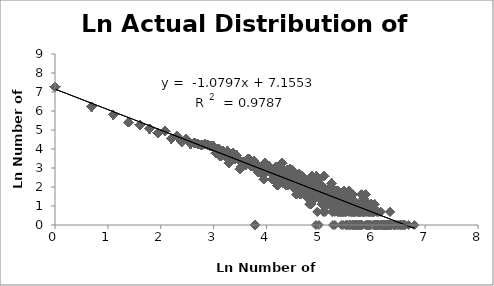
| Category | LnActual Number of Athletes |
|---|---|
| 6.79682 | 0 |
| 6.68711 | 0 |
| 6.62007 | 0 |
| 6.60935 | 0 |
| 6.59578 | 0 |
| 6.57647 | 0 |
| 6.56386 | 0 |
| 6.54391 | 0 |
| 6.54103 | 0 |
| 6.53814 | 0 |
| 6.52942 | 0 |
| 6.50578 | 0 |
| 6.48768 | 0 |
| 6.46303 | 0 |
| 6.43935 | 0 |
| 6.41673 | 0 |
| 6.4151 | 0 |
| 6.41182 | 0 |
| 6.40026 | 0 |
| 6.35957 | 0 |
| 6.35263 | 0 |
| 6.33683 | 0.693 |
| 6.33683 | 0.693 |
| 6.3315 | 0 |
| 6.32972 | 0 |
| 6.32257 | 0 |
| 6.30992 | 0 |
| 6.3081 | 0 |
| 6.30079 | 0 |
| 6.29527 | 0 |
| 6.28972 | 0 |
| 6.31716 | 0 |
| 6.2653 | 0 |
| 6.2634 | 0 |
| 6.25958 | 0 |
| 6.2519 | 0 |
| 6.24611 | 0 |
| 6.24222 | 0 |
| 6.24028 | 0 |
| 6.23048 | 0 |
| 6.22258 | 0 |
| 6.22059 | 0 |
| 6.21661 | 0 |
| 6.21461 | 0 |
| 6.21261 | 0 |
| 6.19848 | 0 |
| 6.19644 | 0 |
| 6.18621 | 0 |
| 6.18415 | 0 |
| 6.18208 | 0 |
| 6.17794 | 0 |
| 6.16542 | 0 |
| 6.16121 | 0.693 |
| 6.16121 | 0.693 |
| 6.1506 | 0 |
| 6.12468 | 0 |
| 6.12249 | 0 |
| 6.11589 | 0 |
| 6.11147 | 0.693 |
| 6.11147 | 0.693 |
| 6.10702 | 0 |
| 6.09807 | 0 |
| 6.09131 | 0.693 |
| 6.09131 | 0.693 |
| 6.08904 | 0 |
| 6.0845 | 0 |
| 6.08222 | 0 |
| 6.07074 | 0 |
| 6.06843 | 0 |
| 6.06611 | 0 |
| 6.06379 | 0 |
| 6.06146 | 0 |
| 6.05444 | 0 |
| 6.05209 | 0 |
| 6.04737 | 0 |
| 6.04501 | 1.099 |
| 6.04501 | 1.099 |
| 6.04501 | 1.099 |
| 6.04263 | 0 |
| 6.03548 | 0.693 |
| 6.03548 | 0.693 |
| 6.03309 | 0 |
| 6.02587 | 0.693 |
| 6.02587 | 0.693 |
| 6.01859 | 0 |
| 6.01372 | 0.693 |
| 6.01372 | 0.693 |
| 6.00881 | 0.693 |
| 6.00881 | 0.693 |
| 5.99894 | 0.693 |
| 5.99894 | 0.693 |
| 5.98394 | 1.099 |
| 5.98394 | 1.099 |
| 5.98394 | 1.099 |
| 5.98141 | 1.099 |
| 5.98141 | 1.099 |
| 5.98141 | 1.099 |
| 5.97889 | 0 |
| 5.97635 | 0.693 |
| 5.97635 | 0.693 |
| 5.97126 | 1.099 |
| 5.97126 | 1.099 |
| 5.97126 | 1.099 |
| 5.95842 | 0.693 |
| 5.95842 | 0.693 |
| 5.95584 | 0 |
| 5.95324 | 0 |
| 5.94542 | 0 |
| 5.94017 | 0.693 |
| 5.94017 | 0.693 |
| 5.93489 | 0 |
| 5.92959 | 1.099 |
| 5.92959 | 1.099 |
| 5.92959 | 1.099 |
| 5.92158 | 0.693 |
| 5.92158 | 0.693 |
| 5.91889 | 0 |
| 5.9162 | 0 |
| 5.9135 | 0 |
| 5.90808 | 0 |
| 5.90536 | 0 |
| 5.8999 | 0 |
| 5.89715 | 1.099 |
| 5.89715 | 1.099 |
| 5.89715 | 1.099 |
| 5.83481 | 0.693 |
| 5.88332 | 0.693 |
| 5.88332 | 0.693 |
| 5.88053 | 1.099 |
| 5.88053 | 1.099 |
| 5.88053 | 1.099 |
| 5.87774 | 1.099 |
| 5.87774 | 1.099 |
| 5.87774 | 1.099 |
| 5.87493 | 1.609 |
| 5.87493 | 1.609 |
| 5.87493 | 1.609 |
| 5.87493 | 1.609 |
| 5.87493 | 1.609 |
| 5.87212 | 0 |
| 5.85793 | 0.693 |
| 5.85793 | 0.693 |
| 5.83773 | 1.386 |
| 5.83773 | 1.386 |
| 5.83773 | 1.386 |
| 5.83773 | 1.386 |
| 5.83481 | 0.693 |
| 5.83188 | 0.693 |
| 5.83188 | 0.693 |
| 5.826 | 0.693 |
| 5.826 | 0.693 |
| 5.82305 | 0.693 |
| 5.82305 | 0.693 |
| 5.80814 | 0 |
| 5.80212 | 0 |
| 5.79909 | 1.609 |
| 5.79909 | 1.609 |
| 5.79909 | 1.609 |
| 5.79909 | 1.609 |
| 5.79909 | 1.609 |
| 5.79606 | 0 |
| 5.78996 | 0 |
| 5.7869 | 0.693 |
| 5.7869 | 0.693 |
| 5.78383 | 1.099 |
| 5.78383 | 1.099 |
| 5.78383 | 1.099 |
| 5.78074 | 1.099 |
| 5.78074 | 1.099 |
| 5.78074 | 1.099 |
| 5.77455 | 0 |
| 5.77144 | 0.693 |
| 5.77144 | 0.693 |
| 5.76832 | 0 |
| 5.76519 | 0 |
| 5.7589 | 0 |
| 5.75257 | 0.693 |
| 5.75257 | 0.693 |
| 5.74939 | 0.693 |
| 5.74939 | 0.693 |
| 5.7462 | 0 |
| 5.73979 | 0.693 |
| 5.73979 | 0.693 |
| 5.73657 | 0.693 |
| 5.73657 | 0.693 |
| 5.7301 | 1.099 |
| 5.7301 | 1.099 |
| 5.7301 | 1.099 |
| 5.72685 | 0 |
| 5.72031 | 0 |
| 5.71703 | 0.693 |
| 5.71703 | 0.693 |
| 5.71043 | 1.099 |
| 5.71043 | 1.099 |
| 5.71043 | 1.099 |
| 5.70378 | 0 |
| 5.70044 | 0 |
| 5.69709 | 0 |
| 5.69373 | 0 |
| 5.69036 | 0 |
| 5.68017 | 0.693 |
| 5.68017 | 0.693 |
| 5.67675 | 0 |
| 5.67332 | 0 |
| 5.66988 | 0 |
| 5.66643 | 0 |
| 5.66296 | 0.693 |
| 5.66296 | 0.693 |
| 5.65249 | 0.693 |
| 5.65249 | 0.693 |
| 5.64897 | 1.099 |
| 5.64897 | 1.099 |
| 5.64897 | 1.099 |
| 5.64545 | 0 |
| 5.64191 | 0.693 |
| 5.64191 | 0.693 |
| 5.63479 | 0 |
| 5.63121 | 1.609 |
| 5.63121 | 1.609 |
| 5.63121 | 1.609 |
| 5.63121 | 1.609 |
| 5.63121 | 1.609 |
| 5.62762 | 0.693 |
| 5.62762 | 0.693 |
| 5.62402 | 0 |
| 5.6204 | 0 |
| 5.61677 | 1.386 |
| 5.61677 | 1.386 |
| 5.61677 | 1.386 |
| 5.61677 | 1.386 |
| 5.61313 | 1.099 |
| 5.61313 | 1.099 |
| 5.61313 | 1.099 |
| 5.6058 | 0.693 |
| 5.6058 | 0.693 |
| 5.60212 | 1.099 |
| 5.60212 | 1.099 |
| 5.60212 | 1.099 |
| 5.59842 | 0.693 |
| 5.59842 | 0.693 |
| 5.59471 | 0 |
| 5.58725 | 1.386 |
| 5.58725 | 1.386 |
| 5.58725 | 1.386 |
| 5.58725 | 1.386 |
| 5.5835 | 1.099 |
| 5.5835 | 1.099 |
| 5.5835 | 1.099 |
| 5.57973 | 1.386 |
| 5.57973 | 1.386 |
| 5.57973 | 1.386 |
| 5.57973 | 1.386 |
| 5.57595 | 0 |
| 5.57215 | 0 |
| 5.56834 | 1.609 |
| 5.56834 | 1.609 |
| 5.56834 | 1.609 |
| 5.56834 | 1.609 |
| 5.56834 | 1.609 |
| 5.56452 | 1.099 |
| 5.56452 | 1.099 |
| 5.56452 | 1.099 |
| 5.56068 | 0.693 |
| 5.56068 | 0.693 |
| 5.55683 | 1.792 |
| 5.55683 | 1.792 |
| 5.55683 | 1.792 |
| 5.55683 | 1.792 |
| 5.55683 | 1.792 |
| 5.55683 | 1.792 |
| 5.54908 | 1.386 |
| 5.54908 | 1.386 |
| 5.54908 | 1.386 |
| 5.54908 | 1.386 |
| 5.54518 | 1.099 |
| 5.54518 | 1.099 |
| 5.54518 | 1.099 |
| 5.54126 | 0 |
| 5.53339 | 1.609 |
| 5.53339 | 1.609 |
| 5.53339 | 1.609 |
| 5.53339 | 1.609 |
| 5.53339 | 1.609 |
| 5.52943 | 1.099 |
| 5.52943 | 1.099 |
| 5.52943 | 1.099 |
| 5.52545 | 0 |
| 5.52146 | 1.386 |
| 5.52146 | 1.386 |
| 5.52146 | 1.386 |
| 5.52146 | 1.386 |
| 5.51745 | 1.386 |
| 5.51745 | 1.386 |
| 5.51745 | 1.386 |
| 5.51745 | 1.386 |
| 5.51343 | 1.099 |
| 5.51343 | 1.099 |
| 5.51343 | 1.099 |
| 5.50939 | 0 |
| 5.50533 | 0.693 |
| 5.50533 | 0.693 |
| 5.50126 | 0 |
| 5.49717 | 1.609 |
| 5.49717 | 1.609 |
| 5.49717 | 1.609 |
| 5.49717 | 1.609 |
| 5.49717 | 1.609 |
| 5.49306 | 0.693 |
| 5.49306 | 0.693 |
| 5.48894 | 1.609 |
| 5.48894 | 1.609 |
| 5.48894 | 1.609 |
| 5.48894 | 1.609 |
| 5.48894 | 1.609 |
| 5.4848 | 1.099 |
| 5.4848 | 1.099 |
| 5.4848 | 1.099 |
| 5.48064 | 1.099 |
| 5.48064 | 1.099 |
| 5.48064 | 1.099 |
| 5.47646 | 1.386 |
| 5.47646 | 1.386 |
| 5.47646 | 1.386 |
| 5.47646 | 1.386 |
| 5.47227 | 1.792 |
| 5.47227 | 1.792 |
| 5.47227 | 1.792 |
| 5.47227 | 1.792 |
| 5.47227 | 1.792 |
| 5.47227 | 1.792 |
| 5.46806 | 0.693 |
| 5.46806 | 0.693 |
| 5.46383 | 1.792 |
| 5.46383 | 1.792 |
| 5.46383 | 1.792 |
| 5.46383 | 1.792 |
| 5.46383 | 1.792 |
| 5.46383 | 1.792 |
| 5.45532 | 0.693 |
| 5.45532 | 0.693 |
| 5.45104 | 0 |
| 5.44674 | 1.099 |
| 5.44674 | 1.099 |
| 5.44674 | 1.099 |
| 5.44242 | 0.693 |
| 5.44242 | 0.693 |
| 5.43808 | 1.386 |
| 5.43808 | 1.386 |
| 5.43808 | 1.386 |
| 5.43808 | 1.386 |
| 5.43372 | 1.609 |
| 5.43372 | 1.609 |
| 5.43372 | 1.609 |
| 5.43372 | 1.609 |
| 5.43372 | 1.609 |
| 5.42935 | 1.386 |
| 5.42935 | 1.386 |
| 5.42935 | 1.386 |
| 5.42935 | 1.386 |
| 5.42495 | 1.386 |
| 5.42495 | 1.386 |
| 5.42495 | 1.386 |
| 5.42495 | 1.386 |
| 5.42053 | 0.693 |
| 5.42053 | 0.693 |
| 5.4161 | 0 |
| 5.41165 | 1.099 |
| 5.41165 | 1.099 |
| 5.41165 | 1.099 |
| 5.40717 | 1.386 |
| 5.40717 | 1.386 |
| 5.40717 | 1.386 |
| 5.40717 | 1.386 |
| 5.40268 | 0.693 |
| 5.40268 | 0.693 |
| 5.39816 | 0.693 |
| 5.39816 | 0.693 |
| 5.39363 | 1.386 |
| 5.39363 | 1.386 |
| 5.39363 | 1.386 |
| 5.39363 | 1.386 |
| 5.38907 | 0.693 |
| 5.38907 | 0.693 |
| 5.3799 | 1.099 |
| 5.3799 | 1.099 |
| 5.3799 | 1.099 |
| 5.37528 | 1.386 |
| 5.37528 | 1.386 |
| 5.37528 | 1.386 |
| 5.37528 | 1.386 |
| 5.37064 | 1.609 |
| 5.37064 | 1.609 |
| 5.37064 | 1.609 |
| 5.37064 | 1.609 |
| 5.37064 | 1.609 |
| 5.36598 | 1.609 |
| 5.36598 | 1.609 |
| 5.36598 | 1.609 |
| 5.36598 | 1.609 |
| 5.36598 | 1.609 |
| 5.36129 | 0.693 |
| 5.36129 | 0.693 |
| 5.35659 | 1.792 |
| 5.35659 | 1.792 |
| 5.35659 | 1.792 |
| 5.35659 | 1.792 |
| 5.35659 | 1.792 |
| 5.35659 | 1.792 |
| 5.35186 | 1.099 |
| 5.35186 | 1.099 |
| 5.35186 | 1.099 |
| 5.34711 | 0.693 |
| 5.34711 | 0.693 |
| 5.34233 | 1.099 |
| 5.34233 | 1.099 |
| 5.34233 | 1.099 |
| 5.33754 | 1.386 |
| 5.33754 | 1.386 |
| 5.33754 | 1.386 |
| 5.33754 | 1.386 |
| 5.33272 | 1.609 |
| 5.33272 | 1.609 |
| 5.33272 | 1.609 |
| 5.33272 | 1.609 |
| 5.33272 | 1.609 |
| 5.32788 | 1.792 |
| 5.32788 | 1.792 |
| 5.32788 | 1.792 |
| 5.32788 | 1.792 |
| 5.32788 | 1.792 |
| 5.32788 | 1.792 |
| 5.32301 | 1.386 |
| 5.32301 | 1.386 |
| 5.32301 | 1.386 |
| 5.32301 | 1.386 |
| 5.31812 | 1.099 |
| 5.31812 | 1.099 |
| 5.31812 | 1.099 |
| 5.31321 | 1.386 |
| 5.31321 | 1.386 |
| 5.31321 | 1.386 |
| 5.31321 | 1.386 |
| 5.30827 | 1.609 |
| 5.30827 | 1.609 |
| 5.30827 | 1.609 |
| 5.30827 | 1.609 |
| 5.30827 | 1.609 |
| 5.3033 | 1.609 |
| 5.3033 | 1.609 |
| 5.3033 | 1.609 |
| 5.3033 | 1.609 |
| 5.3033 | 1.609 |
| 5.29832 | 1.099 |
| 5.29832 | 1.099 |
| 5.29832 | 1.099 |
| 5.2933 | 0 |
| 5.28827 | 0.693 |
| 5.28827 | 0.693 |
| 5.2832 | 1.099 |
| 5.2832 | 1.099 |
| 5.2832 | 1.099 |
| 5.27811 | 1.792 |
| 5.27811 | 1.792 |
| 5.27811 | 1.792 |
| 5.27811 | 1.792 |
| 5.27811 | 1.792 |
| 5.27811 | 1.792 |
| 5.273 | 1.099 |
| 5.273 | 1.099 |
| 5.273 | 1.099 |
| 5.26786 | 1.386 |
| 2.99573 | 4.143 |
| 5.26786 | 1.386 |
| 5.26786 | 1.386 |
| 5.26786 | 1.386 |
| 5.26269 | 1.792 |
| 5.26269 | 1.792 |
| 5.26269 | 1.792 |
| 5.26269 | 1.792 |
| 5.26269 | 1.792 |
| 5.26269 | 1.792 |
| 5.2575 | 0 |
| 2.99573 | 4.143 |
| 5.25227 | 1.386 |
| 5.25227 | 1.386 |
| 5.25227 | 1.386 |
| 5.25227 | 1.386 |
| 5.24702 | 1.946 |
| 5.24702 | 1.946 |
| 5.24702 | 1.946 |
| 5.24702 | 1.946 |
| 5.24702 | 1.946 |
| 5.24702 | 1.946 |
| 5.24702 | 1.946 |
| 5.24175 | 0.693 |
| 5.24175 | 0.693 |
| 5.23644 | 1.609 |
| 5.23644 | 1.609 |
| 5.23644 | 1.609 |
| 5.23644 | 1.609 |
| 5.23644 | 1.609 |
| 5.23111 | 2.197 |
| 5.23111 | 2.197 |
| 5.23111 | 2.197 |
| 5.23111 | 2.197 |
| 5.23111 | 2.197 |
| 5.23111 | 2.197 |
| 5.23111 | 2.197 |
| 5.23111 | 2.197 |
| 5.23111 | 2.197 |
| 5.22575 | 1.386 |
| 5.22575 | 1.386 |
| 5.22575 | 1.386 |
| 5.22575 | 1.386 |
| 5.22036 | 1.386 |
| 5.22036 | 1.386 |
| 5.22036 | 1.386 |
| 5.22036 | 1.386 |
| 5.21494 | 1.099 |
| 5.21494 | 1.099 |
| 5.21494 | 1.099 |
| 5.20949 | 1.609 |
| 5.20949 | 1.609 |
| 5.20949 | 1.609 |
| 5.20949 | 1.609 |
| 5.20949 | 1.609 |
| 5.20401 | 1.946 |
| 5.20401 | 1.946 |
| 5.20401 | 1.946 |
| 5.20401 | 1.946 |
| 5.20401 | 1.946 |
| 5.20401 | 1.946 |
| 5.20401 | 1.946 |
| 5.1985 | 1.099 |
| 5.1985 | 1.099 |
| 5.1985 | 1.099 |
| 5.19296 | 1.609 |
| 5.19296 | 1.609 |
| 5.19296 | 1.609 |
| 5.19296 | 1.609 |
| 5.19296 | 1.609 |
| 5.18739 | 1.386 |
| 5.18739 | 1.386 |
| 5.18739 | 1.386 |
| 5.18739 | 1.386 |
| 5.18178 | 1.099 |
| 5.18178 | 1.099 |
| 5.18178 | 1.099 |
| 5.17615 | 1.386 |
| 5.17615 | 1.386 |
| 5.17615 | 1.386 |
| 5.17615 | 1.386 |
| 5.17048 | 1.386 |
| 5.17048 | 1.386 |
| 5.17048 | 1.386 |
| 5.17048 | 1.386 |
| 5.16479 | 1.386 |
| 5.16479 | 1.386 |
| 5.16479 | 1.386 |
| 5.16479 | 1.386 |
| 5.15906 | 1.099 |
| 5.15906 | 1.099 |
| 5.15906 | 1.099 |
| 5.15329 | 1.609 |
| 5.15329 | 1.609 |
| 5.15329 | 1.609 |
| 5.15329 | 1.609 |
| 5.15329 | 1.609 |
| 5.14749 | 1.792 |
| 5.14749 | 1.792 |
| 5.14749 | 1.792 |
| 5.14749 | 1.792 |
| 5.14749 | 1.792 |
| 5.14749 | 1.792 |
| 5.14166 | 1.609 |
| 5.14166 | 1.609 |
| 5.14166 | 1.609 |
| 5.14166 | 1.609 |
| 5.14166 | 1.609 |
| 5.1358 | 1.386 |
| 5.1358 | 1.386 |
| 5.1358 | 1.386 |
| 5.1358 | 1.386 |
| 5.1299 | 1.386 |
| 5.1299 | 1.386 |
| 5.1299 | 1.386 |
| 5.1299 | 1.386 |
| 5.1299 | 1.386 |
| 5.12396 | 1.386 |
| 5.12396 | 1.386 |
| 5.12396 | 1.386 |
| 5.12396 | 1.386 |
| 5.11799 | 1.099 |
| 5.11799 | 1.099 |
| 5.11799 | 1.099 |
| 5.11199 | 1.792 |
| 5.11199 | 1.792 |
| 5.11199 | 1.792 |
| 5.11199 | 1.792 |
| 5.11199 | 1.792 |
| 5.11199 | 1.792 |
| 5.10595 | 0.693 |
| 5.10595 | 0.693 |
| 5.09987 | 1.792 |
| 5.09987 | 1.792 |
| 5.09987 | 1.792 |
| 5.09987 | 1.792 |
| 5.09987 | 1.792 |
| 5.09987 | 1.792 |
| 5.09375 | 1.386 |
| 5.09375 | 1.386 |
| 5.09375 | 1.386 |
| 5.09375 | 1.386 |
| 5.0876 | 2.565 |
| 5.0876 | 2.565 |
| 5.0876 | 2.565 |
| 5.0876 | 2.565 |
| 5.0876 | 2.565 |
| 5.0876 | 2.565 |
| 5.0876 | 2.565 |
| 5.0876 | 2.565 |
| 5.0876 | 2.565 |
| 5.0876 | 2.565 |
| 5.0876 | 2.565 |
| 5.0876 | 2.565 |
| 5.0876 | 2.565 |
| 5.0814 | 1.946 |
| 5.0814 | 1.946 |
| 5.0814 | 1.946 |
| 5.0814 | 1.946 |
| 5.0814 | 1.946 |
| 5.0814 | 1.946 |
| 5.0814 | 1.946 |
| 5.07517 | 0.693 |
| 5.07517 | 0.693 |
| 5.0689 | 1.099 |
| 5.0689 | 1.099 |
| 5.0689 | 1.099 |
| 5.0626 | 1.609 |
| 5.0626 | 1.609 |
| 5.0626 | 1.609 |
| 5.0626 | 1.609 |
| 5.0626 | 1.609 |
| 5.05625 | 1.099 |
| 5.05625 | 1.099 |
| 5.05625 | 1.099 |
| 5.04986 | 1.099 |
| 5.04986 | 1.099 |
| 5.04986 | 1.099 |
| 5.04343 | 2.079 |
| 5.04343 | 2.079 |
| 5.04343 | 2.079 |
| 5.04343 | 2.079 |
| 5.04343 | 2.079 |
| 5.04343 | 2.079 |
| 5.04343 | 2.079 |
| 5.04343 | 2.079 |
| 5.03695 | 2.079 |
| 5.03695 | 2.079 |
| 5.03695 | 2.079 |
| 5.03695 | 2.079 |
| 5.03695 | 2.079 |
| 5.03695 | 2.079 |
| 5.03695 | 2.079 |
| 5.03695 | 2.079 |
| 5.03044 | 2.079 |
| 5.03044 | 2.079 |
| 5.03044 | 2.079 |
| 5.03044 | 2.079 |
| 5.03044 | 2.079 |
| 5.03044 | 2.079 |
| 5.03044 | 2.079 |
| 5.03044 | 2.079 |
| 5.02388 | 1.792 |
| 5.02388 | 1.792 |
| 5.02388 | 1.792 |
| 5.02388 | 1.792 |
| 5.02388 | 1.792 |
| 5.02388 | 1.792 |
| 5.01728 | 1.946 |
| 5.01728 | 1.946 |
| 5.01728 | 1.946 |
| 5.01728 | 1.946 |
| 5.01728 | 1.946 |
| 5.01728 | 1.946 |
| 5.01728 | 1.946 |
| 5.01064 | 1.946 |
| 5.01064 | 1.946 |
| 5.01064 | 1.946 |
| 5.01064 | 1.946 |
| 5.01064 | 1.946 |
| 5.01064 | 1.946 |
| 5.01064 | 1.946 |
| 5.00395 | 1.386 |
| 5.00395 | 1.386 |
| 5.00395 | 1.386 |
| 5.00395 | 1.386 |
| 4.99721 | 1.946 |
| 4.99721 | 1.946 |
| 4.99721 | 1.946 |
| 4.99721 | 1.946 |
| 4.99721 | 1.946 |
| 4.99721 | 1.946 |
| 4.99721 | 1.946 |
| 4.99043 | 0 |
| 4.98361 | 2.079 |
| 4.98361 | 2.079 |
| 4.98361 | 2.079 |
| 4.98361 | 2.079 |
| 4.98361 | 2.079 |
| 4.98361 | 2.079 |
| 4.98361 | 2.079 |
| 4.98361 | 2.079 |
| 4.97673 | 2.398 |
| 4.97673 | 2.398 |
| 4.97673 | 2.398 |
| 4.97673 | 2.398 |
| 4.97673 | 2.398 |
| 4.97673 | 2.398 |
| 4.97673 | 2.398 |
| 4.97673 | 2.398 |
| 4.97673 | 2.398 |
| 4.97673 | 2.398 |
| 4.97673 | 2.398 |
| 4.96981 | 1.946 |
| 4.96981 | 1.946 |
| 4.96981 | 1.946 |
| 4.96981 | 1.946 |
| 4.96981 | 1.946 |
| 4.96981 | 1.946 |
| 4.96981 | 1.946 |
| 4.96284 | 0.693 |
| 4.96284 | 0.693 |
| 4.95583 | 1.792 |
| 4.95583 | 1.792 |
| 4.95583 | 1.792 |
| 4.95583 | 1.792 |
| 4.95583 | 1.792 |
| 4.95583 | 1.792 |
| 4.94876 | 1.792 |
| 4.94876 | 1.792 |
| 4.94876 | 1.792 |
| 4.94876 | 1.792 |
| 4.94876 | 1.792 |
| 4.94876 | 1.792 |
| 4.94164 | 2.565 |
| 4.94164 | 2.565 |
| 4.94164 | 2.565 |
| 4.94164 | 2.565 |
| 4.94164 | 2.565 |
| 4.94164 | 2.565 |
| 4.94164 | 2.565 |
| 4.94164 | 2.565 |
| 4.94164 | 2.565 |
| 4.94164 | 2.565 |
| 4.94164 | 2.565 |
| 4.94164 | 2.565 |
| 4.94164 | 2.565 |
| 4.93447 | 0 |
| 4.92725 | 1.946 |
| 4.92725 | 1.946 |
| 4.92725 | 1.946 |
| 4.92725 | 1.946 |
| 4.92725 | 1.946 |
| 4.92725 | 1.946 |
| 4.92725 | 1.946 |
| 4.91998 | 2.079 |
| 4.91998 | 2.079 |
| 4.91998 | 2.079 |
| 4.91998 | 2.079 |
| 4.91998 | 2.079 |
| 4.91998 | 2.079 |
| 4.91998 | 2.079 |
| 4.91998 | 2.079 |
| 4.91265 | 1.386 |
| 4.91265 | 1.386 |
| 4.91265 | 1.386 |
| 4.91265 | 1.386 |
| 4.90527 | 1.792 |
| 4.90527 | 1.792 |
| 4.90527 | 1.792 |
| 4.90527 | 1.792 |
| 4.90527 | 1.792 |
| 4.90527 | 1.792 |
| 4.89784 | 1.946 |
| 4.89784 | 1.946 |
| 4.89784 | 1.946 |
| 4.89784 | 1.946 |
| 4.89784 | 1.946 |
| 4.89784 | 1.946 |
| 4.89784 | 1.946 |
| 4.89035 | 1.609 |
| 4.89035 | 1.609 |
| 4.89035 | 1.609 |
| 4.89035 | 1.609 |
| 4.89035 | 1.609 |
| 4.8828 | 1.609 |
| 4.8828 | 1.609 |
| 4.8828 | 1.609 |
| 4.8828 | 1.609 |
| 4.8828 | 1.609 |
| 4.8752 | 1.609 |
| 4.8752 | 1.609 |
| 4.8752 | 1.609 |
| 4.8752 | 1.609 |
| 4.8752 | 1.609 |
| 4.86753 | 2.079 |
| 2.99573 | 4.143 |
| 4.86753 | 2.079 |
| 4.86753 | 2.079 |
| 4.86753 | 2.079 |
| 4.86753 | 2.079 |
| 4.86753 | 2.079 |
| 4.86753 | 2.079 |
| 4.86753 | 2.079 |
| 4.85981 | 2.565 |
| 4.85981 | 2.565 |
| 4.85981 | 2.565 |
| 4.85981 | 2.565 |
| 4.85981 | 2.565 |
| 4.85981 | 2.565 |
| 4.85981 | 2.565 |
| 4.85981 | 2.565 |
| 4.85981 | 2.565 |
| 4.85981 | 2.565 |
| 4.85981 | 2.565 |
| 4.85981 | 2.565 |
| 4.85981 | 2.565 |
| 4.85203 | 2.398 |
| 4.85203 | 2.398 |
| 4.85203 | 2.398 |
| 4.85203 | 2.398 |
| 4.85203 | 2.398 |
| 4.85203 | 2.398 |
| 4.85203 | 2.398 |
| 4.85203 | 2.398 |
| 4.85203 | 2.398 |
| 4.85203 | 2.398 |
| 4.85203 | 2.398 |
| 4.84419 | 1.099 |
| 4.84419 | 1.099 |
| 4.84419 | 1.099 |
| 4.83628 | 1.609 |
| 4.83628 | 1.609 |
| 4.83628 | 1.609 |
| 4.83628 | 1.609 |
| 4.83628 | 1.609 |
| 4.82831 | 1.609 |
| 4.82831 | 1.609 |
| 4.82831 | 1.609 |
| 4.82831 | 1.609 |
| 4.82831 | 1.609 |
| 4.82028 | 1.099 |
| 4.82028 | 1.099 |
| 4.82028 | 1.099 |
| 4.81218 | 1.099 |
| 4.81218 | 1.099 |
| 4.81218 | 1.099 |
| 4.80402 | 2.303 |
| 4.80402 | 2.303 |
| 4.80402 | 2.303 |
| 4.80402 | 2.303 |
| 4.80402 | 2.303 |
| 4.80402 | 2.303 |
| 4.80402 | 2.303 |
| 4.80402 | 2.303 |
| 4.80402 | 2.303 |
| 4.80402 | 2.303 |
| 4.79579 | 1.386 |
| 4.79579 | 1.386 |
| 4.79579 | 1.386 |
| 4.79579 | 1.386 |
| 4.78749 | 1.386 |
| 4.78749 | 1.386 |
| 4.78749 | 1.386 |
| 4.78749 | 1.386 |
| 4.77912 | 1.946 |
| 4.77912 | 1.946 |
| 4.77912 | 1.946 |
| 4.77912 | 1.946 |
| 4.77912 | 1.946 |
| 4.77912 | 1.946 |
| 4.77912 | 1.946 |
| 4.77068 | 2.197 |
| 4.77068 | 2.197 |
| 4.77068 | 2.197 |
| 4.77068 | 2.197 |
| 4.77068 | 2.197 |
| 4.77068 | 2.197 |
| 4.77068 | 2.197 |
| 4.77068 | 2.197 |
| 4.77068 | 2.197 |
| 4.76217 | 1.609 |
| 4.76217 | 1.609 |
| 4.76217 | 1.609 |
| 4.76217 | 1.609 |
| 4.76217 | 1.609 |
| 4.75359 | 2.197 |
| 4.75359 | 2.197 |
| 4.75359 | 2.197 |
| 4.75359 | 2.197 |
| 4.75359 | 2.197 |
| 4.75359 | 2.197 |
| 4.75359 | 2.197 |
| 4.75359 | 2.197 |
| 4.75359 | 2.197 |
| 4.74493 | 2.303 |
| 4.74493 | 2.303 |
| 4.74493 | 2.303 |
| 4.74493 | 2.303 |
| 4.74493 | 2.303 |
| 4.74493 | 2.303 |
| 4.74493 | 2.303 |
| 4.74493 | 2.303 |
| 4.74493 | 2.303 |
| 4.74493 | 2.303 |
| 4.7362 | 1.946 |
| 4.7362 | 1.946 |
| 4.7362 | 1.946 |
| 4.7362 | 1.946 |
| 4.7362 | 1.946 |
| 4.7362 | 1.946 |
| 4.7362 | 1.946 |
| 4.72739 | 1.609 |
| 4.72739 | 1.609 |
| 4.72739 | 1.609 |
| 4.72739 | 1.609 |
| 4.72739 | 1.609 |
| 4.7185 | 1.946 |
| 4.7185 | 1.946 |
| 4.7185 | 1.946 |
| 4.7185 | 1.946 |
| 4.7185 | 1.946 |
| 4.7185 | 1.946 |
| 4.7185 | 1.946 |
| 4.70953 | 2.303 |
| 4.70953 | 2.303 |
| 4.70953 | 2.303 |
| 4.70953 | 2.303 |
| 4.70953 | 2.303 |
| 4.70953 | 2.303 |
| 4.70953 | 2.303 |
| 4.70953 | 2.303 |
| 4.70953 | 2.303 |
| 4.70953 | 2.303 |
| 4.70953 | 2.303 |
| 4.70953 | 2.303 |
| 4.70048 | 1.946 |
| 4.70048 | 1.946 |
| 4.70048 | 1.946 |
| 4.70048 | 1.946 |
| 4.70048 | 1.946 |
| 4.70048 | 1.946 |
| 4.70048 | 1.946 |
| 4.69135 | 1.946 |
| 4.69135 | 1.946 |
| 4.69135 | 1.946 |
| 4.69135 | 1.946 |
| 4.69135 | 1.946 |
| 4.69135 | 1.946 |
| 4.69135 | 1.946 |
| 4.68213 | 1.946 |
| 4.68213 | 1.946 |
| 4.68213 | 1.946 |
| 4.68213 | 1.946 |
| 4.68213 | 1.946 |
| 4.68213 | 1.946 |
| 4.68213 | 1.946 |
| 4.67283 | 2.565 |
| 4.67283 | 2.565 |
| 4.67283 | 2.565 |
| 4.67283 | 2.565 |
| 4.67283 | 2.565 |
| 4.67283 | 2.565 |
| 4.67283 | 2.565 |
| 4.67283 | 2.565 |
| 4.67283 | 2.565 |
| 4.67283 | 2.565 |
| 4.67283 | 2.565 |
| 4.67283 | 2.565 |
| 4.67283 | 2.565 |
| 4.66344 | 2.398 |
| 4.66344 | 2.398 |
| 4.66344 | 2.398 |
| 4.66344 | 2.398 |
| 4.66344 | 2.398 |
| 4.66344 | 2.398 |
| 4.66344 | 2.398 |
| 4.66344 | 2.398 |
| 4.66344 | 2.398 |
| 4.66344 | 2.398 |
| 4.66344 | 2.398 |
| 4.65396 | 2.485 |
| 4.65396 | 2.485 |
| 4.65396 | 2.485 |
| 4.65396 | 2.485 |
| 4.65396 | 2.485 |
| 4.65396 | 2.485 |
| 4.65396 | 2.485 |
| 4.65396 | 2.485 |
| 4.65396 | 2.485 |
| 4.65396 | 2.485 |
| 4.65396 | 2.485 |
| 4.65396 | 2.485 |
| 4.64439 | 1.609 |
| 4.64439 | 1.609 |
| 4.64439 | 1.609 |
| 4.64439 | 1.609 |
| 4.64439 | 1.609 |
| 4.63473 | 1.609 |
| 4.63473 | 1.609 |
| 4.63473 | 1.609 |
| 4.63473 | 1.609 |
| 4.63473 | 1.609 |
| 4.62497 | 2.639 |
| 4.62497 | 2.639 |
| 4.62497 | 2.639 |
| 4.62497 | 2.639 |
| 4.62497 | 2.639 |
| 4.62497 | 2.639 |
| 4.62497 | 2.639 |
| 4.62497 | 2.639 |
| 4.62497 | 2.639 |
| 4.62497 | 2.639 |
| 4.62497 | 2.639 |
| 4.62497 | 2.639 |
| 4.62497 | 2.639 |
| 4.62497 | 2.639 |
| 4.61512 | 2.708 |
| 4.61512 | 2.708 |
| 4.61512 | 2.708 |
| 4.61512 | 2.708 |
| 4.61512 | 2.708 |
| 4.61512 | 2.708 |
| 4.61512 | 2.708 |
| 4.61512 | 2.708 |
| 4.61512 | 2.708 |
| 4.61512 | 2.708 |
| 4.61512 | 2.708 |
| 4.61512 | 2.708 |
| 4.61512 | 2.708 |
| 4.61512 | 2.708 |
| 4.61512 | 2.708 |
| 4.60517 | 2.565 |
| 4.60517 | 2.565 |
| 4.60517 | 2.565 |
| 4.60517 | 2.565 |
| 4.60517 | 2.565 |
| 4.60517 | 2.565 |
| 4.60517 | 2.565 |
| 4.60517 | 2.565 |
| 4.60517 | 2.565 |
| 4.60517 | 2.565 |
| 4.60517 | 2.565 |
| 4.60517 | 2.565 |
| 4.60517 | 2.565 |
| 4.59512 | 2.303 |
| 4.59512 | 2.303 |
| 4.59512 | 2.303 |
| 4.59512 | 2.303 |
| 4.59512 | 2.303 |
| 4.59512 | 2.303 |
| 4.59512 | 2.303 |
| 4.59512 | 2.303 |
| 4.59512 | 2.303 |
| 4.59512 | 2.303 |
| 4.58497 | 1.946 |
| 4.58497 | 1.946 |
| 4.58497 | 1.946 |
| 4.58497 | 1.946 |
| 4.58497 | 1.946 |
| 4.58497 | 1.946 |
| 4.58497 | 1.946 |
| 4.57471 | 2.485 |
| 4.57471 | 2.485 |
| 4.57471 | 2.485 |
| 4.57471 | 2.485 |
| 4.57471 | 2.485 |
| 4.57471 | 2.485 |
| 4.57471 | 2.485 |
| 4.57471 | 2.485 |
| 4.57471 | 2.485 |
| 4.57471 | 2.485 |
| 4.57471 | 2.485 |
| 4.57471 | 2.485 |
| 4.56435 | 1.609 |
| 4.56435 | 1.609 |
| 4.56435 | 1.609 |
| 4.56435 | 1.609 |
| 4.56435 | 1.609 |
| 4.55388 | 2.565 |
| 4.55388 | 2.565 |
| 4.55388 | 2.565 |
| 4.55388 | 2.565 |
| 4.55388 | 2.565 |
| 4.55388 | 2.565 |
| 4.55388 | 2.565 |
| 4.55388 | 2.565 |
| 4.55388 | 2.565 |
| 4.55388 | 2.565 |
| 4.55388 | 2.565 |
| 4.55388 | 2.565 |
| 4.55388 | 2.565 |
| 4.54329 | 2.303 |
| 4.54329 | 2.303 |
| 4.54329 | 2.303 |
| 4.54329 | 2.303 |
| 4.54329 | 2.303 |
| 4.54329 | 2.303 |
| 4.54329 | 2.303 |
| 4.54329 | 2.303 |
| 4.54329 | 2.303 |
| 4.54329 | 2.303 |
| 4.5326 | 2.398 |
| 4.5326 | 2.398 |
| 4.5326 | 2.398 |
| 4.5326 | 2.398 |
| 4.5326 | 2.398 |
| 4.5326 | 2.398 |
| 4.5326 | 2.398 |
| 4.5326 | 2.398 |
| 4.5326 | 2.398 |
| 4.5326 | 2.398 |
| 4.5326 | 2.398 |
| 4.52179 | 1.946 |
| 4.52179 | 1.946 |
| 4.52179 | 1.946 |
| 4.52179 | 1.946 |
| 4.52179 | 1.946 |
| 4.52179 | 1.946 |
| 4.52179 | 1.946 |
| 4.51086 | 2.303 |
| 4.51086 | 2.303 |
| 4.51086 | 2.303 |
| 4.51086 | 2.303 |
| 4.51086 | 2.303 |
| 4.51086 | 2.303 |
| 4.51086 | 2.303 |
| 4.51086 | 2.303 |
| 4.51086 | 2.303 |
| 4.51086 | 2.303 |
| 4.49981 | 2.197 |
| 4.49981 | 2.197 |
| 4.49981 | 2.197 |
| 4.49981 | 2.197 |
| 4.49981 | 2.197 |
| 4.49981 | 2.197 |
| 4.49981 | 2.197 |
| 4.49981 | 2.197 |
| 4.49981 | 2.197 |
| 4.48864 | 2.079 |
| 4.48864 | 2.079 |
| 4.48864 | 2.079 |
| 4.48864 | 2.079 |
| 4.48864 | 2.079 |
| 4.48864 | 2.079 |
| 4.48864 | 2.079 |
| 4.48864 | 2.079 |
| 4.47734 | 2.89 |
| 4.47734 | 2.89 |
| 4.47734 | 2.89 |
| 4.47734 | 2.89 |
| 4.47734 | 2.89 |
| 4.47734 | 2.89 |
| 4.47734 | 2.89 |
| 4.47734 | 2.89 |
| 4.47734 | 2.89 |
| 4.47734 | 2.89 |
| 4.47734 | 2.89 |
| 4.47734 | 2.89 |
| 4.47734 | 2.89 |
| 4.47734 | 2.89 |
| 4.47734 | 2.89 |
| 4.47734 | 2.89 |
| 4.47734 | 2.89 |
| 4.47734 | 2.89 |
| 4.46591 | 2.197 |
| 4.46591 | 2.197 |
| 4.46591 | 2.197 |
| 4.46591 | 2.197 |
| 4.46591 | 2.197 |
| 4.46591 | 2.197 |
| 4.46591 | 2.197 |
| 4.46591 | 2.197 |
| 4.46591 | 2.197 |
| 4.45435 | 2.485 |
| 4.45435 | 2.485 |
| 4.45435 | 2.485 |
| 4.45435 | 2.485 |
| 4.45435 | 2.485 |
| 4.45435 | 2.485 |
| 4.45435 | 2.485 |
| 4.45435 | 2.485 |
| 4.45435 | 2.485 |
| 4.45435 | 2.485 |
| 4.45435 | 2.485 |
| 4.45435 | 2.485 |
| 4.44265 | 2.944 |
| 4.44265 | 2.944 |
| 4.44265 | 2.944 |
| 4.44265 | 2.944 |
| 4.44265 | 2.944 |
| 4.44265 | 2.944 |
| 4.44265 | 2.944 |
| 4.44265 | 2.944 |
| 4.44265 | 2.944 |
| 4.44265 | 2.944 |
| 4.44265 | 2.944 |
| 4.44265 | 2.944 |
| 4.44265 | 2.944 |
| 4.44265 | 2.944 |
| 4.44265 | 2.944 |
| 4.44265 | 2.944 |
| 4.44265 | 2.944 |
| 4.44265 | 2.944 |
| 4.44265 | 2.944 |
| 4.43082 | 2.485 |
| 4.43082 | 2.485 |
| 4.43082 | 2.485 |
| 4.43082 | 2.485 |
| 4.43082 | 2.485 |
| 4.43082 | 2.485 |
| 4.43082 | 2.485 |
| 4.43082 | 2.485 |
| 4.43082 | 2.485 |
| 4.43082 | 2.485 |
| 4.43082 | 2.485 |
| 4.43082 | 2.485 |
| 4.41884 | 2.639 |
| 4.41884 | 2.639 |
| 4.41884 | 2.639 |
| 4.41884 | 2.639 |
| 4.41884 | 2.639 |
| 4.41884 | 2.639 |
| 4.41884 | 2.639 |
| 4.41884 | 2.639 |
| 4.41884 | 2.639 |
| 4.41884 | 2.639 |
| 4.41884 | 2.639 |
| 4.41884 | 2.639 |
| 4.41884 | 2.639 |
| 4.41884 | 2.639 |
| 4.40672 | 2.079 |
| 4.40672 | 2.079 |
| 4.40672 | 2.079 |
| 4.40672 | 2.079 |
| 4.40672 | 2.079 |
| 4.40672 | 2.079 |
| 4.40672 | 2.079 |
| 4.40672 | 2.079 |
| 4.39445 | 2.89 |
| 4.39445 | 2.89 |
| 4.39445 | 2.89 |
| 4.39445 | 2.89 |
| 4.39445 | 2.89 |
| 4.39445 | 2.89 |
| 4.39445 | 2.89 |
| 4.39445 | 2.89 |
| 4.39445 | 2.89 |
| 4.39445 | 2.89 |
| 4.39445 | 2.89 |
| 4.39445 | 2.89 |
| 4.39445 | 2.89 |
| 4.39445 | 2.89 |
| 4.39445 | 2.89 |
| 4.39445 | 2.89 |
| 4.39445 | 2.89 |
| 4.39445 | 2.89 |
| 4.38203 | 2.079 |
| 4.38203 | 2.079 |
| 4.38203 | 2.079 |
| 4.38203 | 2.079 |
| 4.38203 | 2.079 |
| 4.38203 | 2.079 |
| 4.38203 | 2.079 |
| 4.38203 | 2.079 |
| 4.36945 | 2.197 |
| 4.36945 | 2.197 |
| 4.36945 | 2.197 |
| 4.36945 | 2.197 |
| 4.36945 | 2.197 |
| 4.36945 | 2.197 |
| 4.36945 | 2.197 |
| 4.36945 | 2.197 |
| 4.36945 | 2.197 |
| 4.35671 | 2.485 |
| 4.35671 | 2.485 |
| 4.35671 | 2.485 |
| 4.35671 | 2.485 |
| 4.35671 | 2.485 |
| 4.35671 | 2.485 |
| 4.35671 | 2.485 |
| 4.35671 | 2.485 |
| 4.35671 | 2.485 |
| 4.35671 | 2.485 |
| 4.35671 | 2.485 |
| 4.35671 | 2.485 |
| 4.34381 | 2.303 |
| 4.34381 | 2.303 |
| 4.34381 | 2.303 |
| 4.34381 | 2.303 |
| 4.34381 | 2.303 |
| 4.34381 | 2.303 |
| 4.34381 | 2.303 |
| 4.34381 | 2.303 |
| 4.34381 | 2.303 |
| 4.34381 | 2.303 |
| 4.33073 | 2.833 |
| 4.33073 | 2.833 |
| 4.33073 | 2.833 |
| 4.33073 | 2.833 |
| 4.33073 | 2.833 |
| 4.33073 | 2.833 |
| 4.33073 | 2.833 |
| 4.33073 | 2.833 |
| 4.33073 | 2.833 |
| 4.33073 | 2.833 |
| 4.33073 | 2.833 |
| 4.33073 | 2.833 |
| 4.33073 | 2.833 |
| 4.33073 | 2.833 |
| 4.33073 | 2.833 |
| 4.33073 | 2.833 |
| 4.33073 | 2.833 |
| 4.31749 | 2.197 |
| 4.31749 | 2.197 |
| 4.31749 | 2.197 |
| 4.31749 | 2.197 |
| 4.31749 | 2.197 |
| 4.31749 | 2.197 |
| 4.31749 | 2.197 |
| 4.31749 | 2.197 |
| 4.31749 | 2.197 |
| 4.30407 | 2.303 |
| 4.30407 | 2.303 |
| 4.30407 | 2.303 |
| 4.30407 | 2.303 |
| 4.30407 | 2.303 |
| 4.30407 | 2.303 |
| 4.30407 | 2.303 |
| 4.30407 | 2.303 |
| 4.30407 | 2.303 |
| 4.30407 | 2.303 |
| 4.29046 | 3.258 |
| 4.29046 | 3.258 |
| 4.29046 | 3.258 |
| 4.29046 | 3.258 |
| 4.29046 | 3.258 |
| 4.29046 | 3.258 |
| 4.29046 | 3.258 |
| 4.29046 | 3.258 |
| 4.29046 | 3.258 |
| 4.29046 | 3.258 |
| 4.29046 | 3.258 |
| 4.29046 | 3.258 |
| 4.29046 | 3.258 |
| 4.29046 | 3.258 |
| 4.29046 | 3.258 |
| 4.29046 | 3.258 |
| 4.29046 | 3.258 |
| 4.29046 | 3.258 |
| 4.29046 | 3.258 |
| 4.29046 | 3.258 |
| 4.29046 | 3.258 |
| 4.29046 | 3.258 |
| 4.29046 | 3.258 |
| 4.29046 | 3.258 |
| 4.29046 | 3.258 |
| 4.29046 | 3.258 |
| 4.27667 | 2.565 |
| 4.27667 | 2.565 |
| 4.27667 | 2.565 |
| 4.27667 | 2.565 |
| 4.27667 | 2.565 |
| 4.27667 | 2.565 |
| 4.27667 | 2.565 |
| 4.27667 | 2.565 |
| 4.27667 | 2.565 |
| 4.27667 | 2.565 |
| 4.27667 | 2.565 |
| 4.27667 | 2.565 |
| 4.27667 | 2.565 |
| 4.26268 | 2.485 |
| 4.26268 | 2.485 |
| 4.26268 | 2.485 |
| 4.26268 | 2.485 |
| 4.26268 | 2.485 |
| 4.26268 | 2.485 |
| 4.26268 | 2.485 |
| 4.26268 | 2.485 |
| 4.26268 | 2.485 |
| 4.26268 | 2.485 |
| 4.26268 | 2.485 |
| 4.26268 | 2.485 |
| 4.2485 | 2.303 |
| 4.2485 | 2.303 |
| 4.2485 | 2.303 |
| 4.2485 | 2.303 |
| 4.2485 | 2.303 |
| 4.2485 | 2.303 |
| 4.2485 | 2.303 |
| 4.2485 | 2.303 |
| 4.2485 | 2.303 |
| 4.2485 | 2.303 |
| 4.23411 | 3.045 |
| 4.23411 | 3.045 |
| 4.23411 | 3.045 |
| 4.23411 | 3.045 |
| 4.23411 | 3.045 |
| 4.23411 | 3.045 |
| 4.23411 | 3.045 |
| 4.23411 | 3.045 |
| 4.23411 | 3.045 |
| 4.23411 | 3.045 |
| 4.23411 | 3.045 |
| 4.23411 | 3.045 |
| 4.23411 | 3.045 |
| 4.23411 | 3.045 |
| 4.23411 | 3.045 |
| 4.23411 | 3.045 |
| 4.23411 | 3.045 |
| 4.23411 | 3.045 |
| 4.23411 | 3.045 |
| 4.23411 | 3.045 |
| 4.23411 | 3.045 |
| 4.21951 | 2.773 |
| 4.21951 | 2.773 |
| 4.21951 | 2.773 |
| 4.21951 | 2.773 |
| 4.21951 | 2.773 |
| 4.21951 | 2.773 |
| 4.21951 | 2.773 |
| 4.21951 | 2.773 |
| 4.21951 | 2.773 |
| 4.21951 | 2.773 |
| 4.21951 | 2.773 |
| 4.21951 | 2.773 |
| 4.21951 | 2.773 |
| 4.21951 | 2.773 |
| 4.21951 | 2.773 |
| 4.21951 | 2.773 |
| 4.20469 | 2.079 |
| 4.20469 | 2.079 |
| 4.20469 | 2.079 |
| 4.20469 | 2.079 |
| 4.20469 | 2.079 |
| 4.20469 | 2.079 |
| 4.20469 | 2.079 |
| 4.20469 | 2.079 |
| 4.18965 | 2.398 |
| 4.18965 | 2.398 |
| 4.18965 | 2.398 |
| 4.18965 | 2.398 |
| 4.18965 | 2.398 |
| 4.18965 | 2.398 |
| 4.18965 | 2.398 |
| 4.18965 | 2.398 |
| 4.18965 | 2.398 |
| 4.18965 | 2.398 |
| 4.18965 | 2.398 |
| 4.17439 | 3.045 |
| 4.17439 | 3.045 |
| 4.17439 | 3.045 |
| 4.17439 | 3.045 |
| 4.17439 | 3.045 |
| 4.17439 | 3.045 |
| 4.17439 | 3.045 |
| 4.17439 | 3.045 |
| 4.17439 | 3.045 |
| 4.17439 | 3.045 |
| 4.17439 | 3.045 |
| 4.17439 | 3.045 |
| 4.17439 | 3.045 |
| 4.17439 | 3.045 |
| 4.17439 | 3.045 |
| 4.17439 | 3.045 |
| 4.17439 | 3.045 |
| 4.17439 | 3.045 |
| 4.17439 | 3.045 |
| 4.17439 | 3.045 |
| 4.17439 | 3.045 |
| 4.15888 | 2.639 |
| 4.15888 | 2.639 |
| 4.15888 | 2.639 |
| 4.15888 | 2.639 |
| 4.15888 | 2.639 |
| 4.15888 | 2.639 |
| 4.15888 | 2.639 |
| 4.15888 | 2.639 |
| 4.15888 | 2.639 |
| 4.15888 | 2.639 |
| 4.15888 | 2.639 |
| 4.15888 | 2.639 |
| 4.15888 | 2.639 |
| 4.15888 | 2.639 |
| 4.14313 | 2.398 |
| 4.14313 | 2.398 |
| 4.14313 | 2.398 |
| 4.14313 | 2.398 |
| 4.14313 | 2.398 |
| 4.14313 | 2.398 |
| 4.14313 | 2.398 |
| 4.14313 | 2.398 |
| 4.14313 | 2.398 |
| 4.14313 | 2.398 |
| 4.14313 | 2.398 |
| 4.12713 | 2.639 |
| 4.12713 | 2.639 |
| 4.12713 | 2.639 |
| 4.12713 | 2.639 |
| 4.12713 | 2.639 |
| 4.12713 | 2.639 |
| 4.12713 | 2.639 |
| 4.12713 | 2.639 |
| 4.12713 | 2.639 |
| 4.12713 | 2.639 |
| 4.12713 | 2.639 |
| 4.12713 | 2.639 |
| 4.12713 | 2.639 |
| 4.12713 | 2.639 |
| 4.11087 | 2.398 |
| 4.11087 | 2.398 |
| 4.11087 | 2.398 |
| 4.11087 | 2.398 |
| 4.11087 | 2.398 |
| 4.11087 | 2.398 |
| 4.11087 | 2.398 |
| 4.11087 | 2.398 |
| 4.11087 | 2.398 |
| 4.11087 | 2.398 |
| 4.11087 | 2.398 |
| 4.09434 | 2.833 |
| 4.09434 | 2.833 |
| 4.09434 | 2.833 |
| 4.09434 | 2.833 |
| 4.09434 | 2.833 |
| 4.09434 | 2.833 |
| 4.09434 | 2.833 |
| 4.09434 | 2.833 |
| 4.09434 | 2.833 |
| 4.09434 | 2.833 |
| 4.09434 | 2.833 |
| 4.09434 | 2.833 |
| 4.09434 | 2.833 |
| 4.09434 | 2.833 |
| 4.09434 | 2.833 |
| 4.09434 | 2.833 |
| 4.09434 | 2.833 |
| 4.07754 | 2.89 |
| 4.07754 | 2.89 |
| 4.07754 | 2.89 |
| 4.07754 | 2.89 |
| 4.07754 | 2.89 |
| 4.07754 | 2.89 |
| 4.07754 | 2.89 |
| 4.07754 | 2.89 |
| 4.07754 | 2.89 |
| 4.07754 | 2.89 |
| 4.07754 | 2.89 |
| 4.07754 | 2.89 |
| 4.07754 | 2.89 |
| 4.07754 | 2.89 |
| 4.07754 | 2.89 |
| 4.07754 | 2.89 |
| 4.07754 | 2.89 |
| 4.07754 | 2.89 |
| 4.06044 | 3.045 |
| 4.06044 | 3.045 |
| 4.06044 | 3.045 |
| 4.06044 | 3.045 |
| 4.06044 | 3.045 |
| 4.06044 | 3.045 |
| 4.06044 | 3.045 |
| 4.06044 | 3.045 |
| 4.06044 | 3.045 |
| 4.06044 | 3.045 |
| 4.06044 | 3.045 |
| 4.06044 | 3.045 |
| 4.06044 | 3.045 |
| 4.06044 | 3.045 |
| 4.06044 | 3.045 |
| 4.06044 | 3.045 |
| 4.06044 | 3.045 |
| 4.06044 | 3.045 |
| 4.06044 | 3.045 |
| 4.06044 | 3.045 |
| 4.06044 | 3.045 |
| 4.04305 | 3.091 |
| 4.04305 | 3.091 |
| 4.04305 | 3.091 |
| 4.04305 | 3.091 |
| 4.04305 | 3.091 |
| 4.04305 | 3.091 |
| 4.04305 | 3.091 |
| 4.04305 | 3.091 |
| 4.04305 | 3.091 |
| 4.04305 | 3.091 |
| 4.04305 | 3.091 |
| 4.04305 | 3.091 |
| 4.04305 | 3.091 |
| 4.04305 | 3.091 |
| 4.04305 | 3.091 |
| 4.04305 | 3.091 |
| 4.04305 | 3.091 |
| 4.04305 | 3.091 |
| 4.04305 | 3.091 |
| 4.04305 | 3.091 |
| 4.04305 | 3.091 |
| 4.04305 | 3.091 |
| 4.02535 | 3.091 |
| 4.02535 | 3.091 |
| 4.02535 | 3.091 |
| 4.02535 | 3.091 |
| 4.02535 | 3.091 |
| 4.02535 | 3.091 |
| 4.02535 | 3.091 |
| 4.02535 | 3.091 |
| 4.02535 | 3.091 |
| 4.02535 | 3.091 |
| 4.02535 | 3.091 |
| 4.02535 | 3.091 |
| 4.02535 | 3.091 |
| 4.02535 | 3.091 |
| 4.02535 | 3.091 |
| 4.02535 | 3.091 |
| 4.02535 | 3.091 |
| 4.02535 | 3.091 |
| 4.02535 | 3.091 |
| 4.02535 | 3.091 |
| 4.02535 | 3.091 |
| 4.02535 | 3.091 |
| 4.00733 | 2.833 |
| 4.00733 | 2.833 |
| 4.00733 | 2.833 |
| 4.00733 | 2.833 |
| 4.00733 | 2.833 |
| 4.00733 | 2.833 |
| 4.00733 | 2.833 |
| 4.00733 | 2.833 |
| 4.00733 | 2.833 |
| 4.00733 | 2.833 |
| 4.00733 | 2.833 |
| 4.00733 | 2.833 |
| 4.00733 | 2.833 |
| 4.00733 | 2.833 |
| 4.00733 | 2.833 |
| 4.00733 | 2.833 |
| 4.00733 | 2.833 |
| 3.98898 | 2.996 |
| 3.98898 | 2.996 |
| 3.98898 | 2.996 |
| 3.98898 | 2.996 |
| 3.98898 | 2.996 |
| 3.98898 | 2.996 |
| 3.98898 | 2.996 |
| 3.98898 | 2.996 |
| 3.98898 | 2.996 |
| 3.98898 | 2.996 |
| 3.98898 | 2.996 |
| 3.98898 | 2.996 |
| 3.98898 | 2.996 |
| 3.98898 | 2.996 |
| 3.98898 | 2.996 |
| 3.97029 | 3.258 |
| 3.97029 | 3.258 |
| 3.97029 | 3.258 |
| 3.97029 | 3.258 |
| 3.97029 | 3.258 |
| 3.97029 | 3.258 |
| 3.97029 | 3.258 |
| 3.97029 | 3.258 |
| 3.97029 | 3.258 |
| 3.97029 | 3.258 |
| 3.97029 | 3.258 |
| 3.97029 | 3.258 |
| 3.97029 | 3.258 |
| 3.97029 | 3.258 |
| 3.97029 | 3.258 |
| 3.97029 | 3.258 |
| 3.97029 | 3.258 |
| 3.97029 | 3.258 |
| 3.97029 | 3.258 |
| 3.97029 | 3.258 |
| 3.97029 | 3.258 |
| 3.97029 | 3.258 |
| 3.97029 | 3.258 |
| 3.97029 | 3.258 |
| 3.97029 | 3.258 |
| 3.97029 | 3.258 |
| 3.95124 | 2.398 |
| 3.95124 | 2.398 |
| 3.95124 | 2.398 |
| 3.95124 | 2.398 |
| 3.95124 | 2.398 |
| 3.95124 | 2.398 |
| 3.95124 | 2.398 |
| 3.95124 | 2.398 |
| 3.95124 | 2.398 |
| 3.95124 | 2.398 |
| 3.95124 | 2.398 |
| 3.93183 | 2.639 |
| 3.93183 | 2.639 |
| 3.93183 | 2.639 |
| 3.93183 | 2.639 |
| 3.93183 | 2.639 |
| 3.93183 | 2.639 |
| 3.93183 | 2.639 |
| 3.93183 | 2.639 |
| 3.93183 | 2.639 |
| 3.93183 | 2.639 |
| 3.93183 | 2.639 |
| 3.93183 | 2.639 |
| 3.93183 | 2.639 |
| 3.93183 | 2.639 |
| 3.91202 | 3.045 |
| 3.91202 | 3.045 |
| 3.91202 | 3.045 |
| 3.91202 | 3.045 |
| 3.91202 | 3.045 |
| 3.91202 | 3.045 |
| 3.91202 | 3.045 |
| 3.91202 | 3.045 |
| 3.91202 | 3.045 |
| 3.91202 | 3.045 |
| 3.91202 | 3.045 |
| 3.91202 | 3.045 |
| 3.91202 | 3.045 |
| 3.91202 | 3.045 |
| 3.91202 | 3.045 |
| 3.91202 | 3.045 |
| 3.91202 | 3.045 |
| 3.91202 | 3.045 |
| 3.91202 | 3.045 |
| 3.91202 | 3.045 |
| 3.91202 | 3.045 |
| 3.89182 | 2.996 |
| 3.89182 | 2.996 |
| 3.89182 | 2.996 |
| 3.89182 | 2.996 |
| 3.89182 | 2.996 |
| 3.89182 | 2.996 |
| 3.89182 | 2.996 |
| 3.89182 | 2.996 |
| 3.89182 | 2.996 |
| 3.89182 | 2.996 |
| 3.89182 | 2.996 |
| 3.89182 | 2.996 |
| 3.89182 | 2.996 |
| 3.89182 | 2.996 |
| 3.89182 | 2.996 |
| 3.89182 | 2.996 |
| 3.89182 | 2.996 |
| 3.89182 | 2.996 |
| 3.89182 | 2.996 |
| 3.89182 | 2.996 |
| 3.8712 | 2.773 |
| 3.8712 | 2.773 |
| 3.8712 | 2.773 |
| 3.8712 | 2.773 |
| 3.8712 | 2.773 |
| 3.8712 | 2.773 |
| 3.8712 | 2.773 |
| 3.8712 | 2.773 |
| 3.8712 | 2.773 |
| 3.8712 | 2.773 |
| 3.8712 | 2.773 |
| 3.8712 | 2.773 |
| 3.8712 | 2.773 |
| 3.8712 | 2.773 |
| 3.8712 | 2.773 |
| 3.8712 | 2.773 |
| 3.85015 | 2.773 |
| 3.85015 | 2.773 |
| 3.85015 | 2.773 |
| 3.85015 | 2.773 |
| 3.85015 | 2.773 |
| 3.85015 | 2.773 |
| 3.85015 | 2.773 |
| 3.85015 | 2.773 |
| 3.85015 | 2.773 |
| 3.85015 | 2.773 |
| 3.85015 | 2.773 |
| 3.85015 | 2.773 |
| 3.85015 | 2.773 |
| 3.85015 | 2.773 |
| 3.85015 | 2.773 |
| 3.85015 | 2.773 |
| 3.82864 | 2.89 |
| 3.82864 | 2.89 |
| 3.82864 | 2.89 |
| 3.82864 | 2.89 |
| 3.82864 | 2.89 |
| 3.82864 | 2.89 |
| 3.82864 | 2.89 |
| 3.82864 | 2.89 |
| 3.82864 | 2.89 |
| 3.82864 | 2.89 |
| 3.82864 | 2.89 |
| 3.82864 | 2.89 |
| 3.82864 | 2.89 |
| 3.82864 | 2.89 |
| 3.82864 | 2.89 |
| 3.82864 | 2.89 |
| 3.82864 | 2.89 |
| 3.82864 | 2.89 |
| 3.80666 | 3.219 |
| 3.80666 | 3.219 |
| 3.80666 | 3.219 |
| 3.80666 | 3.219 |
| 3.80666 | 3.219 |
| 3.80666 | 3.219 |
| 3.80666 | 3.219 |
| 3.80666 | 3.219 |
| 3.80666 | 3.219 |
| 3.80666 | 3.219 |
| 3.80666 | 3.219 |
| 3.80666 | 3.219 |
| 3.80666 | 3.219 |
| 3.80666 | 3.219 |
| 3.80666 | 3.219 |
| 3.80666 | 3.219 |
| 3.80666 | 3.219 |
| 3.80666 | 3.219 |
| 3.80666 | 3.219 |
| 3.80666 | 3.219 |
| 3.80666 | 3.219 |
| 3.80666 | 3.219 |
| 3.80666 | 3.219 |
| 3.80666 | 3.219 |
| 3.80666 | 3.219 |
| 3.78419 | 0 |
| 3.78419 | 0 |
| 3.78419 | 0 |
| 3.78419 | 0 |
| 3.78419 | 0 |
| 3.78419 | 0 |
| 3.78419 | 0 |
| 3.78419 | 0 |
| 3.78419 | 0 |
| 3.78419 | 0 |
| 3.78419 | 0 |
| 3.78419 | 0 |
| 3.78419 | 0 |
| 3.78419 | 0 |
| 3.78419 | 0 |
| 3.78419 | 0 |
| 3.78419 | 0 |
| 3.78419 | 0 |
| 3.78419 | 0 |
| 3.78419 | 0 |
| 3.7612 | 3.367 |
| 3.7612 | 3.367 |
| 3.7612 | 3.367 |
| 3.7612 | 3.367 |
| 3.7612 | 3.367 |
| 3.7612 | 3.367 |
| 3.7612 | 3.367 |
| 3.7612 | 3.367 |
| 3.7612 | 3.367 |
| 3.7612 | 3.367 |
| 3.7612 | 3.367 |
| 3.7612 | 3.367 |
| 3.7612 | 3.367 |
| 3.7612 | 3.367 |
| 3.7612 | 3.367 |
| 3.7612 | 3.367 |
| 3.7612 | 3.367 |
| 3.7612 | 3.367 |
| 3.7612 | 3.367 |
| 3.7612 | 3.367 |
| 3.7612 | 3.367 |
| 3.7612 | 3.367 |
| 3.7612 | 3.367 |
| 3.7612 | 3.367 |
| 3.7612 | 3.367 |
| 3.7612 | 3.367 |
| 3.7612 | 3.367 |
| 3.7612 | 3.367 |
| 3.7612 | 3.367 |
| 3.73767 | 3.219 |
| 3.73767 | 3.219 |
| 3.73767 | 3.219 |
| 3.73767 | 3.219 |
| 3.73767 | 3.219 |
| 3.73767 | 3.219 |
| 3.73767 | 3.219 |
| 3.73767 | 3.219 |
| 3.73767 | 3.219 |
| 3.73767 | 3.219 |
| 3.73767 | 3.219 |
| 3.73767 | 3.219 |
| 3.73767 | 3.219 |
| 3.73767 | 3.219 |
| 3.73767 | 3.219 |
| 3.73767 | 3.219 |
| 3.73767 | 3.219 |
| 3.73767 | 3.219 |
| 3.73767 | 3.219 |
| 3.73767 | 3.219 |
| 3.73767 | 3.219 |
| 3.73767 | 3.219 |
| 3.73767 | 3.219 |
| 3.73767 | 3.219 |
| 3.73767 | 3.219 |
| 3.71357 | 3.091 |
| 3.71357 | 3.091 |
| 3.71357 | 3.091 |
| 3.71357 | 3.091 |
| 3.71357 | 3.091 |
| 3.71357 | 3.091 |
| 3.71357 | 3.091 |
| 3.71357 | 3.091 |
| 3.71357 | 3.091 |
| 3.71357 | 3.091 |
| 3.71357 | 3.091 |
| 3.71357 | 3.091 |
| 3.71357 | 3.091 |
| 3.71357 | 3.091 |
| 3.71357 | 3.091 |
| 3.71357 | 3.091 |
| 3.71357 | 3.091 |
| 3.71357 | 3.091 |
| 3.71357 | 3.091 |
| 3.71357 | 3.091 |
| 3.71357 | 3.091 |
| 3.71357 | 3.091 |
| 3.68888 | 3.332 |
| 3.68888 | 3.332 |
| 3.68888 | 3.332 |
| 3.68888 | 3.332 |
| 3.68888 | 3.332 |
| 3.68888 | 3.332 |
| 3.68888 | 3.332 |
| 3.68888 | 3.332 |
| 3.68888 | 3.332 |
| 3.68888 | 3.332 |
| 3.68888 | 3.332 |
| 3.68888 | 3.332 |
| 3.68888 | 3.332 |
| 3.68888 | 3.332 |
| 3.68888 | 3.332 |
| 3.68888 | 3.332 |
| 3.68888 | 3.332 |
| 3.68888 | 3.332 |
| 3.68888 | 3.332 |
| 3.68888 | 3.332 |
| 3.68888 | 3.332 |
| 3.68888 | 3.332 |
| 3.68888 | 3.332 |
| 3.68888 | 3.332 |
| 3.68888 | 3.332 |
| 3.68888 | 3.332 |
| 3.68888 | 3.332 |
| 3.68888 | 3.332 |
| 3.66356 | 3.497 |
| 3.66356 | 3.497 |
| 3.66356 | 3.497 |
| 3.66356 | 3.497 |
| 3.66356 | 3.497 |
| 3.66356 | 3.497 |
| 3.66356 | 3.497 |
| 3.66356 | 3.497 |
| 3.66356 | 3.497 |
| 3.66356 | 3.497 |
| 3.66356 | 3.497 |
| 3.66356 | 3.497 |
| 3.66356 | 3.497 |
| 3.66356 | 3.497 |
| 3.66356 | 3.497 |
| 3.66356 | 3.497 |
| 3.66356 | 3.497 |
| 3.66356 | 3.497 |
| 3.66356 | 3.497 |
| 3.66356 | 3.497 |
| 3.66356 | 3.497 |
| 3.66356 | 3.497 |
| 3.66356 | 3.497 |
| 3.66356 | 3.497 |
| 3.66356 | 3.497 |
| 3.66356 | 3.497 |
| 3.66356 | 3.497 |
| 3.66356 | 3.497 |
| 3.66356 | 3.497 |
| 3.66356 | 3.497 |
| 3.66356 | 3.497 |
| 3.66356 | 3.497 |
| 3.66356 | 3.497 |
| 3.63759 | 3.367 |
| 3.63759 | 3.367 |
| 3.63759 | 3.367 |
| 3.63759 | 3.367 |
| 3.63759 | 3.367 |
| 3.63759 | 3.367 |
| 3.63759 | 3.367 |
| 3.63759 | 3.367 |
| 3.63759 | 3.367 |
| 3.63759 | 3.367 |
| 3.63759 | 3.367 |
| 3.63759 | 3.367 |
| 3.63759 | 3.367 |
| 3.63759 | 3.367 |
| 3.63759 | 3.367 |
| 3.63759 | 3.367 |
| 3.63759 | 3.367 |
| 3.63759 | 3.367 |
| 3.63759 | 3.367 |
| 3.63759 | 3.367 |
| 3.63759 | 3.367 |
| 3.63759 | 3.367 |
| 3.63759 | 3.367 |
| 3.63759 | 3.367 |
| 3.63759 | 3.367 |
| 3.63759 | 3.367 |
| 3.63759 | 3.367 |
| 3.63759 | 3.367 |
| 3.63759 | 3.367 |
| 3.61092 | 3.178 |
| 3.61092 | 3.178 |
| 3.61092 | 3.178 |
| 3.61092 | 3.178 |
| 3.61092 | 3.178 |
| 3.61092 | 3.178 |
| 3.61092 | 3.178 |
| 3.61092 | 3.178 |
| 3.61092 | 3.178 |
| 3.61092 | 3.178 |
| 3.61092 | 3.178 |
| 3.61092 | 3.178 |
| 3.61092 | 3.178 |
| 3.61092 | 3.178 |
| 3.61092 | 3.178 |
| 3.61092 | 3.178 |
| 3.61092 | 3.178 |
| 3.61092 | 3.178 |
| 3.61092 | 3.178 |
| 3.61092 | 3.178 |
| 3.61092 | 3.178 |
| 3.61092 | 3.178 |
| 3.61092 | 3.178 |
| 3.61092 | 3.178 |
| 3.58352 | 3.178 |
| 3.58352 | 3.178 |
| 3.58352 | 3.178 |
| 3.58352 | 3.178 |
| 3.58352 | 3.178 |
| 3.58352 | 3.178 |
| 3.58352 | 3.178 |
| 3.58352 | 3.178 |
| 3.58352 | 3.178 |
| 3.58352 | 3.178 |
| 3.58352 | 3.178 |
| 3.58352 | 3.178 |
| 3.58352 | 3.178 |
| 3.58352 | 3.178 |
| 3.58352 | 3.178 |
| 3.58352 | 3.178 |
| 3.58352 | 3.178 |
| 3.58352 | 3.178 |
| 3.58352 | 3.178 |
| 3.58352 | 3.178 |
| 3.58352 | 3.178 |
| 3.58352 | 3.178 |
| 3.58352 | 3.178 |
| 3.58352 | 3.178 |
| 3.55535 | 3.332 |
| 3.55535 | 3.332 |
| 3.55535 | 3.332 |
| 3.55535 | 3.332 |
| 3.55535 | 3.332 |
| 3.55535 | 3.332 |
| 3.55535 | 3.332 |
| 3.55535 | 3.332 |
| 3.55535 | 3.332 |
| 3.55535 | 3.332 |
| 3.55535 | 3.332 |
| 3.55535 | 3.332 |
| 3.55535 | 3.332 |
| 3.55535 | 3.332 |
| 3.55535 | 3.332 |
| 3.55535 | 3.332 |
| 3.55535 | 3.332 |
| 3.55535 | 3.332 |
| 3.55535 | 3.332 |
| 3.55535 | 3.332 |
| 3.55535 | 3.332 |
| 3.55535 | 3.332 |
| 3.55535 | 3.332 |
| 3.55535 | 3.332 |
| 3.55535 | 3.332 |
| 3.55535 | 3.332 |
| 3.55535 | 3.332 |
| 3.55535 | 3.332 |
| 3.52636 | 3.091 |
| 3.52636 | 3.091 |
| 3.52636 | 3.091 |
| 3.52636 | 3.091 |
| 3.52636 | 3.091 |
| 3.52636 | 3.091 |
| 3.52636 | 3.091 |
| 3.52636 | 3.091 |
| 3.52636 | 3.091 |
| 3.52636 | 3.091 |
| 3.52636 | 3.091 |
| 3.52636 | 3.091 |
| 3.52636 | 3.091 |
| 3.52636 | 3.091 |
| 3.52636 | 3.091 |
| 3.52636 | 3.091 |
| 3.52636 | 3.091 |
| 3.52636 | 3.091 |
| 3.52636 | 3.091 |
| 3.52636 | 3.091 |
| 3.52636 | 3.091 |
| 3.52636 | 3.091 |
| 3.49651 | 2.944 |
| 3.49651 | 2.944 |
| 3.49651 | 2.944 |
| 3.49651 | 2.944 |
| 3.49651 | 2.944 |
| 3.49651 | 2.944 |
| 3.49651 | 2.944 |
| 3.49651 | 2.944 |
| 3.49651 | 2.944 |
| 3.49651 | 2.944 |
| 3.49651 | 2.944 |
| 3.49651 | 2.944 |
| 3.49651 | 2.944 |
| 3.49651 | 2.944 |
| 3.49651 | 2.944 |
| 3.49651 | 2.944 |
| 3.49651 | 2.944 |
| 3.49651 | 2.944 |
| 3.49651 | 2.944 |
| 3.46574 | 3.466 |
| 3.46574 | 3.466 |
| 3.46574 | 3.466 |
| 3.46574 | 3.466 |
| 3.46574 | 3.466 |
| 3.46574 | 3.466 |
| 3.46574 | 3.466 |
| 3.46574 | 3.466 |
| 3.46574 | 3.466 |
| 3.46574 | 3.466 |
| 3.46574 | 3.466 |
| 3.46574 | 3.466 |
| 3.46574 | 3.466 |
| 3.46574 | 3.466 |
| 3.46574 | 3.466 |
| 3.46574 | 3.466 |
| 3.46574 | 3.466 |
| 3.46574 | 3.466 |
| 3.46574 | 3.466 |
| 3.46574 | 3.466 |
| 3.46574 | 3.466 |
| 3.46574 | 3.466 |
| 3.46574 | 3.466 |
| 3.46574 | 3.466 |
| 3.46574 | 3.466 |
| 3.46574 | 3.466 |
| 3.46574 | 3.466 |
| 3.46574 | 3.466 |
| 3.46574 | 3.466 |
| 3.46574 | 3.466 |
| 3.46574 | 3.466 |
| 3.46574 | 3.466 |
| 3.43399 | 3.664 |
| 3.43399 | 3.664 |
| 3.43399 | 3.664 |
| 3.43399 | 3.664 |
| 3.43399 | 3.664 |
| 3.43399 | 3.664 |
| 3.43399 | 3.664 |
| 3.43399 | 3.664 |
| 3.43399 | 3.664 |
| 3.43399 | 3.664 |
| 3.43399 | 3.664 |
| 3.43399 | 3.664 |
| 3.43399 | 3.664 |
| 3.43399 | 3.664 |
| 3.43399 | 3.664 |
| 3.43399 | 3.664 |
| 3.43399 | 3.664 |
| 3.43399 | 3.664 |
| 3.43399 | 3.664 |
| 3.43399 | 3.664 |
| 3.43399 | 3.664 |
| 3.43399 | 3.664 |
| 3.43399 | 3.664 |
| 3.43399 | 3.664 |
| 3.43399 | 3.664 |
| 3.43399 | 3.664 |
| 3.43399 | 3.664 |
| 3.43399 | 3.664 |
| 3.43399 | 3.664 |
| 3.43399 | 3.664 |
| 3.43399 | 3.664 |
| 3.43399 | 3.664 |
| 3.43399 | 3.664 |
| 3.43399 | 3.664 |
| 3.43399 | 3.664 |
| 3.43399 | 3.664 |
| 3.43399 | 3.664 |
| 3.43399 | 3.664 |
| 3.43399 | 3.664 |
| 3.4012 | 3.466 |
| 3.4012 | 3.466 |
| 3.4012 | 3.466 |
| 3.4012 | 3.466 |
| 3.4012 | 3.466 |
| 3.4012 | 3.466 |
| 3.4012 | 3.466 |
| 3.4012 | 3.466 |
| 3.4012 | 3.466 |
| 3.4012 | 3.466 |
| 3.4012 | 3.466 |
| 3.4012 | 3.466 |
| 3.4012 | 3.466 |
| 3.4012 | 3.466 |
| 3.4012 | 3.466 |
| 3.4012 | 3.466 |
| 3.4012 | 3.466 |
| 3.4012 | 3.466 |
| 3.4012 | 3.466 |
| 3.4012 | 3.466 |
| 3.4012 | 3.466 |
| 3.4012 | 3.466 |
| 3.4012 | 3.466 |
| 3.4012 | 3.466 |
| 3.4012 | 3.466 |
| 3.4012 | 3.466 |
| 3.4012 | 3.466 |
| 3.4012 | 3.466 |
| 3.4012 | 3.466 |
| 3.4012 | 3.466 |
| 3.4012 | 3.466 |
| 3.4012 | 3.466 |
| 3.3673 | 3.784 |
| 3.3673 | 3.784 |
| 3.3673 | 3.784 |
| 3.3673 | 3.784 |
| 3.3673 | 3.784 |
| 3.3673 | 3.784 |
| 3.3673 | 3.784 |
| 3.3673 | 3.784 |
| 3.3673 | 3.784 |
| 3.3673 | 3.784 |
| 3.3673 | 3.784 |
| 3.3673 | 3.784 |
| 3.3673 | 3.784 |
| 3.3673 | 3.784 |
| 3.3673 | 3.784 |
| 3.3673 | 3.784 |
| 3.3673 | 3.784 |
| 3.3673 | 3.784 |
| 3.3673 | 3.784 |
| 3.3673 | 3.784 |
| 3.3673 | 3.784 |
| 3.3673 | 3.784 |
| 3.3673 | 3.784 |
| 3.3673 | 3.784 |
| 3.3673 | 3.784 |
| 3.3673 | 3.784 |
| 3.3673 | 3.784 |
| 3.3673 | 3.784 |
| 3.3673 | 3.784 |
| 3.3673 | 3.784 |
| 3.3673 | 3.784 |
| 3.3673 | 3.784 |
| 3.3673 | 3.784 |
| 3.3673 | 3.784 |
| 3.3673 | 3.784 |
| 3.3673 | 3.784 |
| 3.3673 | 3.784 |
| 3.3673 | 3.784 |
| 3.3673 | 3.784 |
| 3.3673 | 3.784 |
| 3.3673 | 3.784 |
| 3.3673 | 3.784 |
| 3.3673 | 3.784 |
| 3.3673 | 3.784 |
| 3.3322 | 3.611 |
| 3.3322 | 3.611 |
| 3.3322 | 3.611 |
| 3.3322 | 3.611 |
| 3.3322 | 3.611 |
| 3.3322 | 3.611 |
| 3.3322 | 3.611 |
| 3.3322 | 3.611 |
| 3.3322 | 3.611 |
| 3.3322 | 3.611 |
| 3.3322 | 3.611 |
| 3.3322 | 3.611 |
| 3.3322 | 3.611 |
| 3.3322 | 3.611 |
| 3.3322 | 3.611 |
| 3.3322 | 3.611 |
| 3.3322 | 3.611 |
| 3.3322 | 3.611 |
| 3.3322 | 3.611 |
| 3.3322 | 3.611 |
| 3.3322 | 3.611 |
| 3.3322 | 3.611 |
| 3.3322 | 3.611 |
| 3.3322 | 3.611 |
| 3.3322 | 3.611 |
| 3.3322 | 3.611 |
| 3.3322 | 3.611 |
| 3.3322 | 3.611 |
| 3.3322 | 3.611 |
| 3.3322 | 3.611 |
| 3.3322 | 3.611 |
| 3.3322 | 3.611 |
| 3.3322 | 3.611 |
| 3.3322 | 3.611 |
| 3.3322 | 3.611 |
| 3.3322 | 3.611 |
| 3.3322 | 3.611 |
| 3.29584 | 3.258 |
| 3.29584 | 3.258 |
| 3.29584 | 3.258 |
| 3.29584 | 3.258 |
| 3.29584 | 3.258 |
| 3.29584 | 3.258 |
| 3.29584 | 3.258 |
| 3.29584 | 3.258 |
| 3.29584 | 3.258 |
| 3.29584 | 3.258 |
| 3.29584 | 3.258 |
| 3.29584 | 3.258 |
| 3.29584 | 3.258 |
| 3.29584 | 3.258 |
| 3.29584 | 3.258 |
| 3.29584 | 3.258 |
| 3.29584 | 3.258 |
| 3.29584 | 3.258 |
| 3.29584 | 3.258 |
| 3.29584 | 3.258 |
| 3.29584 | 3.258 |
| 3.29584 | 3.258 |
| 3.29584 | 3.258 |
| 3.29584 | 3.258 |
| 3.29584 | 3.258 |
| 3.29584 | 3.258 |
| 3.2581 | 3.871 |
| 3.2581 | 3.871 |
| 3.2581 | 3.871 |
| 3.2581 | 3.871 |
| 3.2581 | 3.871 |
| 3.2581 | 3.871 |
| 3.2581 | 3.871 |
| 3.2581 | 3.871 |
| 3.2581 | 3.871 |
| 3.2581 | 3.871 |
| 3.2581 | 3.871 |
| 3.2581 | 3.871 |
| 3.2581 | 3.871 |
| 3.2581 | 3.871 |
| 3.2581 | 3.871 |
| 3.2581 | 3.871 |
| 3.2581 | 3.871 |
| 3.2581 | 3.871 |
| 3.2581 | 3.871 |
| 3.2581 | 3.871 |
| 3.2581 | 3.871 |
| 3.2581 | 3.871 |
| 3.2581 | 3.871 |
| 3.2581 | 3.871 |
| 3.2581 | 3.871 |
| 3.2581 | 3.871 |
| 3.2581 | 3.871 |
| 3.2581 | 3.871 |
| 3.2581 | 3.871 |
| 3.2581 | 3.871 |
| 3.2581 | 3.871 |
| 3.2581 | 3.871 |
| 3.2581 | 3.871 |
| 3.2581 | 3.871 |
| 3.2581 | 3.871 |
| 3.2581 | 3.871 |
| 3.2581 | 3.871 |
| 3.2581 | 3.871 |
| 3.2581 | 3.871 |
| 3.2581 | 3.871 |
| 3.2581 | 3.871 |
| 3.2581 | 3.871 |
| 3.2581 | 3.871 |
| 3.2581 | 3.871 |
| 3.2581 | 3.871 |
| 3.2581 | 3.871 |
| 3.2581 | 3.871 |
| 3.2581 | 3.871 |
| 3.21888 | 3.638 |
| 3.21888 | 3.638 |
| 3.21888 | 3.638 |
| 3.21888 | 3.638 |
| 3.21888 | 3.638 |
| 3.21888 | 3.638 |
| 3.21888 | 3.638 |
| 3.21888 | 3.638 |
| 3.21888 | 3.638 |
| 3.21888 | 3.638 |
| 3.21888 | 3.638 |
| 3.21888 | 3.638 |
| 3.21888 | 3.638 |
| 3.21888 | 3.638 |
| 3.21888 | 3.638 |
| 3.21888 | 3.638 |
| 3.21888 | 3.638 |
| 3.21888 | 3.638 |
| 3.21888 | 3.638 |
| 3.21888 | 3.638 |
| 3.21888 | 3.638 |
| 3.21888 | 3.638 |
| 3.21888 | 3.638 |
| 3.21888 | 3.638 |
| 3.21888 | 3.638 |
| 3.21888 | 3.638 |
| 3.21888 | 3.638 |
| 3.21888 | 3.638 |
| 3.21888 | 3.638 |
| 3.21888 | 3.638 |
| 3.21888 | 3.638 |
| 3.21888 | 3.638 |
| 3.21888 | 3.638 |
| 3.21888 | 3.638 |
| 3.21888 | 3.638 |
| 3.21888 | 3.638 |
| 3.21888 | 3.638 |
| 3.21888 | 3.638 |
| 3.17805 | 3.912 |
| 3.17805 | 3.912 |
| 3.17805 | 3.912 |
| 3.17805 | 3.912 |
| 3.17805 | 3.912 |
| 3.17805 | 3.912 |
| 3.17805 | 3.912 |
| 3.17805 | 3.912 |
| 3.17805 | 3.912 |
| 3.17805 | 3.912 |
| 3.17805 | 3.912 |
| 3.17805 | 3.912 |
| 3.17805 | 3.912 |
| 3.17805 | 3.912 |
| 3.17805 | 3.912 |
| 3.17805 | 3.912 |
| 3.17805 | 3.912 |
| 3.17805 | 3.912 |
| 3.17805 | 3.912 |
| 3.17805 | 3.912 |
| 3.17805 | 3.912 |
| 3.17805 | 3.912 |
| 3.17805 | 3.912 |
| 3.17805 | 3.912 |
| 3.17805 | 3.912 |
| 3.17805 | 3.912 |
| 3.17805 | 3.912 |
| 3.17805 | 3.912 |
| 3.17805 | 3.912 |
| 3.17805 | 3.912 |
| 3.17805 | 3.912 |
| 3.17805 | 3.912 |
| 3.17805 | 3.912 |
| 3.17805 | 3.912 |
| 3.17805 | 3.912 |
| 3.17805 | 3.912 |
| 3.17805 | 3.912 |
| 3.17805 | 3.912 |
| 3.17805 | 3.912 |
| 3.17805 | 3.912 |
| 3.17805 | 3.912 |
| 3.17805 | 3.912 |
| 3.17805 | 3.912 |
| 3.17805 | 3.912 |
| 3.17805 | 3.912 |
| 3.17805 | 3.912 |
| 3.17805 | 3.912 |
| 3.17805 | 3.912 |
| 3.17805 | 3.912 |
| 3.17805 | 3.912 |
| 3.13549 | 3.611 |
| 3.13549 | 3.611 |
| 3.13549 | 3.611 |
| 3.13549 | 3.611 |
| 3.13549 | 3.611 |
| 3.13549 | 3.611 |
| 3.13549 | 3.611 |
| 3.13549 | 3.611 |
| 3.13549 | 3.611 |
| 3.13549 | 3.611 |
| 3.13549 | 3.611 |
| 3.13549 | 3.611 |
| 3.13549 | 3.611 |
| 3.13549 | 3.611 |
| 3.13549 | 3.611 |
| 3.13549 | 3.611 |
| 3.13549 | 3.611 |
| 3.13549 | 3.611 |
| 3.13549 | 3.611 |
| 3.13549 | 3.611 |
| 3.13549 | 3.611 |
| 3.13549 | 3.611 |
| 3.13549 | 3.611 |
| 3.13549 | 3.611 |
| 3.13549 | 3.611 |
| 3.13549 | 3.611 |
| 3.13549 | 3.611 |
| 3.13549 | 3.611 |
| 3.13549 | 3.611 |
| 3.13549 | 3.611 |
| 3.13549 | 3.611 |
| 3.13549 | 3.611 |
| 3.13549 | 3.611 |
| 3.13549 | 3.611 |
| 3.13549 | 3.611 |
| 3.13549 | 3.611 |
| 3.13549 | 3.611 |
| 3.09104 | 4.007 |
| 3.09104 | 4.007 |
| 3.09104 | 4.007 |
| 3.09104 | 4.007 |
| 3.09104 | 4.007 |
| 3.09104 | 4.007 |
| 3.09104 | 4.007 |
| 3.09104 | 4.007 |
| 3.09104 | 4.007 |
| 3.09104 | 4.007 |
| 3.09104 | 4.007 |
| 3.09104 | 4.007 |
| 3.09104 | 4.007 |
| 3.09104 | 4.007 |
| 3.09104 | 4.007 |
| 3.09104 | 4.007 |
| 3.09104 | 4.007 |
| 3.09104 | 4.007 |
| 3.09104 | 4.007 |
| 3.09104 | 4.007 |
| 3.09104 | 4.007 |
| 3.09104 | 4.007 |
| 3.09104 | 4.007 |
| 3.09104 | 4.007 |
| 3.09104 | 4.007 |
| 3.09104 | 4.007 |
| 3.09104 | 4.007 |
| 3.09104 | 4.007 |
| 3.09104 | 4.007 |
| 3.09104 | 4.007 |
| 3.09104 | 4.007 |
| 3.09104 | 4.007 |
| 3.09104 | 4.007 |
| 3.09104 | 4.007 |
| 3.09104 | 4.007 |
| 3.09104 | 4.007 |
| 3.09104 | 4.007 |
| 3.09104 | 4.007 |
| 3.09104 | 4.007 |
| 3.09104 | 4.007 |
| 3.09104 | 4.007 |
| 3.09104 | 4.007 |
| 3.09104 | 4.007 |
| 3.09104 | 4.007 |
| 3.09104 | 4.007 |
| 3.09104 | 4.007 |
| 3.09104 | 4.007 |
| 3.09104 | 4.007 |
| 3.09104 | 4.007 |
| 3.09104 | 4.007 |
| 3.09104 | 4.007 |
| 3.09104 | 4.007 |
| 3.09104 | 4.007 |
| 3.09104 | 4.007 |
| 3.09104 | 4.007 |
| 3.04452 | 3.784 |
| 3.04452 | 3.784 |
| 3.04452 | 3.784 |
| 3.04452 | 3.784 |
| 3.04452 | 3.784 |
| 3.04452 | 3.784 |
| 3.04452 | 3.784 |
| 3.04452 | 3.784 |
| 3.04452 | 3.784 |
| 3.04452 | 3.784 |
| 3.04452 | 3.784 |
| 3.04452 | 3.784 |
| 3.04452 | 3.784 |
| 3.04452 | 3.784 |
| 3.04452 | 3.784 |
| 3.04452 | 3.784 |
| 3.04452 | 3.784 |
| 3.04452 | 3.784 |
| 3.04452 | 3.784 |
| 3.04452 | 3.784 |
| 3.04452 | 3.784 |
| 3.04452 | 3.784 |
| 3.04452 | 3.784 |
| 3.04452 | 3.784 |
| 3.04452 | 3.784 |
| 3.04452 | 3.784 |
| 3.04452 | 3.784 |
| 3.04452 | 3.784 |
| 3.04452 | 3.784 |
| 3.04452 | 3.784 |
| 3.04452 | 3.784 |
| 3.04452 | 3.784 |
| 3.04452 | 3.784 |
| 3.04452 | 3.784 |
| 3.04452 | 3.784 |
| 3.04452 | 3.784 |
| 3.04452 | 3.784 |
| 3.04452 | 3.784 |
| 3.04452 | 3.784 |
| 3.04452 | 3.784 |
| 3.04452 | 3.784 |
| 3.04452 | 3.784 |
| 3.04452 | 3.784 |
| 3.04452 | 3.784 |
| 2.99573 | 4.143 |
| 2.99573 | 4.143 |
| 2.99573 | 4.143 |
| 2.99573 | 4.143 |
| 2.99573 | 4.143 |
| 2.99573 | 4.143 |
| 2.99573 | 4.143 |
| 2.99573 | 4.143 |
| 2.99573 | 4.143 |
| 2.99573 | 4.143 |
| 2.99573 | 4.143 |
| 2.99573 | 4.143 |
| 2.99573 | 4.143 |
| 2.99573 | 4.143 |
| 2.99573 | 4.143 |
| 2.99573 | 4.143 |
| 2.99573 | 4.143 |
| 2.99573 | 4.143 |
| 2.99573 | 4.143 |
| 2.99573 | 4.143 |
| 2.99573 | 4.143 |
| 2.99573 | 4.143 |
| 2.99573 | 4.143 |
| 2.99573 | 4.143 |
| 2.99573 | 4.143 |
| 2.99573 | 4.143 |
| 2.99573 | 4.143 |
| 2.99573 | 4.143 |
| 2.99573 | 4.143 |
| 2.99573 | 4.143 |
| 2.99573 | 4.143 |
| 2.99573 | 4.143 |
| 2.99573 | 4.143 |
| 2.99573 | 4.143 |
| 2.99573 | 4.143 |
| 2.99573 | 4.143 |
| 2.99573 | 4.143 |
| 2.99573 | 4.143 |
| 2.99573 | 4.143 |
| 2.99573 | 4.143 |
| 2.99573 | 4.143 |
| 2.99573 | 4.143 |
| 2.99573 | 4.143 |
| 2.99573 | 4.143 |
| 2.99573 | 4.143 |
| 2.99573 | 4.143 |
| 2.99573 | 4.143 |
| 2.99573 | 4.143 |
| 2.99573 | 4.143 |
| 2.99573 | 4.143 |
| 2.99573 | 4.143 |
| 2.99573 | 4.143 |
| 2.99573 | 4.143 |
| 2.99573 | 4.143 |
| 2.99573 | 4.143 |
| 2.99573 | 4.143 |
| 2.99573 | 4.143 |
| 2.99573 | 4.143 |
| 2.99573 | 4.143 |
| 2.99573 | 4.143 |
| 2.94444 | 4.143 |
| 2.94444 | 4.143 |
| 2.94444 | 4.143 |
| 2.94444 | 4.143 |
| 2.94444 | 4.143 |
| 2.94444 | 4.143 |
| 2.94444 | 4.143 |
| 2.94444 | 4.143 |
| 2.94444 | 4.143 |
| 2.94444 | 4.143 |
| 2.94444 | 4.143 |
| 2.94444 | 4.143 |
| 2.94444 | 4.143 |
| 2.94444 | 4.143 |
| 2.94444 | 4.143 |
| 2.94444 | 4.143 |
| 2.94444 | 4.143 |
| 2.94444 | 4.143 |
| 2.94444 | 4.143 |
| 2.94444 | 4.143 |
| 2.94444 | 4.143 |
| 2.94444 | 4.143 |
| 2.94444 | 4.143 |
| 2.94444 | 4.143 |
| 2.94444 | 4.143 |
| 2.94444 | 4.143 |
| 2.94444 | 4.143 |
| 2.94444 | 4.143 |
| 2.94444 | 4.143 |
| 2.94444 | 4.143 |
| 2.94444 | 4.143 |
| 2.94444 | 4.143 |
| 2.94444 | 4.143 |
| 2.94444 | 4.143 |
| 2.94444 | 4.143 |
| 2.94444 | 4.143 |
| 2.94444 | 4.143 |
| 2.94444 | 4.143 |
| 2.94444 | 4.143 |
| 2.94444 | 4.143 |
| 2.94444 | 4.143 |
| 2.94444 | 4.143 |
| 2.94444 | 4.143 |
| 2.94444 | 4.143 |
| 2.94444 | 4.143 |
| 2.94444 | 4.143 |
| 2.94444 | 4.143 |
| 2.94444 | 4.143 |
| 2.94444 | 4.143 |
| 2.94444 | 4.143 |
| 2.94444 | 4.143 |
| 2.94444 | 4.143 |
| 2.94444 | 4.143 |
| 2.94444 | 4.143 |
| 2.94444 | 4.143 |
| 2.94444 | 4.143 |
| 2.94444 | 4.143 |
| 2.94444 | 4.143 |
| 2.94444 | 4.143 |
| 2.94444 | 4.143 |
| 2.94444 | 4.143 |
| 2.94444 | 4.143 |
| 2.94444 | 4.143 |
| 2.89037 | 4.205 |
| 2.89037 | 4.205 |
| 2.89037 | 4.205 |
| 2.89037 | 4.205 |
| 2.89037 | 4.205 |
| 2.89037 | 4.205 |
| 2.89037 | 4.205 |
| 2.89037 | 4.205 |
| 2.89037 | 4.205 |
| 2.89037 | 4.205 |
| 2.89037 | 4.205 |
| 2.89037 | 4.205 |
| 2.89037 | 4.205 |
| 2.89037 | 4.205 |
| 2.89037 | 4.205 |
| 2.89037 | 4.205 |
| 2.89037 | 4.205 |
| 2.89037 | 4.205 |
| 2.89037 | 4.205 |
| 2.89037 | 4.205 |
| 2.89037 | 4.205 |
| 2.89037 | 4.205 |
| 2.89037 | 4.205 |
| 2.89037 | 4.205 |
| 2.89037 | 4.205 |
| 2.89037 | 4.205 |
| 2.89037 | 4.205 |
| 2.89037 | 4.205 |
| 2.89037 | 4.205 |
| 2.89037 | 4.205 |
| 2.89037 | 4.205 |
| 2.89037 | 4.205 |
| 2.89037 | 4.205 |
| 2.89037 | 4.205 |
| 2.89037 | 4.205 |
| 2.89037 | 4.205 |
| 2.89037 | 4.205 |
| 2.89037 | 4.205 |
| 2.89037 | 4.205 |
| 2.89037 | 4.205 |
| 2.89037 | 4.205 |
| 2.89037 | 4.205 |
| 2.89037 | 4.205 |
| 2.89037 | 4.205 |
| 2.89037 | 4.205 |
| 2.89037 | 4.205 |
| 2.89037 | 4.205 |
| 2.89037 | 4.205 |
| 2.89037 | 4.205 |
| 2.89037 | 4.205 |
| 2.89037 | 4.205 |
| 2.89037 | 4.205 |
| 2.89037 | 4.205 |
| 2.89037 | 4.205 |
| 2.89037 | 4.205 |
| 2.89037 | 4.205 |
| 2.89037 | 4.205 |
| 2.89037 | 4.205 |
| 2.89037 | 4.205 |
| 2.89037 | 4.205 |
| 2.89037 | 4.205 |
| 2.89037 | 4.205 |
| 2.89037 | 4.205 |
| 2.89037 | 4.205 |
| 2.89037 | 4.205 |
| 2.89037 | 4.205 |
| 2.89037 | 4.205 |
| 2.83321 | 4.263 |
| 2.83321 | 4.263 |
| 2.83321 | 4.263 |
| 2.83321 | 4.263 |
| 2.83321 | 4.263 |
| 2.83321 | 4.263 |
| 2.83321 | 4.263 |
| 2.83321 | 4.263 |
| 2.83321 | 4.263 |
| 2.83321 | 4.263 |
| 2.83321 | 4.263 |
| 2.83321 | 4.263 |
| 2.83321 | 4.263 |
| 2.83321 | 4.263 |
| 2.83321 | 4.263 |
| 2.83321 | 4.263 |
| 2.83321 | 4.263 |
| 2.83321 | 4.263 |
| 2.83321 | 4.263 |
| 2.83321 | 4.263 |
| 2.83321 | 4.263 |
| 2.83321 | 4.263 |
| 2.83321 | 4.263 |
| 2.83321 | 4.263 |
| 2.83321 | 4.263 |
| 2.83321 | 4.263 |
| 2.83321 | 4.263 |
| 2.83321 | 4.263 |
| 2.83321 | 4.263 |
| 2.83321 | 4.263 |
| 2.83321 | 4.263 |
| 2.83321 | 4.263 |
| 2.83321 | 4.263 |
| 2.83321 | 4.263 |
| 2.83321 | 4.263 |
| 2.83321 | 4.263 |
| 2.83321 | 4.263 |
| 2.83321 | 4.263 |
| 2.83321 | 4.263 |
| 2.83321 | 4.263 |
| 2.83321 | 4.263 |
| 2.83321 | 4.263 |
| 2.83321 | 4.263 |
| 2.83321 | 4.263 |
| 2.83321 | 4.263 |
| 2.83321 | 4.263 |
| 2.83321 | 4.263 |
| 2.83321 | 4.263 |
| 2.83321 | 4.263 |
| 2.83321 | 4.263 |
| 2.83321 | 4.263 |
| 2.83321 | 4.263 |
| 2.83321 | 4.263 |
| 2.83321 | 4.263 |
| 2.83321 | 4.263 |
| 2.83321 | 4.263 |
| 2.83321 | 4.263 |
| 2.83321 | 4.263 |
| 2.83321 | 4.263 |
| 2.83321 | 4.263 |
| 2.83321 | 4.263 |
| 2.83321 | 4.263 |
| 2.83321 | 4.263 |
| 2.83321 | 4.263 |
| 2.83321 | 4.263 |
| 2.83321 | 4.263 |
| 2.83321 | 4.263 |
| 2.83321 | 4.263 |
| 2.83321 | 4.263 |
| 2.83321 | 4.263 |
| 2.83321 | 4.263 |
| 2.77259 | 4.19 |
| 2.77259 | 4.19 |
| 2.77259 | 4.19 |
| 2.77259 | 4.19 |
| 2.77259 | 4.19 |
| 2.77259 | 4.19 |
| 2.77259 | 4.19 |
| 2.77259 | 4.19 |
| 2.77259 | 4.19 |
| 2.77259 | 4.19 |
| 2.77259 | 4.19 |
| 2.77259 | 4.19 |
| 2.77259 | 4.19 |
| 2.77259 | 4.19 |
| 2.77259 | 4.19 |
| 2.77259 | 4.19 |
| 2.77259 | 4.19 |
| 2.77259 | 4.19 |
| 2.77259 | 4.19 |
| 2.77259 | 4.19 |
| 2.77259 | 4.19 |
| 2.77259 | 4.19 |
| 2.77259 | 4.19 |
| 2.77259 | 4.19 |
| 2.77259 | 4.19 |
| 2.77259 | 4.19 |
| 2.77259 | 4.19 |
| 2.77259 | 4.19 |
| 2.77259 | 4.19 |
| 2.77259 | 4.19 |
| 2.77259 | 4.19 |
| 2.77259 | 4.19 |
| 2.77259 | 4.19 |
| 2.77259 | 4.19 |
| 2.77259 | 4.19 |
| 2.77259 | 4.19 |
| 2.77259 | 4.19 |
| 2.77259 | 4.19 |
| 2.77259 | 4.19 |
| 2.77259 | 4.19 |
| 2.77259 | 4.19 |
| 2.77259 | 4.19 |
| 2.77259 | 4.19 |
| 2.77259 | 4.19 |
| 2.77259 | 4.19 |
| 2.77259 | 4.19 |
| 2.77259 | 4.19 |
| 2.77259 | 4.19 |
| 2.77259 | 4.19 |
| 2.77259 | 4.19 |
| 2.77259 | 4.19 |
| 2.77259 | 4.19 |
| 2.77259 | 4.19 |
| 2.77259 | 4.19 |
| 2.77259 | 4.19 |
| 2.77259 | 4.19 |
| 2.77259 | 4.19 |
| 2.77259 | 4.19 |
| 2.77259 | 4.19 |
| 2.77259 | 4.19 |
| 2.77259 | 4.19 |
| 2.77259 | 4.19 |
| 2.77259 | 4.19 |
| 2.77259 | 4.19 |
| 2.77259 | 4.19 |
| 2.77259 | 4.19 |
| 2.70805 | 4.263 |
| 2.70805 | 4.263 |
| 2.70805 | 4.263 |
| 2.70805 | 4.263 |
| 2.70805 | 4.263 |
| 2.70805 | 4.263 |
| 2.70805 | 4.263 |
| 2.70805 | 4.263 |
| 2.70805 | 4.263 |
| 2.70805 | 4.263 |
| 2.70805 | 4.263 |
| 2.70805 | 4.263 |
| 2.70805 | 4.263 |
| 2.70805 | 4.263 |
| 2.70805 | 4.263 |
| 2.70805 | 4.263 |
| 2.70805 | 4.263 |
| 2.70805 | 4.263 |
| 2.70805 | 4.263 |
| 2.70805 | 4.263 |
| 2.70805 | 4.263 |
| 2.70805 | 4.263 |
| 2.70805 | 4.263 |
| 2.70805 | 4.263 |
| 2.70805 | 4.263 |
| 2.70805 | 4.263 |
| 2.70805 | 4.263 |
| 2.70805 | 4.263 |
| 2.70805 | 4.263 |
| 2.70805 | 4.263 |
| 2.70805 | 4.263 |
| 2.70805 | 4.263 |
| 2.70805 | 4.263 |
| 2.70805 | 4.263 |
| 2.70805 | 4.263 |
| 2.70805 | 4.263 |
| 2.70805 | 4.263 |
| 2.70805 | 4.263 |
| 2.70805 | 4.263 |
| 2.70805 | 4.263 |
| 2.70805 | 4.263 |
| 2.70805 | 4.263 |
| 2.70805 | 4.263 |
| 2.70805 | 4.263 |
| 2.70805 | 4.263 |
| 2.70805 | 4.263 |
| 2.70805 | 4.263 |
| 2.70805 | 4.263 |
| 2.70805 | 4.263 |
| 2.70805 | 4.263 |
| 2.70805 | 4.263 |
| 2.70805 | 4.263 |
| 2.70805 | 4.263 |
| 2.70805 | 4.263 |
| 2.70805 | 4.263 |
| 2.70805 | 4.263 |
| 2.70805 | 4.263 |
| 2.70805 | 4.263 |
| 2.70805 | 4.263 |
| 2.70805 | 4.263 |
| 2.70805 | 4.263 |
| 2.70805 | 4.263 |
| 2.70805 | 4.263 |
| 2.70805 | 4.263 |
| 2.70805 | 4.263 |
| 2.70805 | 4.263 |
| 2.70805 | 4.263 |
| 2.70805 | 4.263 |
| 2.70805 | 4.263 |
| 2.70805 | 4.263 |
| 2.70805 | 4.263 |
| 2.63906 | 4.331 |
| 2.63906 | 4.331 |
| 2.63906 | 4.331 |
| 2.63906 | 4.331 |
| 2.63906 | 4.331 |
| 2.63906 | 4.331 |
| 2.63906 | 4.331 |
| 2.63906 | 4.331 |
| 2.63906 | 4.331 |
| 2.63906 | 4.331 |
| 2.63906 | 4.331 |
| 2.63906 | 4.331 |
| 2.63906 | 4.331 |
| 2.63906 | 4.331 |
| 2.63906 | 4.331 |
| 2.63906 | 4.331 |
| 2.63906 | 4.331 |
| 2.63906 | 4.331 |
| 2.63906 | 4.331 |
| 2.63906 | 4.331 |
| 2.63906 | 4.331 |
| 2.63906 | 4.331 |
| 2.63906 | 4.331 |
| 2.63906 | 4.331 |
| 2.63906 | 4.331 |
| 2.63906 | 4.331 |
| 2.63906 | 4.331 |
| 2.63906 | 4.331 |
| 2.63906 | 4.331 |
| 2.63906 | 4.331 |
| 2.63906 | 4.331 |
| 2.63906 | 4.331 |
| 2.63906 | 4.331 |
| 2.63906 | 4.331 |
| 2.63906 | 4.331 |
| 2.63906 | 4.331 |
| 2.63906 | 4.331 |
| 2.63906 | 4.331 |
| 2.63906 | 4.331 |
| 2.63906 | 4.331 |
| 2.63906 | 4.331 |
| 2.63906 | 4.331 |
| 2.63906 | 4.331 |
| 2.63906 | 4.331 |
| 2.63906 | 4.331 |
| 2.63906 | 4.331 |
| 2.63906 | 4.331 |
| 2.63906 | 4.331 |
| 2.63906 | 4.331 |
| 2.63906 | 4.331 |
| 2.63906 | 4.331 |
| 2.63906 | 4.331 |
| 2.63906 | 4.331 |
| 2.63906 | 4.331 |
| 2.63906 | 4.331 |
| 2.63906 | 4.331 |
| 2.63906 | 4.331 |
| 2.63906 | 4.331 |
| 2.63906 | 4.331 |
| 2.63906 | 4.331 |
| 2.63906 | 4.331 |
| 2.63906 | 4.331 |
| 2.63906 | 4.331 |
| 2.63906 | 4.331 |
| 2.63906 | 4.331 |
| 2.63906 | 4.331 |
| 2.63906 | 4.331 |
| 2.63906 | 4.331 |
| 2.63906 | 4.331 |
| 2.63906 | 4.331 |
| 2.63906 | 4.331 |
| 2.63906 | 4.331 |
| 2.63906 | 4.331 |
| 2.63906 | 4.331 |
| 2.63906 | 4.331 |
| 2.63906 | 4.331 |
| 2.56495 | 4.277 |
| 2.56495 | 4.277 |
| 2.56495 | 4.277 |
| 2.56495 | 4.277 |
| 2.56495 | 4.277 |
| 2.56495 | 4.277 |
| 2.56495 | 4.277 |
| 2.56495 | 4.277 |
| 2.56495 | 4.277 |
| 2.56495 | 4.277 |
| 2.56495 | 4.277 |
| 2.56495 | 4.277 |
| 2.56495 | 4.277 |
| 2.56495 | 4.277 |
| 2.56495 | 4.277 |
| 2.56495 | 4.277 |
| 2.56495 | 4.277 |
| 2.56495 | 4.277 |
| 2.56495 | 4.277 |
| 2.56495 | 4.277 |
| 2.56495 | 4.277 |
| 2.56495 | 4.277 |
| 2.56495 | 4.277 |
| 2.56495 | 4.277 |
| 2.56495 | 4.277 |
| 2.56495 | 4.277 |
| 2.56495 | 4.277 |
| 2.56495 | 4.277 |
| 2.56495 | 4.277 |
| 2.56495 | 4.277 |
| 2.56495 | 4.277 |
| 2.56495 | 4.277 |
| 2.56495 | 4.277 |
| 2.56495 | 4.277 |
| 2.56495 | 4.277 |
| 2.56495 | 4.277 |
| 2.56495 | 4.277 |
| 2.56495 | 4.277 |
| 2.56495 | 4.277 |
| 2.56495 | 4.277 |
| 2.56495 | 4.277 |
| 2.56495 | 4.277 |
| 2.56495 | 4.277 |
| 2.56495 | 4.277 |
| 2.56495 | 4.277 |
| 2.56495 | 4.277 |
| 2.56495 | 4.277 |
| 2.56495 | 4.277 |
| 2.56495 | 4.277 |
| 2.56495 | 4.277 |
| 2.56495 | 4.277 |
| 2.56495 | 4.277 |
| 2.56495 | 4.277 |
| 2.56495 | 4.277 |
| 2.56495 | 4.277 |
| 2.56495 | 4.277 |
| 2.56495 | 4.277 |
| 2.56495 | 4.277 |
| 2.56495 | 4.277 |
| 2.56495 | 4.277 |
| 2.56495 | 4.277 |
| 2.56495 | 4.277 |
| 2.56495 | 4.277 |
| 2.56495 | 4.277 |
| 2.56495 | 4.277 |
| 2.56495 | 4.277 |
| 2.56495 | 4.277 |
| 2.56495 | 4.277 |
| 2.56495 | 4.277 |
| 2.56495 | 4.277 |
| 2.56495 | 4.277 |
| 2.56495 | 4.277 |
| 2.48491 | 4.522 |
| 2.48491 | 4.522 |
| 2.48491 | 4.522 |
| 2.48491 | 4.522 |
| 2.48491 | 4.522 |
| 2.48491 | 4.522 |
| 2.48491 | 4.522 |
| 2.48491 | 4.522 |
| 2.48491 | 4.522 |
| 2.48491 | 4.522 |
| 2.48491 | 4.522 |
| 2.48491 | 4.522 |
| 2.48491 | 4.522 |
| 2.48491 | 4.522 |
| 2.48491 | 4.522 |
| 2.48491 | 4.522 |
| 2.48491 | 4.522 |
| 2.48491 | 4.522 |
| 2.48491 | 4.522 |
| 2.48491 | 4.522 |
| 2.48491 | 4.522 |
| 2.48491 | 4.522 |
| 2.48491 | 4.522 |
| 2.48491 | 4.522 |
| 2.48491 | 4.522 |
| 2.48491 | 4.522 |
| 2.48491 | 4.522 |
| 2.48491 | 4.522 |
| 2.48491 | 4.522 |
| 2.48491 | 4.522 |
| 2.48491 | 4.522 |
| 2.48491 | 4.522 |
| 2.48491 | 4.522 |
| 2.48491 | 4.522 |
| 2.48491 | 4.522 |
| 2.48491 | 4.522 |
| 2.48491 | 4.522 |
| 2.48491 | 4.522 |
| 2.48491 | 4.522 |
| 2.48491 | 4.522 |
| 2.48491 | 4.522 |
| 2.48491 | 4.522 |
| 2.48491 | 4.522 |
| 2.48491 | 4.522 |
| 2.48491 | 4.522 |
| 2.48491 | 4.522 |
| 2.48491 | 4.522 |
| 2.48491 | 4.522 |
| 2.48491 | 4.522 |
| 2.48491 | 4.522 |
| 2.48491 | 4.522 |
| 2.48491 | 4.522 |
| 2.48491 | 4.522 |
| 2.48491 | 4.522 |
| 2.48491 | 4.522 |
| 2.48491 | 4.522 |
| 2.48491 | 4.522 |
| 2.48491 | 4.522 |
| 2.48491 | 4.522 |
| 2.48491 | 4.522 |
| 2.48491 | 4.522 |
| 2.48491 | 4.522 |
| 2.48491 | 4.522 |
| 2.48491 | 4.522 |
| 2.48491 | 4.522 |
| 2.48491 | 4.522 |
| 2.48491 | 4.522 |
| 2.48491 | 4.522 |
| 2.48491 | 4.522 |
| 2.48491 | 4.522 |
| 2.48491 | 4.522 |
| 2.48491 | 4.522 |
| 2.48491 | 4.522 |
| 2.48491 | 4.522 |
| 2.48491 | 4.522 |
| 2.48491 | 4.522 |
| 2.48491 | 4.522 |
| 2.48491 | 4.522 |
| 2.48491 | 4.522 |
| 2.48491 | 4.522 |
| 2.48491 | 4.522 |
| 2.48491 | 4.522 |
| 2.48491 | 4.522 |
| 2.48491 | 4.522 |
| 2.48491 | 4.522 |
| 2.48491 | 4.522 |
| 2.48491 | 4.522 |
| 2.48491 | 4.522 |
| 2.48491 | 4.522 |
| 2.48491 | 4.522 |
| 2.48491 | 4.522 |
| 2.48491 | 4.522 |
| 2.3979 | 4.382 |
| 2.3979 | 4.382 |
| 2.3979 | 4.382 |
| 2.3979 | 4.382 |
| 2.3979 | 4.382 |
| 2.3979 | 4.382 |
| 2.3979 | 4.382 |
| 2.3979 | 4.382 |
| 2.3979 | 4.382 |
| 2.3979 | 4.382 |
| 2.3979 | 4.382 |
| 2.3979 | 4.382 |
| 2.3979 | 4.382 |
| 2.3979 | 4.382 |
| 2.3979 | 4.382 |
| 2.3979 | 4.382 |
| 2.3979 | 4.382 |
| 2.3979 | 4.382 |
| 2.3979 | 4.382 |
| 2.3979 | 4.382 |
| 2.3979 | 4.382 |
| 2.3979 | 4.382 |
| 2.3979 | 4.382 |
| 2.3979 | 4.382 |
| 2.3979 | 4.382 |
| 2.3979 | 4.382 |
| 2.3979 | 4.382 |
| 2.3979 | 4.382 |
| 2.3979 | 4.382 |
| 2.3979 | 4.382 |
| 2.3979 | 4.382 |
| 2.3979 | 4.382 |
| 2.3979 | 4.382 |
| 2.3979 | 4.382 |
| 2.3979 | 4.382 |
| 2.3979 | 4.382 |
| 2.3979 | 4.382 |
| 2.3979 | 4.382 |
| 2.3979 | 4.382 |
| 2.3979 | 4.382 |
| 2.3979 | 4.382 |
| 2.3979 | 4.382 |
| 2.3979 | 4.382 |
| 2.3979 | 4.382 |
| 2.3979 | 4.382 |
| 2.3979 | 4.382 |
| 2.3979 | 4.382 |
| 2.3979 | 4.382 |
| 2.3979 | 4.382 |
| 2.3979 | 4.382 |
| 2.3979 | 4.382 |
| 2.3979 | 4.382 |
| 2.3979 | 4.382 |
| 2.3979 | 4.382 |
| 2.3979 | 4.382 |
| 2.3979 | 4.382 |
| 2.3979 | 4.382 |
| 2.3979 | 4.382 |
| 2.3979 | 4.382 |
| 2.3979 | 4.382 |
| 2.3979 | 4.382 |
| 2.3979 | 4.382 |
| 2.3979 | 4.382 |
| 2.3979 | 4.382 |
| 2.3979 | 4.382 |
| 2.3979 | 4.382 |
| 2.3979 | 4.382 |
| 2.3979 | 4.382 |
| 2.3979 | 4.382 |
| 2.3979 | 4.382 |
| 2.3979 | 4.382 |
| 2.3979 | 4.382 |
| 2.3979 | 4.382 |
| 2.3979 | 4.382 |
| 2.3979 | 4.382 |
| 2.3979 | 4.382 |
| 2.3979 | 4.382 |
| 2.3979 | 4.382 |
| 2.3979 | 4.382 |
| 2.3979 | 4.382 |
| 2.30259 | 4.682 |
| 2.30259 | 4.682 |
| 2.30259 | 4.682 |
| 2.30259 | 4.682 |
| 2.30259 | 4.682 |
| 2.30259 | 4.682 |
| 2.30259 | 4.682 |
| 2.30259 | 4.682 |
| 2.30259 | 4.682 |
| 2.30259 | 4.682 |
| 2.30259 | 4.682 |
| 2.30259 | 4.682 |
| 2.30259 | 4.682 |
| 2.30259 | 4.682 |
| 2.30259 | 4.682 |
| 2.30259 | 4.682 |
| 2.30259 | 4.682 |
| 2.30259 | 4.682 |
| 2.30259 | 4.682 |
| 2.30259 | 4.682 |
| 2.30259 | 4.682 |
| 2.30259 | 4.682 |
| 2.30259 | 4.682 |
| 2.30259 | 4.682 |
| 2.30259 | 4.682 |
| 2.30259 | 4.682 |
| 2.30259 | 4.682 |
| 2.30259 | 4.682 |
| 2.30259 | 4.682 |
| 2.30259 | 4.682 |
| 2.30259 | 4.682 |
| 2.30259 | 4.682 |
| 2.30259 | 4.682 |
| 2.30259 | 4.682 |
| 2.30259 | 4.682 |
| 2.30259 | 4.682 |
| 2.30259 | 4.682 |
| 2.30259 | 4.682 |
| 2.30259 | 4.682 |
| 2.30259 | 4.682 |
| 2.30259 | 4.682 |
| 2.30259 | 4.682 |
| 2.30259 | 4.682 |
| 2.30259 | 4.682 |
| 2.30259 | 4.682 |
| 2.30259 | 4.682 |
| 2.30259 | 4.682 |
| 2.30259 | 4.682 |
| 2.30259 | 4.682 |
| 2.30259 | 4.682 |
| 2.30259 | 4.682 |
| 2.30259 | 4.682 |
| 2.30259 | 4.682 |
| 2.30259 | 4.682 |
| 2.30259 | 4.682 |
| 2.30259 | 4.682 |
| 2.30259 | 4.682 |
| 2.30259 | 4.682 |
| 2.30259 | 4.682 |
| 2.30259 | 4.682 |
| 2.30259 | 4.682 |
| 2.30259 | 4.682 |
| 2.30259 | 4.682 |
| 2.30259 | 4.682 |
| 2.30259 | 4.682 |
| 2.30259 | 4.682 |
| 2.30259 | 4.682 |
| 2.30259 | 4.682 |
| 2.30259 | 4.682 |
| 2.30259 | 4.682 |
| 2.30259 | 4.682 |
| 2.30259 | 4.682 |
| 2.30259 | 4.682 |
| 2.30259 | 4.682 |
| 2.30259 | 4.682 |
| 2.30259 | 4.682 |
| 2.30259 | 4.682 |
| 2.30259 | 4.682 |
| 2.30259 | 4.682 |
| 2.30259 | 4.682 |
| 2.30259 | 4.682 |
| 2.30259 | 4.682 |
| 2.30259 | 4.682 |
| 2.30259 | 4.682 |
| 2.30259 | 4.682 |
| 2.30259 | 4.682 |
| 2.30259 | 4.682 |
| 2.30259 | 4.682 |
| 2.30259 | 4.682 |
| 2.30259 | 4.682 |
| 2.30259 | 4.682 |
| 2.30259 | 4.682 |
| 2.30259 | 4.682 |
| 2.30259 | 4.682 |
| 2.30259 | 4.682 |
| 2.30259 | 4.682 |
| 2.30259 | 4.682 |
| 2.30259 | 4.682 |
| 2.30259 | 4.682 |
| 2.30259 | 4.682 |
| 2.30259 | 4.682 |
| 2.30259 | 4.682 |
| 2.30259 | 4.682 |
| 2.30259 | 4.682 |
| 2.30259 | 4.682 |
| 2.30259 | 4.682 |
| 2.30259 | 4.682 |
| 2.30259 | 4.682 |
| 2.19722 | 4.543 |
| 2.19722 | 4.543 |
| 2.19722 | 4.543 |
| 2.19722 | 4.543 |
| 2.19722 | 4.543 |
| 2.19722 | 4.543 |
| 2.19722 | 4.543 |
| 2.19722 | 4.543 |
| 2.19722 | 4.543 |
| 2.19722 | 4.543 |
| 2.19722 | 4.543 |
| 2.19722 | 4.543 |
| 2.19722 | 4.543 |
| 2.19722 | 4.543 |
| 2.19722 | 4.543 |
| 2.19722 | 4.543 |
| 2.19722 | 4.543 |
| 2.19722 | 4.543 |
| 2.19722 | 4.543 |
| 2.19722 | 4.543 |
| 2.19722 | 4.543 |
| 2.19722 | 4.543 |
| 2.19722 | 4.543 |
| 2.19722 | 4.543 |
| 2.19722 | 4.543 |
| 2.19722 | 4.543 |
| 2.19722 | 4.543 |
| 2.19722 | 4.543 |
| 2.19722 | 4.543 |
| 2.19722 | 4.543 |
| 2.19722 | 4.543 |
| 2.19722 | 4.543 |
| 2.19722 | 4.543 |
| 2.19722 | 4.543 |
| 2.19722 | 4.543 |
| 2.19722 | 4.543 |
| 2.19722 | 4.543 |
| 2.19722 | 4.543 |
| 2.19722 | 4.543 |
| 2.19722 | 4.543 |
| 2.19722 | 4.543 |
| 2.19722 | 4.543 |
| 2.19722 | 4.543 |
| 2.19722 | 4.543 |
| 2.19722 | 4.543 |
| 2.19722 | 4.543 |
| 2.19722 | 4.543 |
| 2.19722 | 4.543 |
| 2.19722 | 4.543 |
| 2.19722 | 4.543 |
| 2.19722 | 4.543 |
| 2.19722 | 4.543 |
| 2.19722 | 4.543 |
| 2.19722 | 4.543 |
| 2.19722 | 4.543 |
| 2.19722 | 4.543 |
| 2.19722 | 4.543 |
| 2.19722 | 4.543 |
| 2.19722 | 4.543 |
| 2.19722 | 4.543 |
| 2.19722 | 4.543 |
| 2.19722 | 4.543 |
| 2.19722 | 4.543 |
| 2.19722 | 4.543 |
| 2.19722 | 4.543 |
| 2.19722 | 4.543 |
| 2.19722 | 4.543 |
| 2.19722 | 4.543 |
| 2.19722 | 4.543 |
| 2.19722 | 4.543 |
| 2.19722 | 4.543 |
| 2.19722 | 4.543 |
| 2.19722 | 4.543 |
| 2.19722 | 4.543 |
| 2.19722 | 4.543 |
| 2.19722 | 4.543 |
| 2.19722 | 4.543 |
| 2.19722 | 4.543 |
| 2.19722 | 4.543 |
| 2.19722 | 4.543 |
| 2.19722 | 4.543 |
| 2.19722 | 4.543 |
| 2.19722 | 4.543 |
| 2.19722 | 4.543 |
| 2.19722 | 4.543 |
| 2.19722 | 4.543 |
| 2.19722 | 4.543 |
| 2.19722 | 4.543 |
| 2.19722 | 4.543 |
| 2.19722 | 4.543 |
| 2.19722 | 4.543 |
| 2.19722 | 4.543 |
| 2.19722 | 4.543 |
| 2.19722 | 4.543 |
| 2.07944 | 4.942 |
| 2.07944 | 4.942 |
| 2.07944 | 4.942 |
| 2.07944 | 4.942 |
| 2.07944 | 4.942 |
| 2.07944 | 4.942 |
| 2.07944 | 4.942 |
| 2.07944 | 4.942 |
| 2.07944 | 4.942 |
| 2.07944 | 4.942 |
| 2.07944 | 4.942 |
| 2.07944 | 4.942 |
| 2.07944 | 4.942 |
| 2.07944 | 4.942 |
| 2.07944 | 4.942 |
| 2.07944 | 4.942 |
| 2.07944 | 4.942 |
| 2.07944 | 4.942 |
| 2.07944 | 4.942 |
| 2.07944 | 4.942 |
| 2.07944 | 4.942 |
| 2.07944 | 4.942 |
| 2.07944 | 4.942 |
| 2.07944 | 4.942 |
| 2.07944 | 4.942 |
| 2.07944 | 4.942 |
| 2.07944 | 4.942 |
| 2.07944 | 4.942 |
| 2.07944 | 4.942 |
| 2.07944 | 4.942 |
| 2.07944 | 4.942 |
| 2.07944 | 4.942 |
| 2.07944 | 4.942 |
| 2.07944 | 4.942 |
| 2.07944 | 4.942 |
| 2.07944 | 4.942 |
| 2.07944 | 4.942 |
| 2.07944 | 4.942 |
| 2.07944 | 4.942 |
| 2.07944 | 4.942 |
| 2.07944 | 4.942 |
| 2.07944 | 4.942 |
| 2.07944 | 4.942 |
| 2.07944 | 4.942 |
| 2.07944 | 4.942 |
| 2.07944 | 4.942 |
| 2.07944 | 4.942 |
| 2.07944 | 4.942 |
| 2.07944 | 4.942 |
| 2.07944 | 4.942 |
| 2.07944 | 4.942 |
| 2.07944 | 4.942 |
| 2.07944 | 4.942 |
| 2.07944 | 4.942 |
| 2.07944 | 4.942 |
| 2.07944 | 4.942 |
| 2.07944 | 4.942 |
| 2.07944 | 4.942 |
| 2.07944 | 4.942 |
| 2.07944 | 4.942 |
| 2.07944 | 4.942 |
| 2.07944 | 4.942 |
| 2.07944 | 4.942 |
| 2.07944 | 4.942 |
| 2.07944 | 4.942 |
| 2.07944 | 4.942 |
| 2.07944 | 4.942 |
| 2.07944 | 4.942 |
| 2.07944 | 4.942 |
| 2.07944 | 4.942 |
| 2.07944 | 4.942 |
| 2.07944 | 4.942 |
| 2.07944 | 4.942 |
| 2.07944 | 4.942 |
| 2.07944 | 4.942 |
| 2.07944 | 4.942 |
| 2.07944 | 4.942 |
| 2.07944 | 4.942 |
| 2.07944 | 4.942 |
| 2.07944 | 4.942 |
| 2.07944 | 4.942 |
| 2.07944 | 4.942 |
| 2.07944 | 4.942 |
| 2.07944 | 4.942 |
| 2.07944 | 4.942 |
| 2.07944 | 4.942 |
| 2.07944 | 4.942 |
| 2.07944 | 4.942 |
| 2.07944 | 4.942 |
| 2.07944 | 4.942 |
| 2.07944 | 4.942 |
| 2.07944 | 4.942 |
| 2.07944 | 4.942 |
| 2.07944 | 4.942 |
| 2.07944 | 4.942 |
| 2.07944 | 4.942 |
| 2.07944 | 4.942 |
| 2.07944 | 4.942 |
| 2.07944 | 4.942 |
| 2.07944 | 4.942 |
| 2.07944 | 4.942 |
| 2.07944 | 4.942 |
| 2.07944 | 4.942 |
| 2.07944 | 4.942 |
| 2.07944 | 4.942 |
| 2.07944 | 4.942 |
| 2.07944 | 4.942 |
| 2.07944 | 4.942 |
| 2.07944 | 4.942 |
| 2.07944 | 4.942 |
| 2.07944 | 4.942 |
| 2.07944 | 4.942 |
| 2.07944 | 4.942 |
| 2.07944 | 4.942 |
| 2.07944 | 4.942 |
| 2.07944 | 4.942 |
| 2.07944 | 4.942 |
| 2.07944 | 4.942 |
| 2.07944 | 4.942 |
| 2.07944 | 4.942 |
| 2.07944 | 4.942 |
| 2.07944 | 4.942 |
| 2.07944 | 4.942 |
| 2.07944 | 4.942 |
| 2.07944 | 4.942 |
| 2.07944 | 4.942 |
| 2.07944 | 4.942 |
| 2.07944 | 4.942 |
| 2.07944 | 4.942 |
| 2.07944 | 4.942 |
| 2.07944 | 4.942 |
| 2.07944 | 4.942 |
| 2.07944 | 4.942 |
| 2.07944 | 4.942 |
| 2.07944 | 4.942 |
| 2.07944 | 4.942 |
| 2.07944 | 4.942 |
| 2.07944 | 4.942 |
| 2.07944 | 4.942 |
| 2.07944 | 4.942 |
| 1.94591 | 4.844 |
| 1.94591 | 4.844 |
| 1.94591 | 4.844 |
| 1.94591 | 4.844 |
| 1.94591 | 4.844 |
| 1.94591 | 4.844 |
| 1.94591 | 4.844 |
| 1.94591 | 4.844 |
| 1.94591 | 4.844 |
| 1.94591 | 4.844 |
| 1.94591 | 4.844 |
| 1.94591 | 4.844 |
| 1.94591 | 4.844 |
| 1.94591 | 4.844 |
| 1.94591 | 4.844 |
| 1.94591 | 4.844 |
| 1.94591 | 4.844 |
| 1.94591 | 4.844 |
| 1.94591 | 4.844 |
| 1.94591 | 4.844 |
| 1.94591 | 4.844 |
| 1.94591 | 4.844 |
| 1.94591 | 4.844 |
| 1.94591 | 4.844 |
| 1.94591 | 4.844 |
| 1.94591 | 4.844 |
| 1.94591 | 4.844 |
| 1.94591 | 4.844 |
| 1.94591 | 4.844 |
| 1.94591 | 4.844 |
| 1.94591 | 4.844 |
| 1.94591 | 4.844 |
| 1.94591 | 4.844 |
| 1.94591 | 4.844 |
| 1.94591 | 4.844 |
| 1.94591 | 4.844 |
| 1.94591 | 4.844 |
| 1.94591 | 4.844 |
| 1.94591 | 4.844 |
| 1.94591 | 4.844 |
| 1.94591 | 4.844 |
| 1.94591 | 4.844 |
| 1.94591 | 4.844 |
| 1.94591 | 4.844 |
| 1.94591 | 4.844 |
| 1.94591 | 4.844 |
| 1.94591 | 4.844 |
| 1.94591 | 4.844 |
| 1.94591 | 4.844 |
| 1.94591 | 4.844 |
| 1.94591 | 4.844 |
| 1.94591 | 4.844 |
| 1.94591 | 4.844 |
| 1.94591 | 4.844 |
| 1.94591 | 4.844 |
| 1.94591 | 4.844 |
| 1.94591 | 4.844 |
| 1.94591 | 4.844 |
| 1.94591 | 4.844 |
| 1.94591 | 4.844 |
| 1.94591 | 4.844 |
| 1.94591 | 4.844 |
| 1.94591 | 4.844 |
| 1.94591 | 4.844 |
| 1.94591 | 4.844 |
| 1.94591 | 4.844 |
| 1.94591 | 4.844 |
| 1.94591 | 4.844 |
| 1.94591 | 4.844 |
| 1.94591 | 4.844 |
| 1.94591 | 4.844 |
| 1.94591 | 4.844 |
| 1.94591 | 4.844 |
| 1.94591 | 4.844 |
| 1.94591 | 4.844 |
| 1.94591 | 4.844 |
| 1.94591 | 4.844 |
| 1.94591 | 4.844 |
| 1.94591 | 4.844 |
| 1.94591 | 4.844 |
| 1.94591 | 4.844 |
| 1.94591 | 4.844 |
| 1.94591 | 4.844 |
| 1.94591 | 4.844 |
| 1.94591 | 4.844 |
| 1.94591 | 4.844 |
| 1.94591 | 4.844 |
| 1.94591 | 4.844 |
| 1.94591 | 4.844 |
| 1.94591 | 4.844 |
| 1.94591 | 4.844 |
| 1.94591 | 4.844 |
| 1.94591 | 4.844 |
| 1.94591 | 4.844 |
| 1.94591 | 4.844 |
| 1.94591 | 4.844 |
| 1.94591 | 4.844 |
| 1.94591 | 4.844 |
| 1.94591 | 4.844 |
| 1.94591 | 4.844 |
| 1.94591 | 4.844 |
| 1.94591 | 4.844 |
| 1.94591 | 4.844 |
| 1.94591 | 4.844 |
| 1.94591 | 4.844 |
| 1.94591 | 4.844 |
| 1.94591 | 4.844 |
| 1.94591 | 4.844 |
| 1.94591 | 4.844 |
| 1.94591 | 4.844 |
| 1.94591 | 4.844 |
| 1.94591 | 4.844 |
| 1.94591 | 4.844 |
| 1.94591 | 4.844 |
| 1.94591 | 4.844 |
| 1.94591 | 4.844 |
| 1.94591 | 4.844 |
| 1.94591 | 4.844 |
| 1.94591 | 4.844 |
| 1.94591 | 4.844 |
| 1.94591 | 4.844 |
| 1.94591 | 4.844 |
| 1.94591 | 4.844 |
| 1.94591 | 4.844 |
| 1.94591 | 4.844 |
| 1.94591 | 4.844 |
| 1.94591 | 4.844 |
| 1.79176 | 5.069 |
| 1.79176 | 5.069 |
| 1.79176 | 5.069 |
| 1.79176 | 5.069 |
| 1.79176 | 5.069 |
| 1.79176 | 5.069 |
| 1.79176 | 5.069 |
| 1.79176 | 5.069 |
| 1.79176 | 5.069 |
| 1.79176 | 5.069 |
| 1.79176 | 5.069 |
| 1.79176 | 5.069 |
| 1.79176 | 5.069 |
| 1.79176 | 5.069 |
| 1.79176 | 5.069 |
| 1.79176 | 5.069 |
| 1.79176 | 5.069 |
| 1.79176 | 5.069 |
| 1.79176 | 5.069 |
| 1.79176 | 5.069 |
| 1.79176 | 5.069 |
| 1.79176 | 5.069 |
| 1.79176 | 5.069 |
| 1.79176 | 5.069 |
| 1.79176 | 5.069 |
| 1.79176 | 5.069 |
| 1.79176 | 5.069 |
| 1.79176 | 5.069 |
| 1.79176 | 5.069 |
| 1.79176 | 5.069 |
| 1.79176 | 5.069 |
| 1.79176 | 5.069 |
| 1.79176 | 5.069 |
| 1.79176 | 5.069 |
| 1.79176 | 5.069 |
| 1.79176 | 5.069 |
| 1.79176 | 5.069 |
| 1.79176 | 5.069 |
| 1.79176 | 5.069 |
| 1.79176 | 5.069 |
| 1.79176 | 5.069 |
| 1.79176 | 5.069 |
| 1.79176 | 5.069 |
| 1.79176 | 5.069 |
| 1.79176 | 5.069 |
| 1.79176 | 5.069 |
| 1.79176 | 5.069 |
| 1.79176 | 5.069 |
| 1.79176 | 5.069 |
| 1.79176 | 5.069 |
| 1.79176 | 5.069 |
| 1.79176 | 5.069 |
| 1.79176 | 5.069 |
| 1.79176 | 5.069 |
| 1.79176 | 5.069 |
| 1.79176 | 5.069 |
| 1.79176 | 5.069 |
| 1.79176 | 5.069 |
| 1.79176 | 5.069 |
| 1.79176 | 5.069 |
| 1.79176 | 5.069 |
| 1.79176 | 5.069 |
| 1.79176 | 5.069 |
| 1.79176 | 5.069 |
| 1.79176 | 5.069 |
| 1.79176 | 5.069 |
| 1.79176 | 5.069 |
| 1.79176 | 5.069 |
| 1.79176 | 5.069 |
| 1.79176 | 5.069 |
| 1.79176 | 5.069 |
| 1.79176 | 5.069 |
| 1.79176 | 5.069 |
| 1.79176 | 5.069 |
| 1.79176 | 5.069 |
| 1.79176 | 5.069 |
| 1.79176 | 5.069 |
| 1.79176 | 5.069 |
| 1.79176 | 5.069 |
| 1.79176 | 5.069 |
| 1.79176 | 5.069 |
| 1.79176 | 5.069 |
| 1.79176 | 5.069 |
| 1.79176 | 5.069 |
| 1.79176 | 5.069 |
| 1.79176 | 5.069 |
| 1.79176 | 5.069 |
| 1.79176 | 5.069 |
| 1.79176 | 5.069 |
| 1.79176 | 5.069 |
| 1.79176 | 5.069 |
| 1.79176 | 5.069 |
| 1.79176 | 5.069 |
| 1.79176 | 5.069 |
| 1.79176 | 5.069 |
| 1.79176 | 5.069 |
| 1.79176 | 5.069 |
| 1.79176 | 5.069 |
| 1.79176 | 5.069 |
| 1.79176 | 5.069 |
| 1.79176 | 5.069 |
| 1.79176 | 5.069 |
| 1.79176 | 5.069 |
| 1.79176 | 5.069 |
| 1.79176 | 5.069 |
| 1.79176 | 5.069 |
| 1.79176 | 5.069 |
| 1.79176 | 5.069 |
| 1.79176 | 5.069 |
| 1.79176 | 5.069 |
| 1.79176 | 5.069 |
| 1.79176 | 5.069 |
| 1.79176 | 5.069 |
| 1.79176 | 5.069 |
| 1.79176 | 5.069 |
| 1.79176 | 5.069 |
| 1.79176 | 5.069 |
| 1.79176 | 5.069 |
| 1.79176 | 5.069 |
| 1.79176 | 5.069 |
| 1.79176 | 5.069 |
| 1.79176 | 5.069 |
| 1.79176 | 5.069 |
| 1.79176 | 5.069 |
| 1.79176 | 5.069 |
| 1.79176 | 5.069 |
| 1.79176 | 5.069 |
| 1.79176 | 5.069 |
| 1.79176 | 5.069 |
| 1.79176 | 5.069 |
| 1.79176 | 5.069 |
| 1.79176 | 5.069 |
| 1.79176 | 5.069 |
| 1.79176 | 5.069 |
| 1.79176 | 5.069 |
| 1.79176 | 5.069 |
| 1.79176 | 5.069 |
| 1.79176 | 5.069 |
| 1.79176 | 5.069 |
| 1.79176 | 5.069 |
| 1.79176 | 5.069 |
| 1.79176 | 5.069 |
| 1.79176 | 5.069 |
| 1.79176 | 5.069 |
| 1.79176 | 5.069 |
| 1.79176 | 5.069 |
| 1.79176 | 5.069 |
| 1.79176 | 5.069 |
| 1.79176 | 5.069 |
| 1.79176 | 5.069 |
| 1.79176 | 5.069 |
| 1.79176 | 5.069 |
| 1.79176 | 5.069 |
| 1.79176 | 5.069 |
| 1.79176 | 5.069 |
| 1.79176 | 5.069 |
| 1.79176 | 5.069 |
| 1.79176 | 5.069 |
| 1.79176 | 5.069 |
| 1.60944 | 5.268 |
| 1.60944 | 5.268 |
| 1.60944 | 5.268 |
| 1.60944 | 5.268 |
| 1.60944 | 5.268 |
| 1.60944 | 5.268 |
| 1.60944 | 5.268 |
| 1.60944 | 5.268 |
| 1.60944 | 5.268 |
| 1.60944 | 5.268 |
| 1.60944 | 5.268 |
| 1.60944 | 5.268 |
| 1.60944 | 5.268 |
| 1.60944 | 5.268 |
| 1.60944 | 5.268 |
| 1.60944 | 5.268 |
| 1.60944 | 5.268 |
| 1.60944 | 5.268 |
| 1.60944 | 5.268 |
| 1.60944 | 5.268 |
| 1.60944 | 5.268 |
| 1.60944 | 5.268 |
| 1.60944 | 5.268 |
| 1.60944 | 5.268 |
| 1.60944 | 5.268 |
| 1.60944 | 5.268 |
| 1.60944 | 5.268 |
| 1.60944 | 5.268 |
| 1.60944 | 5.268 |
| 1.60944 | 5.268 |
| 1.60944 | 5.268 |
| 1.60944 | 5.268 |
| 1.60944 | 5.268 |
| 1.60944 | 5.268 |
| 1.60944 | 5.268 |
| 1.60944 | 5.268 |
| 1.60944 | 5.268 |
| 1.60944 | 5.268 |
| 1.60944 | 5.268 |
| 1.60944 | 5.268 |
| 1.60944 | 5.268 |
| 1.60944 | 5.268 |
| 1.60944 | 5.268 |
| 1.60944 | 5.268 |
| 1.60944 | 5.268 |
| 1.60944 | 5.268 |
| 1.60944 | 5.268 |
| 1.60944 | 5.268 |
| 1.60944 | 5.268 |
| 1.60944 | 5.268 |
| 1.60944 | 5.268 |
| 1.60944 | 5.268 |
| 1.60944 | 5.268 |
| 1.60944 | 5.268 |
| 1.60944 | 5.268 |
| 1.60944 | 5.268 |
| 1.60944 | 5.268 |
| 1.60944 | 5.268 |
| 1.60944 | 5.268 |
| 1.60944 | 5.268 |
| 1.60944 | 5.268 |
| 1.60944 | 5.268 |
| 1.60944 | 5.268 |
| 1.60944 | 5.268 |
| 1.60944 | 5.268 |
| 1.60944 | 5.268 |
| 1.60944 | 5.268 |
| 1.60944 | 5.268 |
| 1.60944 | 5.268 |
| 1.60944 | 5.268 |
| 1.60944 | 5.268 |
| 1.60944 | 5.268 |
| 1.60944 | 5.268 |
| 1.60944 | 5.268 |
| 1.60944 | 5.268 |
| 1.60944 | 5.268 |
| 1.60944 | 5.268 |
| 1.60944 | 5.268 |
| 1.60944 | 5.268 |
| 1.60944 | 5.268 |
| 1.60944 | 5.268 |
| 1.60944 | 5.268 |
| 1.60944 | 5.268 |
| 1.60944 | 5.268 |
| 1.60944 | 5.268 |
| 1.60944 | 5.268 |
| 1.60944 | 5.268 |
| 1.60944 | 5.268 |
| 1.60944 | 5.268 |
| 1.60944 | 5.268 |
| 1.60944 | 5.268 |
| 1.60944 | 5.268 |
| 1.60944 | 5.268 |
| 1.60944 | 5.268 |
| 1.60944 | 5.268 |
| 1.60944 | 5.268 |
| 1.60944 | 5.268 |
| 1.60944 | 5.268 |
| 1.60944 | 5.268 |
| 1.60944 | 5.268 |
| 1.60944 | 5.268 |
| 1.60944 | 5.268 |
| 1.60944 | 5.268 |
| 1.60944 | 5.268 |
| 1.60944 | 5.268 |
| 1.60944 | 5.268 |
| 1.60944 | 5.268 |
| 1.60944 | 5.268 |
| 1.60944 | 5.268 |
| 1.60944 | 5.268 |
| 1.60944 | 5.268 |
| 1.60944 | 5.268 |
| 1.60944 | 5.268 |
| 1.60944 | 5.268 |
| 1.60944 | 5.268 |
| 1.60944 | 5.268 |
| 1.60944 | 5.268 |
| 1.60944 | 5.268 |
| 1.60944 | 5.268 |
| 1.60944 | 5.268 |
| 1.60944 | 5.268 |
| 1.60944 | 5.268 |
| 1.60944 | 5.268 |
| 1.60944 | 5.268 |
| 1.60944 | 5.268 |
| 1.60944 | 5.268 |
| 1.60944 | 5.268 |
| 1.60944 | 5.268 |
| 1.60944 | 5.268 |
| 1.60944 | 5.268 |
| 1.60944 | 5.268 |
| 1.60944 | 5.268 |
| 1.60944 | 5.268 |
| 1.60944 | 5.268 |
| 1.60944 | 5.268 |
| 1.60944 | 5.268 |
| 1.60944 | 5.268 |
| 1.60944 | 5.268 |
| 1.60944 | 5.268 |
| 1.60944 | 5.268 |
| 1.60944 | 5.268 |
| 1.60944 | 5.268 |
| 1.60944 | 5.268 |
| 1.60944 | 5.268 |
| 1.60944 | 5.268 |
| 1.60944 | 5.268 |
| 1.60944 | 5.268 |
| 1.60944 | 5.268 |
| 1.60944 | 5.268 |
| 1.60944 | 5.268 |
| 1.60944 | 5.268 |
| 1.60944 | 5.268 |
| 1.60944 | 5.268 |
| 1.60944 | 5.268 |
| 1.60944 | 5.268 |
| 1.60944 | 5.268 |
| 1.60944 | 5.268 |
| 1.60944 | 5.268 |
| 1.60944 | 5.268 |
| 1.60944 | 5.268 |
| 1.60944 | 5.268 |
| 1.60944 | 5.268 |
| 1.60944 | 5.268 |
| 1.60944 | 5.268 |
| 1.60944 | 5.268 |
| 1.60944 | 5.268 |
| 1.60944 | 5.268 |
| 1.60944 | 5.268 |
| 1.60944 | 5.268 |
| 1.60944 | 5.268 |
| 1.60944 | 5.268 |
| 1.60944 | 5.268 |
| 1.60944 | 5.268 |
| 1.60944 | 5.268 |
| 1.60944 | 5.268 |
| 1.60944 | 5.268 |
| 1.60944 | 5.268 |
| 1.60944 | 5.268 |
| 1.60944 | 5.268 |
| 1.60944 | 5.268 |
| 1.60944 | 5.268 |
| 1.60944 | 5.268 |
| 1.60944 | 5.268 |
| 1.60944 | 5.268 |
| 1.60944 | 5.268 |
| 1.60944 | 5.268 |
| 1.60944 | 5.268 |
| 1.60944 | 5.268 |
| 1.60944 | 5.268 |
| 1.60944 | 5.268 |
| 1.60944 | 5.268 |
| 1.60944 | 5.268 |
| 1.60944 | 5.268 |
| 1.60944 | 5.268 |
| 1.38629 | 5.403 |
| 1.38629 | 5.403 |
| 1.38629 | 5.403 |
| 1.38629 | 5.403 |
| 1.38629 | 5.403 |
| 1.38629 | 5.403 |
| 1.38629 | 5.403 |
| 1.38629 | 5.403 |
| 1.38629 | 5.403 |
| 1.38629 | 5.403 |
| 1.38629 | 5.403 |
| 1.38629 | 5.403 |
| 1.38629 | 5.403 |
| 1.38629 | 5.403 |
| 1.38629 | 5.403 |
| 1.38629 | 5.403 |
| 1.38629 | 5.403 |
| 1.38629 | 5.403 |
| 1.38629 | 5.403 |
| 1.38629 | 5.403 |
| 1.38629 | 5.403 |
| 1.38629 | 5.403 |
| 1.38629 | 5.403 |
| 1.38629 | 5.403 |
| 1.38629 | 5.403 |
| 1.38629 | 5.403 |
| 1.38629 | 5.403 |
| 1.38629 | 5.403 |
| 1.38629 | 5.403 |
| 1.38629 | 5.403 |
| 1.38629 | 5.403 |
| 1.38629 | 5.403 |
| 1.38629 | 5.403 |
| 1.38629 | 5.403 |
| 1.38629 | 5.403 |
| 1.38629 | 5.403 |
| 1.38629 | 5.403 |
| 1.38629 | 5.403 |
| 1.38629 | 5.403 |
| 1.38629 | 5.403 |
| 1.38629 | 5.403 |
| 1.38629 | 5.403 |
| 1.38629 | 5.403 |
| 1.38629 | 5.403 |
| 1.38629 | 5.403 |
| 1.38629 | 5.403 |
| 1.38629 | 5.403 |
| 1.38629 | 5.403 |
| 1.38629 | 5.403 |
| 1.38629 | 5.403 |
| 1.38629 | 5.403 |
| 1.38629 | 5.403 |
| 1.38629 | 5.403 |
| 1.38629 | 5.403 |
| 1.38629 | 5.403 |
| 1.38629 | 5.403 |
| 1.38629 | 5.403 |
| 1.38629 | 5.403 |
| 1.38629 | 5.403 |
| 1.38629 | 5.403 |
| 1.38629 | 5.403 |
| 1.38629 | 5.403 |
| 1.38629 | 5.403 |
| 1.38629 | 5.403 |
| 1.38629 | 5.403 |
| 1.38629 | 5.403 |
| 1.38629 | 5.403 |
| 1.38629 | 5.403 |
| 1.38629 | 5.403 |
| 1.38629 | 5.403 |
| 1.38629 | 5.403 |
| 1.38629 | 5.403 |
| 1.38629 | 5.403 |
| 1.38629 | 5.403 |
| 1.38629 | 5.403 |
| 1.38629 | 5.403 |
| 1.38629 | 5.403 |
| 1.38629 | 5.403 |
| 1.38629 | 5.403 |
| 1.38629 | 5.403 |
| 1.38629 | 5.403 |
| 1.38629 | 5.403 |
| 1.38629 | 5.403 |
| 1.38629 | 5.403 |
| 1.38629 | 5.403 |
| 1.38629 | 5.403 |
| 1.38629 | 5.403 |
| 1.38629 | 5.403 |
| 1.38629 | 5.403 |
| 1.38629 | 5.403 |
| 1.38629 | 5.403 |
| 1.38629 | 5.403 |
| 1.38629 | 5.403 |
| 1.38629 | 5.403 |
| 1.38629 | 5.403 |
| 1.38629 | 5.403 |
| 1.38629 | 5.403 |
| 1.38629 | 5.403 |
| 1.38629 | 5.403 |
| 1.38629 | 5.403 |
| 1.38629 | 5.403 |
| 1.38629 | 5.403 |
| 1.38629 | 5.403 |
| 1.38629 | 5.403 |
| 1.38629 | 5.403 |
| 1.38629 | 5.403 |
| 1.38629 | 5.403 |
| 1.38629 | 5.403 |
| 1.38629 | 5.403 |
| 1.38629 | 5.403 |
| 1.38629 | 5.403 |
| 1.38629 | 5.403 |
| 1.38629 | 5.403 |
| 1.38629 | 5.403 |
| 1.38629 | 5.403 |
| 1.38629 | 5.403 |
| 1.38629 | 5.403 |
| 1.38629 | 5.403 |
| 1.38629 | 5.403 |
| 1.38629 | 5.403 |
| 1.38629 | 5.403 |
| 1.38629 | 5.403 |
| 1.38629 | 5.403 |
| 1.38629 | 5.403 |
| 1.38629 | 5.403 |
| 1.38629 | 5.403 |
| 1.38629 | 5.403 |
| 1.38629 | 5.403 |
| 1.38629 | 5.403 |
| 1.38629 | 5.403 |
| 1.38629 | 5.403 |
| 1.38629 | 5.403 |
| 1.38629 | 5.403 |
| 1.38629 | 5.403 |
| 1.38629 | 5.403 |
| 1.38629 | 5.403 |
| 1.38629 | 5.403 |
| 1.38629 | 5.403 |
| 1.38629 | 5.403 |
| 1.38629 | 5.403 |
| 1.38629 | 5.403 |
| 1.38629 | 5.403 |
| 1.38629 | 5.403 |
| 1.38629 | 5.403 |
| 1.38629 | 5.403 |
| 1.38629 | 5.403 |
| 1.38629 | 5.403 |
| 1.38629 | 5.403 |
| 1.38629 | 5.403 |
| 1.38629 | 5.403 |
| 1.38629 | 5.403 |
| 1.38629 | 5.403 |
| 1.38629 | 5.403 |
| 1.38629 | 5.403 |
| 1.38629 | 5.403 |
| 1.38629 | 5.403 |
| 1.38629 | 5.403 |
| 1.38629 | 5.403 |
| 1.38629 | 5.403 |
| 1.38629 | 5.403 |
| 1.38629 | 5.403 |
| 1.38629 | 5.403 |
| 1.38629 | 5.403 |
| 1.38629 | 5.403 |
| 1.38629 | 5.403 |
| 1.38629 | 5.403 |
| 1.38629 | 5.403 |
| 1.38629 | 5.403 |
| 1.38629 | 5.403 |
| 1.38629 | 5.403 |
| 1.38629 | 5.403 |
| 1.38629 | 5.403 |
| 1.38629 | 5.403 |
| 1.38629 | 5.403 |
| 1.38629 | 5.403 |
| 1.38629 | 5.403 |
| 1.38629 | 5.403 |
| 1.38629 | 5.403 |
| 1.38629 | 5.403 |
| 1.38629 | 5.403 |
| 1.38629 | 5.403 |
| 1.38629 | 5.403 |
| 1.38629 | 5.403 |
| 1.38629 | 5.403 |
| 1.38629 | 5.403 |
| 1.38629 | 5.403 |
| 1.38629 | 5.403 |
| 1.38629 | 5.403 |
| 1.38629 | 5.403 |
| 1.38629 | 5.403 |
| 1.38629 | 5.403 |
| 1.38629 | 5.403 |
| 1.38629 | 5.403 |
| 1.38629 | 5.403 |
| 1.38629 | 5.403 |
| 1.38629 | 5.403 |
| 1.38629 | 5.403 |
| 1.38629 | 5.403 |
| 1.38629 | 5.403 |
| 1.38629 | 5.403 |
| 1.38629 | 5.403 |
| 1.38629 | 5.403 |
| 1.38629 | 5.403 |
| 1.38629 | 5.403 |
| 1.38629 | 5.403 |
| 1.38629 | 5.403 |
| 1.38629 | 5.403 |
| 1.38629 | 5.403 |
| 1.38629 | 5.403 |
| 1.38629 | 5.403 |
| 1.38629 | 5.403 |
| 1.38629 | 5.403 |
| 1.38629 | 5.403 |
| 1.38629 | 5.403 |
| 1.38629 | 5.403 |
| 1.38629 | 5.403 |
| 1.38629 | 5.403 |
| 1.38629 | 5.403 |
| 1.38629 | 5.403 |
| 1.38629 | 5.403 |
| 1.38629 | 5.403 |
| 1.38629 | 5.403 |
| 1.09861 | 5.811 |
| 1.09861 | 5.811 |
| 1.09861 | 5.811 |
| 1.09861 | 5.811 |
| 1.09861 | 5.811 |
| 1.09861 | 5.811 |
| 1.09861 | 5.811 |
| 1.09861 | 5.811 |
| 1.09861 | 5.811 |
| 1.09861 | 5.811 |
| 1.09861 | 5.811 |
| 1.09861 | 5.811 |
| 1.09861 | 5.811 |
| 1.09861 | 5.811 |
| 1.09861 | 5.811 |
| 1.09861 | 5.811 |
| 1.09861 | 5.811 |
| 1.09861 | 5.811 |
| 1.09861 | 5.811 |
| 1.09861 | 5.811 |
| 1.09861 | 5.811 |
| 1.09861 | 5.811 |
| 1.09861 | 5.811 |
| 1.09861 | 5.811 |
| 1.09861 | 5.811 |
| 1.09861 | 5.811 |
| 1.09861 | 5.811 |
| 1.09861 | 5.811 |
| 1.09861 | 5.811 |
| 1.09861 | 5.811 |
| 1.09861 | 5.811 |
| 1.09861 | 5.811 |
| 1.09861 | 5.811 |
| 1.09861 | 5.811 |
| 1.09861 | 5.811 |
| 1.09861 | 5.811 |
| 1.09861 | 5.811 |
| 1.09861 | 5.811 |
| 1.09861 | 5.811 |
| 1.09861 | 5.811 |
| 1.09861 | 5.811 |
| 1.09861 | 5.811 |
| 1.09861 | 5.811 |
| 1.09861 | 5.811 |
| 1.09861 | 5.811 |
| 1.09861 | 5.811 |
| 1.09861 | 5.811 |
| 1.09861 | 5.811 |
| 1.09861 | 5.811 |
| 1.09861 | 5.811 |
| 1.09861 | 5.811 |
| 1.09861 | 5.811 |
| 1.09861 | 5.811 |
| 1.09861 | 5.811 |
| 1.09861 | 5.811 |
| 1.09861 | 5.811 |
| 1.09861 | 5.811 |
| 1.09861 | 5.811 |
| 1.09861 | 5.811 |
| 1.09861 | 5.811 |
| 1.09861 | 5.811 |
| 1.09861 | 5.811 |
| 1.09861 | 5.811 |
| 1.09861 | 5.811 |
| 1.09861 | 5.811 |
| 1.09861 | 5.811 |
| 1.09861 | 5.811 |
| 1.09861 | 5.811 |
| 1.09861 | 5.811 |
| 1.09861 | 5.811 |
| 1.09861 | 5.811 |
| 1.09861 | 5.811 |
| 1.09861 | 5.811 |
| 1.09861 | 5.811 |
| 1.09861 | 5.811 |
| 1.09861 | 5.811 |
| 1.09861 | 5.811 |
| 1.09861 | 5.811 |
| 1.09861 | 5.811 |
| 1.09861 | 5.811 |
| 1.09861 | 5.811 |
| 1.09861 | 5.811 |
| 1.09861 | 5.811 |
| 1.09861 | 5.811 |
| 1.09861 | 5.811 |
| 1.09861 | 5.811 |
| 1.09861 | 5.811 |
| 1.09861 | 5.811 |
| 1.09861 | 5.811 |
| 1.09861 | 5.811 |
| 1.09861 | 5.811 |
| 1.09861 | 5.811 |
| 1.09861 | 5.811 |
| 1.09861 | 5.811 |
| 1.09861 | 5.811 |
| 1.09861 | 5.811 |
| 1.09861 | 5.811 |
| 1.09861 | 5.811 |
| 1.09861 | 5.811 |
| 1.09861 | 5.811 |
| 1.09861 | 5.811 |
| 1.09861 | 5.811 |
| 1.09861 | 5.811 |
| 1.09861 | 5.811 |
| 1.09861 | 5.811 |
| 1.09861 | 5.811 |
| 1.09861 | 5.811 |
| 1.09861 | 5.811 |
| 1.09861 | 5.811 |
| 1.09861 | 5.811 |
| 1.09861 | 5.811 |
| 1.09861 | 5.811 |
| 1.09861 | 5.811 |
| 1.09861 | 5.811 |
| 1.09861 | 5.811 |
| 1.09861 | 5.811 |
| 1.09861 | 5.811 |
| 1.09861 | 5.811 |
| 1.09861 | 5.811 |
| 1.09861 | 5.811 |
| 1.09861 | 5.811 |
| 1.09861 | 5.811 |
| 1.09861 | 5.811 |
| 1.09861 | 5.811 |
| 1.09861 | 5.811 |
| 1.09861 | 5.811 |
| 1.09861 | 5.811 |
| 1.09861 | 5.811 |
| 1.09861 | 5.811 |
| 1.09861 | 5.811 |
| 1.09861 | 5.811 |
| 1.09861 | 5.811 |
| 1.09861 | 5.811 |
| 1.09861 | 5.811 |
| 1.09861 | 5.811 |
| 1.09861 | 5.811 |
| 1.09861 | 5.811 |
| 1.09861 | 5.811 |
| 1.09861 | 5.811 |
| 1.09861 | 5.811 |
| 1.09861 | 5.811 |
| 1.09861 | 5.811 |
| 1.09861 | 5.811 |
| 1.09861 | 5.811 |
| 1.09861 | 5.811 |
| 1.09861 | 5.811 |
| 1.09861 | 5.811 |
| 1.09861 | 5.811 |
| 1.09861 | 5.811 |
| 1.09861 | 5.811 |
| 1.09861 | 5.811 |
| 1.09861 | 5.811 |
| 1.09861 | 5.811 |
| 1.09861 | 5.811 |
| 1.09861 | 5.811 |
| 1.09861 | 5.811 |
| 1.09861 | 5.811 |
| 1.09861 | 5.811 |
| 1.09861 | 5.811 |
| 1.09861 | 5.811 |
| 1.09861 | 5.811 |
| 1.09861 | 5.811 |
| 1.09861 | 5.811 |
| 1.09861 | 5.811 |
| 1.09861 | 5.811 |
| 1.09861 | 5.811 |
| 1.09861 | 5.811 |
| 1.09861 | 5.811 |
| 1.09861 | 5.811 |
| 1.09861 | 5.811 |
| 1.09861 | 5.811 |
| 1.09861 | 5.811 |
| 1.09861 | 5.811 |
| 1.09861 | 5.811 |
| 1.09861 | 5.811 |
| 1.09861 | 5.811 |
| 1.09861 | 5.811 |
| 1.09861 | 5.811 |
| 1.09861 | 5.811 |
| 1.09861 | 5.811 |
| 1.09861 | 5.811 |
| 1.09861 | 5.811 |
| 1.09861 | 5.811 |
| 1.09861 | 5.811 |
| 1.09861 | 5.811 |
| 1.09861 | 5.811 |
| 1.09861 | 5.811 |
| 1.09861 | 5.811 |
| 1.09861 | 5.811 |
| 1.09861 | 5.811 |
| 1.09861 | 5.811 |
| 1.09861 | 5.811 |
| 1.09861 | 5.811 |
| 1.09861 | 5.811 |
| 1.09861 | 5.811 |
| 1.09861 | 5.811 |
| 1.09861 | 5.811 |
| 1.09861 | 5.811 |
| 1.09861 | 5.811 |
| 1.09861 | 5.811 |
| 1.09861 | 5.811 |
| 1.09861 | 5.811 |
| 1.09861 | 5.811 |
| 1.09861 | 5.811 |
| 1.09861 | 5.811 |
| 1.09861 | 5.811 |
| 1.09861 | 5.811 |
| 1.09861 | 5.811 |
| 1.09861 | 5.811 |
| 1.09861 | 5.811 |
| 1.09861 | 5.811 |
| 1.09861 | 5.811 |
| 1.09861 | 5.811 |
| 1.09861 | 5.811 |
| 1.09861 | 5.811 |
| 1.09861 | 5.811 |
| 1.09861 | 5.811 |
| 1.09861 | 5.811 |
| 1.09861 | 5.811 |
| 1.09861 | 5.811 |
| 1.09861 | 5.811 |
| 1.09861 | 5.811 |
| 1.09861 | 5.811 |
| 1.09861 | 5.811 |
| 1.09861 | 5.811 |
| 1.09861 | 5.811 |
| 1.09861 | 5.811 |
| 1.09861 | 5.811 |
| 1.09861 | 5.811 |
| 1.09861 | 5.811 |
| 1.09861 | 5.811 |
| 1.09861 | 5.811 |
| 1.09861 | 5.811 |
| 1.09861 | 5.811 |
| 1.09861 | 5.811 |
| 1.09861 | 5.811 |
| 1.09861 | 5.811 |
| 1.09861 | 5.811 |
| 1.09861 | 5.811 |
| 1.09861 | 5.811 |
| 1.09861 | 5.811 |
| 1.09861 | 5.811 |
| 1.09861 | 5.811 |
| 1.09861 | 5.811 |
| 1.09861 | 5.811 |
| 1.09861 | 5.811 |
| 1.09861 | 5.811 |
| 1.09861 | 5.811 |
| 1.09861 | 5.811 |
| 1.09861 | 5.811 |
| 1.09861 | 5.811 |
| 1.09861 | 5.811 |
| 1.09861 | 5.811 |
| 1.09861 | 5.811 |
| 1.09861 | 5.811 |
| 1.09861 | 5.811 |
| 1.09861 | 5.811 |
| 1.09861 | 5.811 |
| 1.09861 | 5.811 |
| 1.09861 | 5.811 |
| 1.09861 | 5.811 |
| 1.09861 | 5.811 |
| 1.09861 | 5.811 |
| 1.09861 | 5.811 |
| 1.09861 | 5.811 |
| 1.09861 | 5.811 |
| 1.09861 | 5.811 |
| 1.09861 | 5.811 |
| 1.09861 | 5.811 |
| 1.09861 | 5.811 |
| 1.09861 | 5.811 |
| 1.09861 | 5.811 |
| 1.09861 | 5.811 |
| 1.09861 | 5.811 |
| 1.09861 | 5.811 |
| 1.09861 | 5.811 |
| 1.09861 | 5.811 |
| 1.09861 | 5.811 |
| 1.09861 | 5.811 |
| 1.09861 | 5.811 |
| 1.09861 | 5.811 |
| 1.09861 | 5.811 |
| 1.09861 | 5.811 |
| 1.09861 | 5.811 |
| 1.09861 | 5.811 |
| 1.09861 | 5.811 |
| 1.09861 | 5.811 |
| 1.09861 | 5.811 |
| 1.09861 | 5.811 |
| 1.09861 | 5.811 |
| 1.09861 | 5.811 |
| 1.09861 | 5.811 |
| 1.09861 | 5.811 |
| 1.09861 | 5.811 |
| 1.09861 | 5.811 |
| 1.09861 | 5.811 |
| 1.09861 | 5.811 |
| 1.09861 | 5.811 |
| 1.09861 | 5.811 |
| 1.09861 | 5.811 |
| 1.09861 | 5.811 |
| 1.09861 | 5.811 |
| 1.09861 | 5.811 |
| 1.09861 | 5.811 |
| 1.09861 | 5.811 |
| 1.09861 | 5.811 |
| 1.09861 | 5.811 |
| 1.09861 | 5.811 |
| 1.09861 | 5.811 |
| 1.09861 | 5.811 |
| 1.09861 | 5.811 |
| 1.09861 | 5.811 |
| 1.09861 | 5.811 |
| 1.09861 | 5.811 |
| 1.09861 | 5.811 |
| 1.09861 | 5.811 |
| 1.09861 | 5.811 |
| 1.09861 | 5.811 |
| 1.09861 | 5.811 |
| 1.09861 | 5.811 |
| 1.09861 | 5.811 |
| 1.09861 | 5.811 |
| 1.09861 | 5.811 |
| 1.09861 | 5.811 |
| 1.09861 | 5.811 |
| 1.09861 | 5.811 |
| 1.09861 | 5.811 |
| 1.09861 | 5.811 |
| 1.09861 | 5.811 |
| 1.09861 | 5.811 |
| 1.09861 | 5.811 |
| 1.09861 | 5.811 |
| 1.09861 | 5.811 |
| 1.09861 | 5.811 |
| 0.69315 | 6.234 |
| 0.69315 | 6.234 |
| 0.69315 | 6.234 |
| 0.69315 | 6.234 |
| 0.69315 | 6.234 |
| 0.69315 | 6.234 |
| 0.69315 | 6.234 |
| 0.69315 | 6.234 |
| 0.69315 | 6.234 |
| 0.69315 | 6.234 |
| 0.69315 | 6.234 |
| 0.69315 | 6.234 |
| 0.69315 | 6.234 |
| 0.69315 | 6.234 |
| 0.69315 | 6.234 |
| 0.69315 | 6.234 |
| 0.69315 | 6.234 |
| 0.69315 | 6.234 |
| 0.69315 | 6.234 |
| 0.69315 | 6.234 |
| 0.69315 | 6.234 |
| 0.69315 | 6.234 |
| 0.69315 | 6.234 |
| 0.69315 | 6.234 |
| 0.69315 | 6.234 |
| 0.69315 | 6.234 |
| 0.69315 | 6.234 |
| 0.69315 | 6.234 |
| 0.69315 | 6.234 |
| 0.69315 | 6.234 |
| 0.69315 | 6.234 |
| 0.69315 | 6.234 |
| 0.69315 | 6.234 |
| 0.69315 | 6.234 |
| 0.69315 | 6.234 |
| 0.69315 | 6.234 |
| 0.69315 | 6.234 |
| 0.69315 | 6.234 |
| 0.69315 | 6.234 |
| 0.69315 | 6.234 |
| 0.69315 | 6.234 |
| 0.69315 | 6.234 |
| 0.69315 | 6.234 |
| 0.69315 | 6.234 |
| 0.69315 | 6.234 |
| 0.69315 | 6.234 |
| 0.69315 | 6.234 |
| 0.69315 | 6.234 |
| 0.69315 | 6.234 |
| 0.69315 | 6.234 |
| 0.69315 | 6.234 |
| 0.69315 | 6.234 |
| 0.69315 | 6.234 |
| 0.69315 | 6.234 |
| 0.69315 | 6.234 |
| 0.69315 | 6.234 |
| 0.69315 | 6.234 |
| 0.69315 | 6.234 |
| 0.69315 | 6.234 |
| 0.69315 | 6.234 |
| 0.69315 | 6.234 |
| 0.69315 | 6.234 |
| 0.69315 | 6.234 |
| 0.69315 | 6.234 |
| 0.69315 | 6.234 |
| 0.69315 | 6.234 |
| 0.69315 | 6.234 |
| 0.69315 | 6.234 |
| 0.69315 | 6.234 |
| 0.69315 | 6.234 |
| 0.69315 | 6.234 |
| 0.69315 | 6.234 |
| 0.69315 | 6.234 |
| 0.69315 | 6.234 |
| 0.69315 | 6.234 |
| 0.69315 | 6.234 |
| 0.69315 | 6.234 |
| 0.69315 | 6.234 |
| 0.69315 | 6.234 |
| 0.69315 | 6.234 |
| 0.69315 | 6.234 |
| 0.69315 | 6.234 |
| 0.69315 | 6.234 |
| 0.69315 | 6.234 |
| 0.69315 | 6.234 |
| 0.69315 | 6.234 |
| 0.69315 | 6.234 |
| 0.69315 | 6.234 |
| 0.69315 | 6.234 |
| 0.69315 | 6.234 |
| 0.69315 | 6.234 |
| 0.69315 | 6.234 |
| 0.69315 | 6.234 |
| 0.69315 | 6.234 |
| 0.69315 | 6.234 |
| 0.69315 | 6.234 |
| 0.69315 | 6.234 |
| 0.69315 | 6.234 |
| 0.69315 | 6.234 |
| 0.69315 | 6.234 |
| 0.69315 | 6.234 |
| 0.69315 | 6.234 |
| 0.69315 | 6.234 |
| 0.69315 | 6.234 |
| 0.69315 | 6.234 |
| 0.69315 | 6.234 |
| 0.69315 | 6.234 |
| 0.69315 | 6.234 |
| 0.69315 | 6.234 |
| 0.69315 | 6.234 |
| 0.69315 | 6.234 |
| 0.69315 | 6.234 |
| 0.69315 | 6.234 |
| 0.69315 | 6.234 |
| 0.69315 | 6.234 |
| 0.69315 | 6.234 |
| 0.69315 | 6.234 |
| 0.69315 | 6.234 |
| 0.69315 | 6.234 |
| 0.69315 | 6.234 |
| 0.69315 | 6.234 |
| 0.69315 | 6.234 |
| 0.69315 | 6.234 |
| 0.69315 | 6.234 |
| 0.69315 | 6.234 |
| 0.69315 | 6.234 |
| 0.69315 | 6.234 |
| 0.69315 | 6.234 |
| 0.69315 | 6.234 |
| 0.69315 | 6.234 |
| 0.69315 | 6.234 |
| 0.69315 | 6.234 |
| 0.69315 | 6.234 |
| 0.69315 | 6.234 |
| 0.69315 | 6.234 |
| 0.69315 | 6.234 |
| 0.69315 | 6.234 |
| 0.69315 | 6.234 |
| 0.69315 | 6.234 |
| 0.69315 | 6.234 |
| 0.69315 | 6.234 |
| 0.69315 | 6.234 |
| 0.69315 | 6.234 |
| 0.69315 | 6.234 |
| 0.69315 | 6.234 |
| 0.69315 | 6.234 |
| 0.69315 | 6.234 |
| 0.69315 | 6.234 |
| 0.69315 | 6.234 |
| 0.69315 | 6.234 |
| 0.69315 | 6.234 |
| 0.69315 | 6.234 |
| 0.69315 | 6.234 |
| 0.69315 | 6.234 |
| 0.69315 | 6.234 |
| 0.69315 | 6.234 |
| 0.69315 | 6.234 |
| 0.69315 | 6.234 |
| 0.69315 | 6.234 |
| 0.69315 | 6.234 |
| 0.69315 | 6.234 |
| 0.69315 | 6.234 |
| 0.69315 | 6.234 |
| 0.69315 | 6.234 |
| 0.69315 | 6.234 |
| 0.69315 | 6.234 |
| 0.69315 | 6.234 |
| 0.69315 | 6.234 |
| 0.69315 | 6.234 |
| 0.69315 | 6.234 |
| 0.69315 | 6.234 |
| 0.69315 | 6.234 |
| 0.69315 | 6.234 |
| 0.69315 | 6.234 |
| 0.69315 | 6.234 |
| 0.69315 | 6.234 |
| 0.69315 | 6.234 |
| 0.69315 | 6.234 |
| 0.69315 | 6.234 |
| 0.69315 | 6.234 |
| 0.69315 | 6.234 |
| 0.69315 | 6.234 |
| 0.69315 | 6.234 |
| 0.69315 | 6.234 |
| 0.69315 | 6.234 |
| 0.69315 | 6.234 |
| 0.69315 | 6.234 |
| 0.69315 | 6.234 |
| 0.69315 | 6.234 |
| 0.69315 | 6.234 |
| 0.69315 | 6.234 |
| 0.69315 | 6.234 |
| 0.69315 | 6.234 |
| 0.69315 | 6.234 |
| 0.69315 | 6.234 |
| 0.69315 | 6.234 |
| 0.69315 | 6.234 |
| 0.69315 | 6.234 |
| 0.69315 | 6.234 |
| 0.69315 | 6.234 |
| 0.69315 | 6.234 |
| 0.69315 | 6.234 |
| 0.69315 | 6.234 |
| 0.69315 | 6.234 |
| 0.69315 | 6.234 |
| 0.69315 | 6.234 |
| 0.69315 | 6.234 |
| 0.69315 | 6.234 |
| 0.69315 | 6.234 |
| 0.69315 | 6.234 |
| 0.69315 | 6.234 |
| 0.69315 | 6.234 |
| 0.69315 | 6.234 |
| 0.69315 | 6.234 |
| 0.69315 | 6.234 |
| 0.69315 | 6.234 |
| 0.69315 | 6.234 |
| 0.69315 | 6.234 |
| 0.69315 | 6.234 |
| 0.69315 | 6.234 |
| 0.69315 | 6.234 |
| 0.69315 | 6.234 |
| 0.69315 | 6.234 |
| 0.69315 | 6.234 |
| 0.69315 | 6.234 |
| 0.69315 | 6.234 |
| 0.69315 | 6.234 |
| 0.69315 | 6.234 |
| 0.69315 | 6.234 |
| 0.69315 | 6.234 |
| 0.69315 | 6.234 |
| 0.69315 | 6.234 |
| 0.69315 | 6.234 |
| 0.69315 | 6.234 |
| 0.69315 | 6.234 |
| 0.69315 | 6.234 |
| 0.69315 | 6.234 |
| 0.69315 | 6.234 |
| 0.69315 | 6.234 |
| 0.69315 | 6.234 |
| 0.69315 | 6.234 |
| 0.69315 | 6.234 |
| 0.69315 | 6.234 |
| 0.69315 | 6.234 |
| 0.69315 | 6.234 |
| 0.69315 | 6.234 |
| 0.69315 | 6.234 |
| 0.69315 | 6.234 |
| 0.69315 | 6.234 |
| 0.69315 | 6.234 |
| 0.69315 | 6.234 |
| 0.69315 | 6.234 |
| 0.69315 | 6.234 |
| 0.69315 | 6.234 |
| 0.69315 | 6.234 |
| 0.69315 | 6.234 |
| 0.69315 | 6.234 |
| 0.69315 | 6.234 |
| 0.69315 | 6.234 |
| 0.69315 | 6.234 |
| 0.69315 | 6.234 |
| 0.69315 | 6.234 |
| 0.69315 | 6.234 |
| 0.69315 | 6.234 |
| 0.69315 | 6.234 |
| 0.69315 | 6.234 |
| 0.69315 | 6.234 |
| 0.69315 | 6.234 |
| 0.69315 | 6.234 |
| 0.69315 | 6.234 |
| 0.69315 | 6.234 |
| 0.69315 | 6.234 |
| 0.69315 | 6.234 |
| 0.69315 | 6.234 |
| 0.69315 | 6.234 |
| 0.69315 | 6.234 |
| 0.69315 | 6.234 |
| 0.69315 | 6.234 |
| 0.69315 | 6.234 |
| 0.69315 | 6.234 |
| 0.69315 | 6.234 |
| 0.69315 | 6.234 |
| 0.69315 | 6.234 |
| 0.69315 | 6.234 |
| 0.69315 | 6.234 |
| 0.69315 | 6.234 |
| 0.69315 | 6.234 |
| 0.69315 | 6.234 |
| 0.69315 | 6.234 |
| 0.69315 | 6.234 |
| 0.69315 | 6.234 |
| 0.69315 | 6.234 |
| 0.69315 | 6.234 |
| 0.69315 | 6.234 |
| 0.69315 | 6.234 |
| 0.69315 | 6.234 |
| 0.69315 | 6.234 |
| 0.69315 | 6.234 |
| 0.69315 | 6.234 |
| 0.69315 | 6.234 |
| 0.69315 | 6.234 |
| 0.69315 | 6.234 |
| 0.69315 | 6.234 |
| 0.69315 | 6.234 |
| 0.69315 | 6.234 |
| 0.69315 | 6.234 |
| 0.69315 | 6.234 |
| 0.69315 | 6.234 |
| 0.69315 | 6.234 |
| 0.69315 | 6.234 |
| 0.69315 | 6.234 |
| 0.69315 | 6.234 |
| 0.69315 | 6.234 |
| 0.69315 | 6.234 |
| 0.69315 | 6.234 |
| 0.69315 | 6.234 |
| 0.69315 | 6.234 |
| 0.69315 | 6.234 |
| 0.69315 | 6.234 |
| 0.69315 | 6.234 |
| 0.69315 | 6.234 |
| 0.69315 | 6.234 |
| 0.69315 | 6.234 |
| 0.69315 | 6.234 |
| 0.69315 | 6.234 |
| 0.69315 | 6.234 |
| 0.69315 | 6.234 |
| 0.69315 | 6.234 |
| 0.69315 | 6.234 |
| 0.69315 | 6.234 |
| 0.69315 | 6.234 |
| 0.69315 | 6.234 |
| 0.69315 | 6.234 |
| 0.69315 | 6.234 |
| 0.69315 | 6.234 |
| 0.69315 | 6.234 |
| 0.69315 | 6.234 |
| 0.69315 | 6.234 |
| 0.69315 | 6.234 |
| 0.69315 | 6.234 |
| 0.69315 | 6.234 |
| 0.69315 | 6.234 |
| 0.69315 | 6.234 |
| 0.69315 | 6.234 |
| 0.69315 | 6.234 |
| 0.69315 | 6.234 |
| 0.69315 | 6.234 |
| 0.69315 | 6.234 |
| 0.69315 | 6.234 |
| 0.69315 | 6.234 |
| 0.69315 | 6.234 |
| 0.69315 | 6.234 |
| 0.69315 | 6.234 |
| 0.69315 | 6.234 |
| 0.69315 | 6.234 |
| 0.69315 | 6.234 |
| 0.69315 | 6.234 |
| 0.69315 | 6.234 |
| 0.69315 | 6.234 |
| 0.69315 | 6.234 |
| 0.69315 | 6.234 |
| 0.69315 | 6.234 |
| 0.69315 | 6.234 |
| 0.69315 | 6.234 |
| 0.69315 | 6.234 |
| 0.69315 | 6.234 |
| 0.69315 | 6.234 |
| 0.69315 | 6.234 |
| 0.69315 | 6.234 |
| 0.69315 | 6.234 |
| 0.69315 | 6.234 |
| 0.69315 | 6.234 |
| 0.69315 | 6.234 |
| 0.69315 | 6.234 |
| 0.69315 | 6.234 |
| 0.69315 | 6.234 |
| 0.69315 | 6.234 |
| 0.69315 | 6.234 |
| 0.69315 | 6.234 |
| 0.69315 | 6.234 |
| 0.69315 | 6.234 |
| 0.69315 | 6.234 |
| 0.69315 | 6.234 |
| 0.69315 | 6.234 |
| 0.69315 | 6.234 |
| 0.69315 | 6.234 |
| 0.69315 | 6.234 |
| 0.69315 | 6.234 |
| 0.69315 | 6.234 |
| 0.69315 | 6.234 |
| 0.69315 | 6.234 |
| 0.69315 | 6.234 |
| 0.69315 | 6.234 |
| 0.69315 | 6.234 |
| 0.69315 | 6.234 |
| 0.69315 | 6.234 |
| 0.69315 | 6.234 |
| 0.69315 | 6.234 |
| 0.69315 | 6.234 |
| 0.69315 | 6.234 |
| 0.69315 | 6.234 |
| 0.69315 | 6.234 |
| 0.69315 | 6.234 |
| 0.69315 | 6.234 |
| 0.69315 | 6.234 |
| 0.69315 | 6.234 |
| 0.69315 | 6.234 |
| 0.69315 | 6.234 |
| 0.69315 | 6.234 |
| 0.69315 | 6.234 |
| 0.69315 | 6.234 |
| 0.69315 | 6.234 |
| 0.69315 | 6.234 |
| 0.69315 | 6.234 |
| 0.69315 | 6.234 |
| 0.69315 | 6.234 |
| 0.69315 | 6.234 |
| 0.69315 | 6.234 |
| 0.69315 | 6.234 |
| 0.69315 | 6.234 |
| 0.69315 | 6.234 |
| 0.69315 | 6.234 |
| 0.69315 | 6.234 |
| 0.69315 | 6.234 |
| 0.69315 | 6.234 |
| 0.69315 | 6.234 |
| 0.69315 | 6.234 |
| 0.69315 | 6.234 |
| 0.69315 | 6.234 |
| 0.69315 | 6.234 |
| 0.69315 | 6.234 |
| 0.69315 | 6.234 |
| 0.69315 | 6.234 |
| 0.69315 | 6.234 |
| 0.69315 | 6.234 |
| 0.69315 | 6.234 |
| 0.69315 | 6.234 |
| 0.69315 | 6.234 |
| 0.69315 | 6.234 |
| 0.69315 | 6.234 |
| 0.69315 | 6.234 |
| 0.69315 | 6.234 |
| 0.69315 | 6.234 |
| 0.69315 | 6.234 |
| 0.69315 | 6.234 |
| 0.69315 | 6.234 |
| 0.69315 | 6.234 |
| 0.69315 | 6.234 |
| 0.69315 | 6.234 |
| 0.69315 | 6.234 |
| 0.69315 | 6.234 |
| 0.69315 | 6.234 |
| 0.69315 | 6.234 |
| 0.69315 | 6.234 |
| 0.69315 | 6.234 |
| 0.69315 | 6.234 |
| 0.69315 | 6.234 |
| 0.69315 | 6.234 |
| 0.69315 | 6.234 |
| 0.69315 | 6.234 |
| 0.69315 | 6.234 |
| 0.69315 | 6.234 |
| 0.69315 | 6.234 |
| 0.69315 | 6.234 |
| 0.69315 | 6.234 |
| 0.69315 | 6.234 |
| 0.69315 | 6.234 |
| 0.69315 | 6.234 |
| 0.69315 | 6.234 |
| 0.69315 | 6.234 |
| 0.69315 | 6.234 |
| 0.69315 | 6.234 |
| 0.69315 | 6.234 |
| 0.69315 | 6.234 |
| 0.69315 | 6.234 |
| 0.69315 | 6.234 |
| 0.69315 | 6.234 |
| 0.69315 | 6.234 |
| 0.69315 | 6.234 |
| 0.69315 | 6.234 |
| 0.69315 | 6.234 |
| 0.69315 | 6.234 |
| 0.69315 | 6.234 |
| 0.69315 | 6.234 |
| 0.69315 | 6.234 |
| 0.69315 | 6.234 |
| 0.69315 | 6.234 |
| 0.69315 | 6.234 |
| 0.69315 | 6.234 |
| 0.69315 | 6.234 |
| 0.69315 | 6.234 |
| 0.69315 | 6.234 |
| 0.69315 | 6.234 |
| 0.69315 | 6.234 |
| 0.69315 | 6.234 |
| 0.69315 | 6.234 |
| 0.69315 | 6.234 |
| 0.69315 | 6.234 |
| 0.69315 | 6.234 |
| 0.69315 | 6.234 |
| 0.69315 | 6.234 |
| 0.69315 | 6.234 |
| 0.69315 | 6.234 |
| 0.69315 | 6.234 |
| 0.69315 | 6.234 |
| 0.69315 | 6.234 |
| 0.69315 | 6.234 |
| 0.69315 | 6.234 |
| 0.69315 | 6.234 |
| 0.69315 | 6.234 |
| 0.0 | 7.283 |
| 0.0 | 7.283 |
| 0.0 | 7.283 |
| 0.0 | 7.283 |
| 0.0 | 7.283 |
| 0.0 | 7.283 |
| 0.0 | 7.283 |
| 0.0 | 7.283 |
| 0.0 | 7.283 |
| 0.0 | 7.283 |
| 0.0 | 7.283 |
| 0.0 | 7.283 |
| 0.0 | 7.283 |
| 0.0 | 7.283 |
| 0.0 | 7.283 |
| 0.0 | 7.283 |
| 0.0 | 7.283 |
| 0.0 | 7.283 |
| 0.0 | 7.283 |
| 0.0 | 7.283 |
| 0.0 | 7.283 |
| 0.0 | 7.283 |
| 0.0 | 7.283 |
| 0.0 | 7.283 |
| 0.0 | 7.283 |
| 0.0 | 7.283 |
| 0.0 | 7.283 |
| 0.0 | 7.283 |
| 0.0 | 7.283 |
| 0.0 | 7.283 |
| 0.0 | 7.283 |
| 0.0 | 7.283 |
| 0.0 | 7.283 |
| 0.0 | 7.283 |
| 0.0 | 7.283 |
| 0.0 | 7.283 |
| 0.0 | 7.283 |
| 0.0 | 7.283 |
| 0.0 | 7.283 |
| 0.0 | 7.283 |
| 0.0 | 7.283 |
| 0.0 | 7.283 |
| 0.0 | 7.283 |
| 0.0 | 7.283 |
| 0.0 | 7.283 |
| 0.0 | 7.283 |
| 0.0 | 7.283 |
| 0.0 | 7.283 |
| 0.0 | 7.283 |
| 0.0 | 7.283 |
| 0.0 | 7.283 |
| 0.0 | 7.283 |
| 0.0 | 7.283 |
| 0.0 | 7.283 |
| 0.0 | 7.283 |
| 0.0 | 7.283 |
| 0.0 | 7.283 |
| 0.0 | 7.283 |
| 0.0 | 7.283 |
| 0.0 | 7.283 |
| 0.0 | 7.283 |
| 0.0 | 7.283 |
| 0.0 | 7.283 |
| 0.0 | 7.283 |
| 0.0 | 7.283 |
| 0.0 | 7.283 |
| 0.0 | 7.283 |
| 0.0 | 7.283 |
| 0.0 | 7.283 |
| 0.0 | 7.283 |
| 0.0 | 7.283 |
| 0.0 | 7.283 |
| 0.0 | 7.283 |
| 0.0 | 7.283 |
| 0.0 | 7.283 |
| 0.0 | 7.283 |
| 0.0 | 7.283 |
| 0.0 | 7.283 |
| 0.0 | 7.283 |
| 0.0 | 7.283 |
| 0.0 | 7.283 |
| 0.0 | 7.283 |
| 0.0 | 7.283 |
| 0.0 | 7.283 |
| 0.0 | 7.283 |
| 0.0 | 7.283 |
| 0.0 | 7.283 |
| 0.0 | 7.283 |
| 0.0 | 7.283 |
| 0.0 | 7.283 |
| 0.0 | 7.283 |
| 0.0 | 7.283 |
| 0.0 | 7.283 |
| 0.0 | 7.283 |
| 0.0 | 7.283 |
| 0.0 | 7.283 |
| 0.0 | 7.283 |
| 0.0 | 7.283 |
| 0.0 | 7.283 |
| 0.0 | 7.283 |
| 0.0 | 7.283 |
| 0.0 | 7.283 |
| 0.0 | 7.283 |
| 0.0 | 7.283 |
| 0.0 | 7.283 |
| 0.0 | 7.283 |
| 0.0 | 7.283 |
| 0.0 | 7.283 |
| 0.0 | 7.283 |
| 0.0 | 7.283 |
| 0.0 | 7.283 |
| 0.0 | 7.283 |
| 0.0 | 7.283 |
| 0.0 | 7.283 |
| 0.0 | 7.283 |
| 0.0 | 7.283 |
| 0.0 | 7.283 |
| 0.0 | 7.283 |
| 0.0 | 7.283 |
| 0.0 | 7.283 |
| 0.0 | 7.283 |
| 0.0 | 7.283 |
| 0.0 | 7.283 |
| 0.0 | 7.283 |
| 0.0 | 7.283 |
| 0.0 | 7.283 |
| 0.0 | 7.283 |
| 0.0 | 7.283 |
| 0.0 | 7.283 |
| 0.0 | 7.283 |
| 0.0 | 7.283 |
| 0.0 | 7.283 |
| 0.0 | 7.283 |
| 0.0 | 7.283 |
| 0.0 | 7.283 |
| 0.0 | 7.283 |
| 0.0 | 7.283 |
| 0.0 | 7.283 |
| 0.0 | 7.283 |
| 0.0 | 7.283 |
| 0.0 | 7.283 |
| 0.0 | 7.283 |
| 0.0 | 7.283 |
| 0.0 | 7.283 |
| 0.0 | 7.283 |
| 0.0 | 7.283 |
| 0.0 | 7.283 |
| 0.0 | 7.283 |
| 0.0 | 7.283 |
| 0.0 | 7.283 |
| 0.0 | 7.283 |
| 0.0 | 7.283 |
| 0.0 | 7.283 |
| 0.0 | 7.283 |
| 0.0 | 7.283 |
| 0.0 | 7.283 |
| 0.0 | 7.283 |
| 0.0 | 7.283 |
| 0.0 | 7.283 |
| 0.0 | 7.283 |
| 0.0 | 7.283 |
| 0.0 | 7.283 |
| 0.0 | 7.283 |
| 0.0 | 7.283 |
| 0.0 | 7.283 |
| 0.0 | 7.283 |
| 0.0 | 7.283 |
| 0.0 | 7.283 |
| 0.0 | 7.283 |
| 0.0 | 7.283 |
| 0.0 | 7.283 |
| 0.0 | 7.283 |
| 0.0 | 7.283 |
| 0.0 | 7.283 |
| 0.0 | 7.283 |
| 0.0 | 7.283 |
| 0.0 | 7.283 |
| 0.0 | 7.283 |
| 0.0 | 7.283 |
| 0.0 | 7.283 |
| 0.0 | 7.283 |
| 0.0 | 7.283 |
| 0.0 | 7.283 |
| 0.0 | 7.283 |
| 0.0 | 7.283 |
| 0.0 | 7.283 |
| 0.0 | 7.283 |
| 0.0 | 7.283 |
| 0.0 | 7.283 |
| 0.0 | 7.283 |
| 0.0 | 7.283 |
| 0.0 | 7.283 |
| 0.0 | 7.283 |
| 0.0 | 7.283 |
| 0.0 | 7.283 |
| 0.0 | 7.283 |
| 0.0 | 7.283 |
| 0.0 | 7.283 |
| 0.0 | 7.283 |
| 0.0 | 7.283 |
| 0.0 | 7.283 |
| 0.0 | 7.283 |
| 0.0 | 7.283 |
| 0.0 | 7.283 |
| 0.0 | 7.283 |
| 0.0 | 7.283 |
| 0.0 | 7.283 |
| 0.0 | 7.283 |
| 0.0 | 7.283 |
| 0.0 | 7.283 |
| 0.0 | 7.283 |
| 0.0 | 7.283 |
| 0.0 | 7.283 |
| 0.0 | 7.283 |
| 0.0 | 7.283 |
| 0.0 | 7.283 |
| 0.0 | 7.283 |
| 0.0 | 7.283 |
| 0.0 | 7.283 |
| 0.0 | 7.283 |
| 0.0 | 7.283 |
| 0.0 | 7.283 |
| 0.0 | 7.283 |
| 0.0 | 7.283 |
| 0.0 | 7.283 |
| 0.0 | 7.283 |
| 0.0 | 7.283 |
| 0.0 | 7.283 |
| 0.0 | 7.283 |
| 0.0 | 7.283 |
| 0.0 | 7.283 |
| 0.0 | 7.283 |
| 0.0 | 7.283 |
| 0.0 | 7.283 |
| 0.0 | 7.283 |
| 0.0 | 7.283 |
| 0.0 | 7.283 |
| 0.0 | 7.283 |
| 0.0 | 7.283 |
| 0.0 | 7.283 |
| 0.0 | 7.283 |
| 0.0 | 7.283 |
| 0.0 | 7.283 |
| 0.0 | 7.283 |
| 0.0 | 7.283 |
| 0.0 | 7.283 |
| 0.0 | 7.283 |
| 0.0 | 7.283 |
| 0.0 | 7.283 |
| 0.0 | 7.283 |
| 0.0 | 7.283 |
| 0.0 | 7.283 |
| 0.0 | 7.283 |
| 0.0 | 7.283 |
| 0.0 | 7.283 |
| 0.0 | 7.283 |
| 0.0 | 7.283 |
| 0.0 | 7.283 |
| 0.0 | 7.283 |
| 0.0 | 7.283 |
| 0.0 | 7.283 |
| 0.0 | 7.283 |
| 0.0 | 7.283 |
| 0.0 | 7.283 |
| 0.0 | 7.283 |
| 0.0 | 7.283 |
| 0.0 | 7.283 |
| 0.0 | 7.283 |
| 0.0 | 7.283 |
| 0.0 | 7.283 |
| 0.0 | 7.283 |
| 0.0 | 7.283 |
| 0.0 | 7.283 |
| 0.0 | 7.283 |
| 0.0 | 7.283 |
| 0.0 | 7.283 |
| 0.0 | 7.283 |
| 0.0 | 7.283 |
| 0.0 | 7.283 |
| 0.0 | 7.283 |
| 0.0 | 7.283 |
| 0.0 | 7.283 |
| 0.0 | 7.283 |
| 0.0 | 7.283 |
| 0.0 | 7.283 |
| 0.0 | 7.283 |
| 0.0 | 7.283 |
| 0.0 | 7.283 |
| 0.0 | 7.283 |
| 0.0 | 7.283 |
| 0.0 | 7.283 |
| 0.0 | 7.283 |
| 0.0 | 7.283 |
| 0.0 | 7.283 |
| 0.0 | 7.283 |
| 0.0 | 7.283 |
| 0.0 | 7.283 |
| 0.0 | 7.283 |
| 0.0 | 7.283 |
| 0.0 | 7.283 |
| 0.0 | 7.283 |
| 0.0 | 7.283 |
| 0.0 | 7.283 |
| 0.0 | 7.283 |
| 0.0 | 7.283 |
| 0.0 | 7.283 |
| 0.0 | 7.283 |
| 0.0 | 7.283 |
| 0.0 | 7.283 |
| 0.0 | 7.283 |
| 0.0 | 7.283 |
| 0.0 | 7.283 |
| 0.0 | 7.283 |
| 0.0 | 7.283 |
| 0.0 | 7.283 |
| 0.0 | 7.283 |
| 0.0 | 7.283 |
| 0.0 | 7.283 |
| 0.0 | 7.283 |
| 0.0 | 7.283 |
| 0.0 | 7.283 |
| 0.0 | 7.283 |
| 0.0 | 7.283 |
| 0.0 | 7.283 |
| 0.0 | 7.283 |
| 0.0 | 7.283 |
| 0.0 | 7.283 |
| 0.0 | 7.283 |
| 0.0 | 7.283 |
| 0.0 | 7.283 |
| 0.0 | 7.283 |
| 0.0 | 7.283 |
| 0.0 | 7.283 |
| 0.0 | 7.283 |
| 0.0 | 7.283 |
| 0.0 | 7.283 |
| 0.0 | 7.283 |
| 0.0 | 7.283 |
| 0.0 | 7.283 |
| 0.0 | 7.283 |
| 0.0 | 7.283 |
| 0.0 | 7.283 |
| 0.0 | 7.283 |
| 0.0 | 7.283 |
| 0.0 | 7.283 |
| 0.0 | 7.283 |
| 0.0 | 7.283 |
| 0.0 | 7.283 |
| 0.0 | 7.283 |
| 0.0 | 7.283 |
| 0.0 | 7.283 |
| 0.0 | 7.283 |
| 0.0 | 7.283 |
| 0.0 | 7.283 |
| 0.0 | 7.283 |
| 0.0 | 7.283 |
| 0.0 | 7.283 |
| 0.0 | 7.283 |
| 0.0 | 7.283 |
| 0.0 | 7.283 |
| 0.0 | 7.283 |
| 0.0 | 7.283 |
| 0.0 | 7.283 |
| 0.0 | 7.283 |
| 0.0 | 7.283 |
| 0.0 | 7.283 |
| 0.0 | 7.283 |
| 0.0 | 7.283 |
| 0.0 | 7.283 |
| 0.0 | 7.283 |
| 0.0 | 7.283 |
| 0.0 | 7.283 |
| 0.0 | 7.283 |
| 0.0 | 7.283 |
| 0.0 | 7.283 |
| 0.0 | 7.283 |
| 0.0 | 7.283 |
| 0.0 | 7.283 |
| 0.0 | 7.283 |
| 0.0 | 7.283 |
| 0.0 | 7.283 |
| 0.0 | 7.283 |
| 0.0 | 7.283 |
| 0.0 | 7.283 |
| 0.0 | 7.283 |
| 0.0 | 7.283 |
| 0.0 | 7.283 |
| 0.0 | 7.283 |
| 0.0 | 7.283 |
| 0.0 | 7.283 |
| 0.0 | 7.283 |
| 0.0 | 7.283 |
| 0.0 | 7.283 |
| 0.0 | 7.283 |
| 0.0 | 7.283 |
| 0.0 | 7.283 |
| 0.0 | 7.283 |
| 0.0 | 7.283 |
| 0.0 | 7.283 |
| 0.0 | 7.283 |
| 0.0 | 7.283 |
| 0.0 | 7.283 |
| 0.0 | 7.283 |
| 0.0 | 7.283 |
| 0.0 | 7.283 |
| 0.0 | 7.283 |
| 0.0 | 7.283 |
| 0.0 | 7.283 |
| 0.0 | 7.283 |
| 0.0 | 7.283 |
| 0.0 | 7.283 |
| 0.0 | 7.283 |
| 0.0 | 7.283 |
| 0.0 | 7.283 |
| 0.0 | 7.283 |
| 0.0 | 7.283 |
| 0.0 | 7.283 |
| 0.0 | 7.283 |
| 0.0 | 7.283 |
| 0.0 | 7.283 |
| 0.0 | 7.283 |
| 0.0 | 7.283 |
| 0.0 | 7.283 |
| 0.0 | 7.283 |
| 0.0 | 7.283 |
| 0.0 | 7.283 |
| 0.0 | 7.283 |
| 0.0 | 7.283 |
| 0.0 | 7.283 |
| 0.0 | 7.283 |
| 0.0 | 7.283 |
| 0.0 | 7.283 |
| 0.0 | 7.283 |
| 0.0 | 7.283 |
| 0.0 | 7.283 |
| 0.0 | 7.283 |
| 0.0 | 7.283 |
| 0.0 | 7.283 |
| 0.0 | 7.283 |
| 0.0 | 7.283 |
| 0.0 | 7.283 |
| 0.0 | 7.283 |
| 0.0 | 7.283 |
| 0.0 | 7.283 |
| 0.0 | 7.283 |
| 0.0 | 7.283 |
| 0.0 | 7.283 |
| 0.0 | 7.283 |
| 0.0 | 7.283 |
| 0.0 | 7.283 |
| 0.0 | 7.283 |
| 0.0 | 7.283 |
| 0.0 | 7.283 |
| 0.0 | 7.283 |
| 0.0 | 7.283 |
| 0.0 | 7.283 |
| 0.0 | 7.283 |
| 0.0 | 7.283 |
| 0.0 | 7.283 |
| 0.0 | 7.283 |
| 0.0 | 7.283 |
| 0.0 | 7.283 |
| 0.0 | 7.283 |
| 0.0 | 7.283 |
| 0.0 | 7.283 |
| 0.0 | 7.283 |
| 0.0 | 7.283 |
| 0.0 | 7.283 |
| 0.0 | 7.283 |
| 0.0 | 7.283 |
| 0.0 | 7.283 |
| 0.0 | 7.283 |
| 0.0 | 7.283 |
| 0.0 | 7.283 |
| 0.0 | 7.283 |
| 0.0 | 7.283 |
| 0.0 | 7.283 |
| 0.0 | 7.283 |
| 0.0 | 7.283 |
| 0.0 | 7.283 |
| 0.0 | 7.283 |
| 0.0 | 7.283 |
| 0.0 | 7.283 |
| 0.0 | 7.283 |
| 0.0 | 7.283 |
| 0.0 | 7.283 |
| 0.0 | 7.283 |
| 0.0 | 7.283 |
| 0.0 | 7.283 |
| 0.0 | 7.283 |
| 0.0 | 7.283 |
| 0.0 | 7.283 |
| 0.0 | 7.283 |
| 0.0 | 7.283 |
| 0.0 | 7.283 |
| 0.0 | 7.283 |
| 0.0 | 7.283 |
| 0.0 | 7.283 |
| 0.0 | 7.283 |
| 0.0 | 7.283 |
| 0.0 | 7.283 |
| 0.0 | 7.283 |
| 0.0 | 7.283 |
| 0.0 | 7.283 |
| 0.0 | 7.283 |
| 0.0 | 7.283 |
| 0.0 | 7.283 |
| 0.0 | 7.283 |
| 0.0 | 7.283 |
| 0.0 | 7.283 |
| 0.0 | 7.283 |
| 0.0 | 7.283 |
| 0.0 | 7.283 |
| 0.0 | 7.283 |
| 0.0 | 7.283 |
| 0.0 | 7.283 |
| 0.0 | 7.283 |
| 0.0 | 7.283 |
| 0.0 | 7.283 |
| 0.0 | 7.283 |
| 0.0 | 7.283 |
| 0.0 | 7.283 |
| 0.0 | 7.283 |
| 0.0 | 7.283 |
| 0.0 | 7.283 |
| 0.0 | 7.283 |
| 0.0 | 7.283 |
| 0.0 | 7.283 |
| 0.0 | 7.283 |
| 0.0 | 7.283 |
| 0.0 | 7.283 |
| 0.0 | 7.283 |
| 0.0 | 7.283 |
| 0.0 | 7.283 |
| 0.0 | 7.283 |
| 0.0 | 7.283 |
| 0.0 | 7.283 |
| 0.0 | 7.283 |
| 0.0 | 7.283 |
| 0.0 | 7.283 |
| 0.0 | 7.283 |
| 0.0 | 7.283 |
| 0.0 | 7.283 |
| 0.0 | 7.283 |
| 0.0 | 7.283 |
| 0.0 | 7.283 |
| 0.0 | 7.283 |
| 0.0 | 7.283 |
| 0.0 | 7.283 |
| 0.0 | 7.283 |
| 0.0 | 7.283 |
| 0.0 | 7.283 |
| 0.0 | 7.283 |
| 0.0 | 7.283 |
| 0.0 | 7.283 |
| 0.0 | 7.283 |
| 0.0 | 7.283 |
| 0.0 | 7.283 |
| 0.0 | 7.283 |
| 0.0 | 7.283 |
| 0.0 | 7.283 |
| 0.0 | 7.283 |
| 0.0 | 7.283 |
| 0.0 | 7.283 |
| 0.0 | 7.283 |
| 0.0 | 7.283 |
| 0.0 | 7.283 |
| 0.0 | 7.283 |
| 0.0 | 7.283 |
| 0.0 | 7.283 |
| 0.0 | 7.283 |
| 0.0 | 7.283 |
| 0.0 | 7.283 |
| 0.0 | 7.283 |
| 0.0 | 7.283 |
| 0.0 | 7.283 |
| 0.0 | 7.283 |
| 0.0 | 7.283 |
| 0.0 | 7.283 |
| 0.0 | 7.283 |
| 0.0 | 7.283 |
| 0.0 | 7.283 |
| 0.0 | 7.283 |
| 0.0 | 7.283 |
| 0.0 | 7.283 |
| 0.0 | 7.283 |
| 0.0 | 7.283 |
| 0.0 | 7.283 |
| 0.0 | 7.283 |
| 0.0 | 7.283 |
| 0.0 | 7.283 |
| 0.0 | 7.283 |
| 0.0 | 7.283 |
| 0.0 | 7.283 |
| 0.0 | 7.283 |
| 0.0 | 7.283 |
| 0.0 | 7.283 |
| 0.0 | 7.283 |
| 0.0 | 7.283 |
| 0.0 | 7.283 |
| 0.0 | 7.283 |
| 0.0 | 7.283 |
| 0.0 | 7.283 |
| 0.0 | 7.283 |
| 0.0 | 7.283 |
| 0.0 | 7.283 |
| 0.0 | 7.283 |
| 0.0 | 7.283 |
| 0.0 | 7.283 |
| 0.0 | 7.283 |
| 0.0 | 7.283 |
| 0.0 | 7.283 |
| 0.0 | 7.283 |
| 0.0 | 7.283 |
| 0.0 | 7.283 |
| 0.0 | 7.283 |
| 0.0 | 7.283 |
| 0.0 | 7.283 |
| 0.0 | 7.283 |
| 0.0 | 7.283 |
| 0.0 | 7.283 |
| 0.0 | 7.283 |
| 0.0 | 7.283 |
| 0.0 | 7.283 |
| 0.0 | 7.283 |
| 0.0 | 7.283 |
| 0.0 | 7.283 |
| 0.0 | 7.283 |
| 0.0 | 7.283 |
| 0.0 | 7.283 |
| 0.0 | 7.283 |
| 0.0 | 7.283 |
| 0.0 | 7.283 |
| 0.0 | 7.283 |
| 0.0 | 7.283 |
| 0.0 | 7.283 |
| 0.0 | 7.283 |
| 0.0 | 7.283 |
| 0.0 | 7.283 |
| 0.0 | 7.283 |
| 0.0 | 7.283 |
| 0.0 | 7.283 |
| 0.0 | 7.283 |
| 0.0 | 7.283 |
| 0.0 | 7.283 |
| 0.0 | 7.283 |
| 0.0 | 7.283 |
| 0.0 | 7.283 |
| 0.0 | 7.283 |
| 0.0 | 7.283 |
| 0.0 | 7.283 |
| 0.0 | 7.283 |
| 0.0 | 7.283 |
| 0.0 | 7.283 |
| 0.0 | 7.283 |
| 0.0 | 7.283 |
| 0.0 | 7.283 |
| 0.0 | 7.283 |
| 0.0 | 7.283 |
| 0.0 | 7.283 |
| 0.0 | 7.283 |
| 0.0 | 7.283 |
| 0.0 | 7.283 |
| 0.0 | 7.283 |
| 0.0 | 7.283 |
| 0.0 | 7.283 |
| 0.0 | 7.283 |
| 0.0 | 7.283 |
| 0.0 | 7.283 |
| 0.0 | 7.283 |
| 0.0 | 7.283 |
| 0.0 | 7.283 |
| 0.0 | 7.283 |
| 0.0 | 7.283 |
| 0.0 | 7.283 |
| 0.0 | 7.283 |
| 0.0 | 7.283 |
| 0.0 | 7.283 |
| 0.0 | 7.283 |
| 0.0 | 7.283 |
| 0.0 | 7.283 |
| 0.0 | 7.283 |
| 0.0 | 7.283 |
| 0.0 | 7.283 |
| 0.0 | 7.283 |
| 0.0 | 7.283 |
| 0.0 | 7.283 |
| 0.0 | 7.283 |
| 0.0 | 7.283 |
| 0.0 | 7.283 |
| 0.0 | 7.283 |
| 0.0 | 7.283 |
| 0.0 | 7.283 |
| 0.0 | 7.283 |
| 0.0 | 7.283 |
| 0.0 | 7.283 |
| 0.0 | 7.283 |
| 0.0 | 7.283 |
| 0.0 | 7.283 |
| 0.0 | 7.283 |
| 0.0 | 7.283 |
| 0.0 | 7.283 |
| 0.0 | 7.283 |
| 0.0 | 7.283 |
| 0.0 | 7.283 |
| 0.0 | 7.283 |
| 0.0 | 7.283 |
| 0.0 | 7.283 |
| 0.0 | 7.283 |
| 0.0 | 7.283 |
| 0.0 | 7.283 |
| 0.0 | 7.283 |
| 0.0 | 7.283 |
| 0.0 | 7.283 |
| 0.0 | 7.283 |
| 0.0 | 7.283 |
| 0.0 | 7.283 |
| 0.0 | 7.283 |
| 0.0 | 7.283 |
| 0.0 | 7.283 |
| 0.0 | 7.283 |
| 0.0 | 7.283 |
| 0.0 | 7.283 |
| 0.0 | 7.283 |
| 0.0 | 7.283 |
| 0.0 | 7.283 |
| 0.0 | 7.283 |
| 0.0 | 7.283 |
| 0.0 | 7.283 |
| 0.0 | 7.283 |
| 0.0 | 7.283 |
| 0.0 | 7.283 |
| 0.0 | 7.283 |
| 0.0 | 7.283 |
| 0.0 | 7.283 |
| 0.0 | 7.283 |
| 0.0 | 7.283 |
| 0.0 | 7.283 |
| 0.0 | 7.283 |
| 0.0 | 7.283 |
| 0.0 | 7.283 |
| 0.0 | 7.283 |
| 0.0 | 7.283 |
| 0.0 | 7.283 |
| 0.0 | 7.283 |
| 0.0 | 7.283 |
| 0.0 | 7.283 |
| 0.0 | 7.283 |
| 0.0 | 7.283 |
| 0.0 | 7.283 |
| 0.0 | 7.283 |
| 0.0 | 7.283 |
| 0.0 | 7.283 |
| 0.0 | 7.283 |
| 0.0 | 7.283 |
| 0.0 | 7.283 |
| 0.0 | 7.283 |
| 0.0 | 7.283 |
| 0.0 | 7.283 |
| 0.0 | 7.283 |
| 0.0 | 7.283 |
| 0.0 | 7.283 |
| 0.0 | 7.283 |
| 0.0 | 7.283 |
| 0.0 | 7.283 |
| 0.0 | 7.283 |
| 0.0 | 7.283 |
| 0.0 | 7.283 |
| 0.0 | 7.283 |
| 0.0 | 7.283 |
| 0.0 | 7.283 |
| 0.0 | 7.283 |
| 0.0 | 7.283 |
| 0.0 | 7.283 |
| 0.0 | 7.283 |
| 0.0 | 7.283 |
| 0.0 | 7.283 |
| 0.0 | 7.283 |
| 0.0 | 7.283 |
| 0.0 | 7.283 |
| 0.0 | 7.283 |
| 0.0 | 7.283 |
| 0.0 | 7.283 |
| 0.0 | 7.283 |
| 0.0 | 7.283 |
| 0.0 | 7.283 |
| 0.0 | 7.283 |
| 0.0 | 7.283 |
| 0.0 | 7.283 |
| 0.0 | 7.283 |
| 0.0 | 7.283 |
| 0.0 | 7.283 |
| 0.0 | 7.283 |
| 0.0 | 7.283 |
| 0.0 | 7.283 |
| 0.0 | 7.283 |
| 0.0 | 7.283 |
| 0.0 | 7.283 |
| 0.0 | 7.283 |
| 0.0 | 7.283 |
| 0.0 | 7.283 |
| 0.0 | 7.283 |
| 0.0 | 7.283 |
| 0.0 | 7.283 |
| 0.0 | 7.283 |
| 0.0 | 7.283 |
| 0.0 | 7.283 |
| 0.0 | 7.283 |
| 0.0 | 7.283 |
| 0.0 | 7.283 |
| 0.0 | 7.283 |
| 0.0 | 7.283 |
| 0.0 | 7.283 |
| 0.0 | 7.283 |
| 0.0 | 7.283 |
| 0.0 | 7.283 |
| 0.0 | 7.283 |
| 0.0 | 7.283 |
| 0.0 | 7.283 |
| 0.0 | 7.283 |
| 0.0 | 7.283 |
| 0.0 | 7.283 |
| 0.0 | 7.283 |
| 0.0 | 7.283 |
| 0.0 | 7.283 |
| 0.0 | 7.283 |
| 0.0 | 7.283 |
| 0.0 | 7.283 |
| 0.0 | 7.283 |
| 0.0 | 7.283 |
| 0.0 | 7.283 |
| 0.0 | 7.283 |
| 0.0 | 7.283 |
| 0.0 | 7.283 |
| 0.0 | 7.283 |
| 0.0 | 7.283 |
| 0.0 | 7.283 |
| 0.0 | 7.283 |
| 0.0 | 7.283 |
| 0.0 | 7.283 |
| 0.0 | 7.283 |
| 0.0 | 7.283 |
| 0.0 | 7.283 |
| 0.0 | 7.283 |
| 0.0 | 7.283 |
| 0.0 | 7.283 |
| 0.0 | 7.283 |
| 0.0 | 7.283 |
| 0.0 | 7.283 |
| 0.0 | 7.283 |
| 0.0 | 7.283 |
| 0.0 | 7.283 |
| 0.0 | 7.283 |
| 0.0 | 7.283 |
| 0.0 | 7.283 |
| 0.0 | 7.283 |
| 0.0 | 7.283 |
| 0.0 | 7.283 |
| 0.0 | 7.283 |
| 0.0 | 7.283 |
| 0.0 | 7.283 |
| 0.0 | 7.283 |
| 0.0 | 7.283 |
| 0.0 | 7.283 |
| 0.0 | 7.283 |
| 0.0 | 7.283 |
| 0.0 | 7.283 |
| 0.0 | 7.283 |
| 0.0 | 7.283 |
| 0.0 | 7.283 |
| 0.0 | 7.283 |
| 0.0 | 7.283 |
| 0.0 | 7.283 |
| 0.0 | 7.283 |
| 0.0 | 7.283 |
| 0.0 | 7.283 |
| 0.0 | 7.283 |
| 0.0 | 7.283 |
| 0.0 | 7.283 |
| 0.0 | 7.283 |
| 0.0 | 7.283 |
| 0.0 | 7.283 |
| 0.0 | 7.283 |
| 0.0 | 7.283 |
| 0.0 | 7.283 |
| 0.0 | 7.283 |
| 0.0 | 7.283 |
| 0.0 | 7.283 |
| 0.0 | 7.283 |
| 0.0 | 7.283 |
| 0.0 | 7.283 |
| 0.0 | 7.283 |
| 0.0 | 7.283 |
| 0.0 | 7.283 |
| 0.0 | 7.283 |
| 0.0 | 7.283 |
| 0.0 | 7.283 |
| 0.0 | 7.283 |
| 0.0 | 7.283 |
| 0.0 | 7.283 |
| 0.0 | 7.283 |
| 0.0 | 7.283 |
| 0.0 | 7.283 |
| 0.0 | 7.283 |
| 0.0 | 7.283 |
| 0.0 | 7.283 |
| 0.0 | 7.283 |
| 0.0 | 7.283 |
| 0.0 | 7.283 |
| 0.0 | 7.283 |
| 0.0 | 7.283 |
| 0.0 | 7.283 |
| 0.0 | 7.283 |
| 0.0 | 7.283 |
| 0.0 | 7.283 |
| 0.0 | 7.283 |
| 0.0 | 7.283 |
| 0.0 | 7.283 |
| 0.0 | 7.283 |
| 0.0 | 7.283 |
| 0.0 | 7.283 |
| 0.0 | 7.283 |
| 0.0 | 7.283 |
| 0.0 | 7.283 |
| 0.0 | 7.283 |
| 0.0 | 7.283 |
| 0.0 | 7.283 |
| 0.0 | 7.283 |
| 0.0 | 7.283 |
| 0.0 | 7.283 |
| 0.0 | 7.283 |
| 0.0 | 7.283 |
| 0.0 | 7.283 |
| 0.0 | 7.283 |
| 0.0 | 7.283 |
| 0.0 | 7.283 |
| 0.0 | 7.283 |
| 0.0 | 7.283 |
| 0.0 | 7.283 |
| 0.0 | 7.283 |
| 0.0 | 7.283 |
| 0.0 | 7.283 |
| 0.0 | 7.283 |
| 0.0 | 7.283 |
| 0.0 | 7.283 |
| 0.0 | 7.283 |
| 0.0 | 7.283 |
| 0.0 | 7.283 |
| 0.0 | 7.283 |
| 0.0 | 7.283 |
| 0.0 | 7.283 |
| 0.0 | 7.283 |
| 0.0 | 7.283 |
| 0.0 | 7.283 |
| 0.0 | 7.283 |
| 0.0 | 7.283 |
| 0.0 | 7.283 |
| 0.0 | 7.283 |
| 0.0 | 7.283 |
| 0.0 | 7.283 |
| 0.0 | 7.283 |
| 0.0 | 7.283 |
| 0.0 | 7.283 |
| 0.0 | 7.283 |
| 0.0 | 7.283 |
| 0.0 | 7.283 |
| 0.0 | 7.283 |
| 0.0 | 7.283 |
| 0.0 | 7.283 |
| 0.0 | 7.283 |
| 0.0 | 7.283 |
| 0.0 | 7.283 |
| 0.0 | 7.283 |
| 0.0 | 7.283 |
| 0.0 | 7.283 |
| 0.0 | 7.283 |
| 0.0 | 7.283 |
| 0.0 | 7.283 |
| 0.0 | 7.283 |
| 0.0 | 7.283 |
| 0.0 | 7.283 |
| 0.0 | 7.283 |
| 0.0 | 7.283 |
| 0.0 | 7.283 |
| 0.0 | 7.283 |
| 0.0 | 7.283 |
| 0.0 | 7.283 |
| 0.0 | 7.283 |
| 0.0 | 7.283 |
| 0.0 | 7.283 |
| 0.0 | 7.283 |
| 0.0 | 7.283 |
| 0.0 | 7.283 |
| 0.0 | 7.283 |
| 0.0 | 7.283 |
| 0.0 | 7.283 |
| 0.0 | 7.283 |
| 0.0 | 7.283 |
| 0.0 | 7.283 |
| 0.0 | 7.283 |
| 0.0 | 7.283 |
| 0.0 | 7.283 |
| 0.0 | 7.283 |
| 0.0 | 7.283 |
| 0.0 | 7.283 |
| 0.0 | 7.283 |
| 0.0 | 7.283 |
| 0.0 | 7.283 |
| 0.0 | 7.283 |
| 0.0 | 7.283 |
| 0.0 | 7.283 |
| 0.0 | 7.283 |
| 0.0 | 7.283 |
| 0.0 | 7.283 |
| 0.0 | 7.283 |
| 0.0 | 7.283 |
| 0.0 | 7.283 |
| 0.0 | 7.283 |
| 0.0 | 7.283 |
| 0.0 | 7.283 |
| 0.0 | 7.283 |
| 0.0 | 7.283 |
| 0.0 | 7.283 |
| 0.0 | 7.283 |
| 0.0 | 7.283 |
| 0.0 | 7.283 |
| 0.0 | 7.283 |
| 0.0 | 7.283 |
| 0.0 | 7.283 |
| 0.0 | 7.283 |
| 0.0 | 7.283 |
| 0.0 | 7.283 |
| 0.0 | 7.283 |
| 0.0 | 7.283 |
| 0.0 | 7.283 |
| 0.0 | 7.283 |
| 0.0 | 7.283 |
| 0.0 | 7.283 |
| 0.0 | 7.283 |
| 0.0 | 7.283 |
| 0.0 | 7.283 |
| 0.0 | 7.283 |
| 0.0 | 7.283 |
| 0.0 | 7.283 |
| 0.0 | 7.283 |
| 0.0 | 7.283 |
| 0.0 | 7.283 |
| 0.0 | 7.283 |
| 0.0 | 7.283 |
| 0.0 | 7.283 |
| 0.0 | 7.283 |
| 0.0 | 7.283 |
| 0.0 | 7.283 |
| 0.0 | 7.283 |
| 0.0 | 7.283 |
| 0.0 | 7.283 |
| 0.0 | 7.283 |
| 0.0 | 7.283 |
| 0.0 | 7.283 |
| 0.0 | 7.283 |
| 0.0 | 7.283 |
| 0.0 | 7.283 |
| 0.0 | 7.283 |
| 0.0 | 7.283 |
| 0.0 | 7.283 |
| 0.0 | 7.283 |
| 0.0 | 7.283 |
| 0.0 | 7.283 |
| 0.0 | 7.283 |
| 0.0 | 7.283 |
| 0.0 | 7.283 |
| 0.0 | 7.283 |
| 0.0 | 7.283 |
| 0.0 | 7.283 |
| 0.0 | 7.283 |
| 0.0 | 7.283 |
| 0.0 | 7.283 |
| 0.0 | 7.283 |
| 0.0 | 7.283 |
| 0.0 | 7.283 |
| 0.0 | 7.283 |
| 0.0 | 7.283 |
| 0.0 | 7.283 |
| 0.0 | 7.283 |
| 0.0 | 7.283 |
| 0.0 | 7.283 |
| 0.0 | 7.283 |
| 0.0 | 7.283 |
| 0.0 | 7.283 |
| 0.0 | 7.283 |
| 0.0 | 7.283 |
| 0.0 | 7.283 |
| 0.0 | 7.283 |
| 0.0 | 7.283 |
| 0.0 | 7.283 |
| 0.0 | 7.283 |
| 0.0 | 7.283 |
| 0.0 | 7.283 |
| 0.0 | 7.283 |
| 0.0 | 7.283 |
| 0.0 | 7.283 |
| 0.0 | 7.283 |
| 0.0 | 7.283 |
| 0.0 | 7.283 |
| 0.0 | 7.283 |
| 0.0 | 7.283 |
| 0.0 | 7.283 |
| 0.0 | 7.283 |
| 0.0 | 7.283 |
| 0.0 | 7.283 |
| 0.0 | 7.283 |
| 0.0 | 7.283 |
| 0.0 | 7.283 |
| 0.0 | 7.283 |
| 0.0 | 7.283 |
| 0.0 | 7.283 |
| 0.0 | 7.283 |
| 0.0 | 7.283 |
| 0.0 | 7.283 |
| 0.0 | 7.283 |
| 0.0 | 7.283 |
| 0.0 | 7.283 |
| 0.0 | 7.283 |
| 0.0 | 7.283 |
| 0.0 | 7.283 |
| 0.0 | 7.283 |
| 0.0 | 7.283 |
| 0.0 | 7.283 |
| 0.0 | 7.283 |
| 0.0 | 7.283 |
| 0.0 | 7.283 |
| 0.0 | 7.283 |
| 0.0 | 7.283 |
| 0.0 | 7.283 |
| 0.0 | 7.283 |
| 0.0 | 7.283 |
| 0.0 | 7.283 |
| 0.0 | 7.283 |
| 0.0 | 7.283 |
| 0.0 | 7.283 |
| 0.0 | 7.283 |
| 0.0 | 7.283 |
| 0.0 | 7.283 |
| 0.0 | 7.283 |
| 0.0 | 7.283 |
| 0.0 | 7.283 |
| 0.0 | 7.283 |
| 0.0 | 7.283 |
| 0.0 | 7.283 |
| 0.0 | 7.283 |
| 0.0 | 7.283 |
| 0.0 | 7.283 |
| 0.0 | 7.283 |
| 0.0 | 7.283 |
| 0.0 | 7.283 |
| 0.0 | 7.283 |
| 0.0 | 7.283 |
| 0.0 | 7.283 |
| 0.0 | 7.283 |
| 0.0 | 7.283 |
| 0.0 | 7.283 |
| 0.0 | 7.283 |
| 0.0 | 7.283 |
| 0.0 | 7.283 |
| 0.0 | 7.283 |
| 0.0 | 7.283 |
| 0.0 | 7.283 |
| 0.0 | 7.283 |
| 0.0 | 7.283 |
| 0.0 | 7.283 |
| 0.0 | 7.283 |
| 0.0 | 7.283 |
| 0.0 | 7.283 |
| 0.0 | 7.283 |
| 0.0 | 7.283 |
| 0.0 | 7.283 |
| 0.0 | 7.283 |
| 0.0 | 7.283 |
| 0.0 | 7.283 |
| 0.0 | 7.283 |
| 0.0 | 7.283 |
| 0.0 | 7.283 |
| 0.0 | 7.283 |
| 0.0 | 7.283 |
| 0.0 | 7.283 |
| 0.0 | 7.283 |
| 0.0 | 7.283 |
| 0.0 | 7.283 |
| 0.0 | 7.283 |
| 0.0 | 7.283 |
| 0.0 | 7.283 |
| 0.0 | 7.283 |
| 0.0 | 7.283 |
| 0.0 | 7.283 |
| 0.0 | 7.283 |
| 0.0 | 7.283 |
| 0.0 | 7.283 |
| 0.0 | 7.283 |
| 0.0 | 7.283 |
| 0.0 | 7.283 |
| 0.0 | 7.283 |
| 0.0 | 7.283 |
| 0.0 | 7.283 |
| 0.0 | 7.283 |
| 0.0 | 7.283 |
| 0.0 | 7.283 |
| 0.0 | 7.283 |
| 0.0 | 7.283 |
| 0.0 | 7.283 |
| 0.0 | 7.283 |
| 0.0 | 7.283 |
| 0.0 | 7.283 |
| 0.0 | 7.283 |
| 0.0 | 7.283 |
| 0.0 | 7.283 |
| 0.0 | 7.283 |
| 0.0 | 7.283 |
| 0.0 | 7.283 |
| 0.0 | 7.283 |
| 0.0 | 7.283 |
| 0.0 | 7.283 |
| 0.0 | 7.283 |
| 0.0 | 7.283 |
| 0.0 | 7.283 |
| 0.0 | 7.283 |
| 0.0 | 7.283 |
| 0.0 | 7.283 |
| 0.0 | 7.283 |
| 0.0 | 7.283 |
| 0.0 | 7.283 |
| 0.0 | 7.283 |
| 0.0 | 7.283 |
| 0.0 | 7.283 |
| 0.0 | 7.283 |
| 0.0 | 7.283 |
| 0.0 | 7.283 |
| 0.0 | 7.283 |
| 0.0 | 7.283 |
| 0.0 | 7.283 |
| 0.0 | 7.283 |
| 0.0 | 7.283 |
| 0.0 | 7.283 |
| 0.0 | 7.283 |
| 0.0 | 7.283 |
| 0.0 | 7.283 |
| 0.0 | 7.283 |
| 0.0 | 7.283 |
| 0.0 | 7.283 |
| 0.0 | 7.283 |
| 0.0 | 7.283 |
| 0.0 | 7.283 |
| 0.0 | 7.283 |
| 0.0 | 7.283 |
| 0.0 | 7.283 |
| 0.0 | 7.283 |
| 0.0 | 7.283 |
| 0.0 | 7.283 |
| 0.0 | 7.283 |
| 0.0 | 7.283 |
| 0.0 | 7.283 |
| 0.0 | 7.283 |
| 0.0 | 7.283 |
| 0.0 | 7.283 |
| 0.0 | 7.283 |
| 0.0 | 7.283 |
| 0.0 | 7.283 |
| 0.0 | 7.283 |
| 0.0 | 7.283 |
| 0.0 | 7.283 |
| 0.0 | 7.283 |
| 0.0 | 7.283 |
| 0.0 | 7.283 |
| 0.0 | 7.283 |
| 0.0 | 7.283 |
| 0.0 | 7.283 |
| 0.0 | 7.283 |
| 0.0 | 7.283 |
| 0.0 | 7.283 |
| 0.0 | 7.283 |
| 0.0 | 7.283 |
| 0.0 | 7.283 |
| 0.0 | 7.283 |
| 0.0 | 7.283 |
| 0.0 | 7.283 |
| 0.0 | 7.283 |
| 0.0 | 7.283 |
| 0.0 | 7.283 |
| 0.0 | 7.283 |
| 0.0 | 7.283 |
| 0.0 | 7.283 |
| 0.0 | 7.283 |
| 0.0 | 7.283 |
| 0.0 | 7.283 |
| 0.0 | 7.283 |
| 0.0 | 7.283 |
| 0.0 | 7.283 |
| 0.0 | 7.283 |
| 0.0 | 7.283 |
| 0.0 | 7.283 |
| 0.0 | 7.283 |
| 0.0 | 7.283 |
| 0.0 | 7.283 |
| 0.0 | 7.283 |
| 0.0 | 7.283 |
| 0.0 | 7.283 |
| 0.0 | 7.283 |
| 0.0 | 7.283 |
| 0.0 | 7.283 |
| 0.0 | 7.283 |
| 0.0 | 7.283 |
| 0.0 | 7.283 |
| 0.0 | 7.283 |
| 0.0 | 7.283 |
| 0.0 | 7.283 |
| 0.0 | 7.283 |
| 0.0 | 7.283 |
| 0.0 | 7.283 |
| 0.0 | 7.283 |
| 0.0 | 7.283 |
| 0.0 | 7.283 |
| 0.0 | 7.283 |
| 0.0 | 7.283 |
| 0.0 | 7.283 |
| 0.0 | 7.283 |
| 0.0 | 7.283 |
| 0.0 | 7.283 |
| 0.0 | 7.283 |
| 0.0 | 7.283 |
| 0.0 | 7.283 |
| 0.0 | 7.283 |
| 0.0 | 7.283 |
| 0.0 | 7.283 |
| 0.0 | 7.283 |
| 0.0 | 7.283 |
| 0.0 | 7.283 |
| 0.0 | 7.283 |
| 0.0 | 7.283 |
| 0.0 | 7.283 |
| 0.0 | 7.283 |
| 0.0 | 7.283 |
| 0.0 | 7.283 |
| 0.0 | 7.283 |
| 0.0 | 7.283 |
| 0.0 | 7.283 |
| 0.0 | 7.283 |
| 0.0 | 7.283 |
| 0.0 | 7.283 |
| 0.0 | 7.283 |
| 0.0 | 7.283 |
| 0.0 | 7.283 |
| 0.0 | 7.283 |
| 0.0 | 7.283 |
| 0.0 | 7.283 |
| 0.0 | 7.283 |
| 0.0 | 7.283 |
| 0.0 | 7.283 |
| 0.0 | 7.283 |
| 0.0 | 7.283 |
| 0.0 | 7.283 |
| 0.0 | 7.283 |
| 0.0 | 7.283 |
| 0.0 | 7.283 |
| 0.0 | 7.283 |
| 0.0 | 7.283 |
| 0.0 | 7.283 |
| 0.0 | 7.283 |
| 0.0 | 7.283 |
| 0.0 | 7.283 |
| 0.0 | 7.283 |
| 0.0 | 7.283 |
| 0.0 | 7.283 |
| 0.0 | 7.283 |
| 0.0 | 7.283 |
| 0.0 | 7.283 |
| 0.0 | 7.283 |
| 0.0 | 7.283 |
| 0.0 | 7.283 |
| 0.0 | 7.283 |
| 0.0 | 7.283 |
| 0.0 | 7.283 |
| 0.0 | 7.283 |
| 0.0 | 7.283 |
| 0.0 | 7.283 |
| 0.0 | 7.283 |
| 0.0 | 7.283 |
| 0.0 | 7.283 |
| 0.0 | 7.283 |
| 0.0 | 7.283 |
| 0.0 | 7.283 |
| 0.0 | 7.283 |
| 0.0 | 7.283 |
| 0.0 | 7.283 |
| 0.0 | 7.283 |
| 0.0 | 7.283 |
| 0.0 | 7.283 |
| 0.0 | 7.283 |
| 0.0 | 7.283 |
| 0.0 | 7.283 |
| 0.0 | 7.283 |
| 0.0 | 7.283 |
| 0.0 | 7.283 |
| 0.0 | 7.283 |
| 0.0 | 7.283 |
| 0.0 | 7.283 |
| 0.0 | 7.283 |
| 0.0 | 7.283 |
| 0.0 | 7.283 |
| 0.0 | 7.283 |
| 0.0 | 7.283 |
| 0.0 | 7.283 |
| 0.0 | 7.283 |
| 0.0 | 7.283 |
| 0.0 | 7.283 |
| 0.0 | 7.283 |
| 0.0 | 7.283 |
| 0.0 | 7.283 |
| 0.0 | 7.283 |
| 0.0 | 7.283 |
| 0.0 | 7.283 |
| 0.0 | 7.283 |
| 0.0 | 7.283 |
| 0.0 | 7.283 |
| 0.0 | 7.283 |
| 0.0 | 7.283 |
| 0.0 | 7.283 |
| 0.0 | 7.283 |
| 0.0 | 7.283 |
| 0.0 | 7.283 |
| 0.0 | 7.283 |
| 0.0 | 7.283 |
| 0.0 | 7.283 |
| 0.0 | 7.283 |
| 0.0 | 7.283 |
| 0.0 | 7.283 |
| 0.0 | 7.283 |
| 0.0 | 7.283 |
| 0.0 | 7.283 |
| 0.0 | 7.283 |
| 0.0 | 7.283 |
| 0.0 | 7.283 |
| 0.0 | 7.283 |
| 0.0 | 7.283 |
| 0.0 | 7.283 |
| 0.0 | 7.283 |
| 0.0 | 7.283 |
| 0.0 | 7.283 |
| 0.0 | 7.283 |
| 0.0 | 7.283 |
| 0.0 | 7.283 |
| 0.0 | 7.283 |
| 0.0 | 7.283 |
| 0.0 | 7.283 |
| 0.0 | 7.283 |
| 0.0 | 7.283 |
| 0.0 | 7.283 |
| 0.0 | 7.283 |